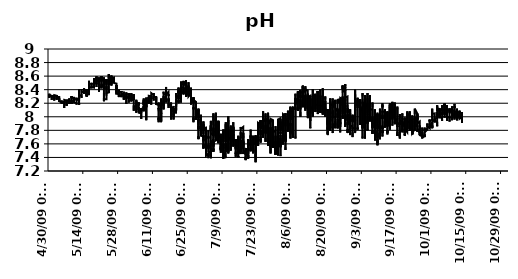
| Category | pH |
|---|---|
| 10/13/09 | 8.05 |
| 10/13/09 | 8.05 |
| 10/13/09 | 8.06 |
| 10/13/09 | 8.06 |
| 10/13/09 | 8.07 |
| 10/13/09 | 8.05 |
| 10/13/09 | 8.04 |
| 10/13/09 | 8.05 |
| 10/13/09 | 8.05 |
| 10/13/09 | 7.96 |
| 10/13/09 | 8.01 |
| 10/13/09 | 7.99 |
| 10/13/09 | 8 |
| 10/13/09 | 8.01 |
| 10/13/09 | 8 |
| 10/13/09 | 7.99 |
| 10/13/09 | 7.98 |
| 10/13/09 | 7.96 |
| 10/13/09 | 7.96 |
| 10/13/09 | 7.98 |
| 10/13/09 | 7.94 |
| 10/13/09 | 7.93 |
| 10/13/09 | 7.91 |
| 10/13/09 | 7.95 |
| 10/13/09 | 7.96 |
| 10/13/09 | 7.98 |
| 10/13/09 | 8 |
| 10/13/09 | 7.99 |
| 10/13/09 | 7.98 |
| 10/13/09 | 8 |
| 10/13/09 | 8 |
| 10/13/09 | 8 |
| 10/12/09 | 7.97 |
| 10/12/09 | 8.01 |
| 10/12/09 | 8 |
| 10/12/09 | 8 |
| 10/12/09 | 8.04 |
| 10/12/09 | 8.02 |
| 10/12/09 | 8.02 |
| 10/12/09 | 8 |
| 10/12/09 | 8.04 |
| 10/12/09 | 8.07 |
| 10/12/09 | 8.05 |
| 10/12/09 | 8.09 |
| 10/12/09 | 8.09 |
| 10/12/09 | 8.07 |
| 10/12/09 | 8.05 |
| 10/12/09 | 8.08 |
| 10/12/09 | 8.06 |
| 10/12/09 | 8.06 |
| 10/12/09 | 8.07 |
| 10/12/09 | 8.08 |
| 10/12/09 | 8.08 |
| 10/12/09 | 8.06 |
| 10/12/09 | 8.05 |
| 10/12/09 | 8.05 |
| 10/12/09 | 8.04 |
| 10/12/09 | 8.02 |
| 10/12/09 | 8.02 |
| 10/12/09 | 8.02 |
| 10/12/09 | 8.01 |
| 10/12/09 | 8 |
| 10/12/09 | 8 |
| 10/12/09 | 8 |
| 10/12/09 | 8.01 |
| 10/12/09 | 8.02 |
| 10/12/09 | 7.99 |
| 10/12/09 | 8.02 |
| 10/12/09 | 8.01 |
| 10/12/09 | 8.02 |
| 10/12/09 | 8 |
| 10/12/09 | 8 |
| 10/12/09 | 7.97 |
| 10/12/09 | 8.02 |
| 10/12/09 | 8.05 |
| 10/12/09 | 8.04 |
| 10/12/09 | 8.04 |
| 10/12/09 | 8.03 |
| 10/12/09 | 8.05 |
| 10/12/09 | 8.03 |
| 10/11/09 | 7.99 |
| 10/11/09 | 8.04 |
| 10/11/09 | 8.07 |
| 10/11/09 | 8.1 |
| 10/11/09 | 8.1 |
| 10/11/09 | 8.09 |
| 10/11/09 | 8.08 |
| 10/11/09 | 8.08 |
| 10/11/09 | 8.1 |
| 10/11/09 | 8.11 |
| 10/11/09 | 8.12 |
| 10/11/09 | 8.1 |
| 10/11/09 | 8.05 |
| 10/11/09 | 8.09 |
| 10/11/09 | 8.05 |
| 10/11/09 | 8.02 |
| 10/11/09 | 8.07 |
| 10/11/09 | 8.04 |
| 10/11/09 | 7.98 |
| 10/11/09 | 8.02 |
| 10/11/09 | 7.99 |
| 10/11/09 | 8 |
| 10/11/09 | 8.05 |
| 10/11/09 | 8.06 |
| 10/11/09 | 8.04 |
| 10/11/09 | 8.02 |
| 10/11/09 | 8.02 |
| 10/11/09 | 8 |
| 10/11/09 | 8.01 |
| 10/11/09 | 7.98 |
| 10/11/09 | 8 |
| 10/11/09 | 7.99 |
| 10/11/09 | 8.02 |
| 10/11/09 | 8.01 |
| 10/11/09 | 8.02 |
| 10/11/09 | 7.99 |
| 10/11/09 | 8.03 |
| 10/11/09 | 7.98 |
| 10/11/09 | 8.01 |
| 10/11/09 | 7.95 |
| 10/11/09 | 7.99 |
| 10/11/09 | 8 |
| 10/11/09 | 7.99 |
| 10/11/09 | 7.95 |
| 10/11/09 | 8.06 |
| 10/11/09 | 8.03 |
| 10/11/09 | 8.05 |
| 10/11/09 | 8.05 |
| 10/10/09 | 8.09 |
| 10/10/09 | 8.08 |
| 10/10/09 | 8.1 |
| 10/10/09 | 8.09 |
| 10/10/09 | 8.12 |
| 10/10/09 | 8.13 |
| 10/10/09 | 8.12 |
| 10/10/09 | 8.14 |
| 10/10/09 | 8.14 |
| 10/10/09 | 8.16 |
| 10/10/09 | 8.13 |
| 10/10/09 | 8.15 |
| 10/10/09 | 8.17 |
| 10/10/09 | 8.19 |
| 10/10/09 | 8.17 |
| 10/10/09 | 8.17 |
| 10/10/09 | 8.17 |
| 10/10/09 | 8.15 |
| 10/10/09 | 8.12 |
| 10/10/09 | 8.06 |
| 10/10/09 | 8.04 |
| 10/10/09 | 8.04 |
| 10/10/09 | 8.05 |
| 10/10/09 | 8.04 |
| 10/10/09 | 8.04 |
| 10/10/09 | 8.06 |
| 10/10/09 | 8.03 |
| 10/10/09 | 8.03 |
| 10/10/09 | 8.02 |
| 10/10/09 | 7.98 |
| 10/10/09 | 8.02 |
| 10/10/09 | 8 |
| 10/10/09 | 8.03 |
| 10/10/09 | 8.02 |
| 10/10/09 | 8.03 |
| 10/10/09 | 8.04 |
| 10/10/09 | 8.04 |
| 10/10/09 | 8.06 |
| 10/10/09 | 8.01 |
| 10/10/09 | 8 |
| 10/10/09 | 8.02 |
| 10/10/09 | 8.06 |
| 10/10/09 | 8.05 |
| 10/10/09 | 8.06 |
| 10/10/09 | 8.09 |
| 10/10/09 | 7.99 |
| 10/10/09 | 7.96 |
| 10/10/09 | 8.08 |
| 10/9/09 | 8.1 |
| 10/9/09 | 8.06 |
| 10/9/09 | 8.06 |
| 10/9/09 | 8.15 |
| 10/9/09 | 8.08 |
| 10/9/09 | 8.15 |
| 10/9/09 | 8.14 |
| 10/9/09 | 8.13 |
| 10/9/09 | 8.09 |
| 10/9/09 | 8.08 |
| 10/9/09 | 8.1 |
| 10/9/09 | 8.12 |
| 10/9/09 | 8.07 |
| 10/9/09 | 8.13 |
| 10/9/09 | 8.1 |
| 10/9/09 | 8.07 |
| 10/9/09 | 8.04 |
| 10/9/09 | 8.03 |
| 10/9/09 | 8.06 |
| 10/9/09 | 8.04 |
| 10/9/09 | 7.98 |
| 10/9/09 | 8.05 |
| 10/9/09 | 7.95 |
| 10/9/09 | 8.01 |
| 10/9/09 | 7.98 |
| 10/9/09 | 8 |
| 10/9/09 | 7.98 |
| 10/9/09 | 8 |
| 10/9/09 | 7.98 |
| 10/9/09 | 8.02 |
| 10/9/09 | 8.01 |
| 10/9/09 | 8.04 |
| 10/9/09 | 8.05 |
| 10/9/09 | 8.07 |
| 10/9/09 | 8.06 |
| 10/9/09 | 8.08 |
| 10/9/09 | 8.04 |
| 10/9/09 | 8.03 |
| 10/9/09 | 8.02 |
| 10/9/09 | 8 |
| 10/9/09 | 8.03 |
| 10/9/09 | 8.02 |
| 10/9/09 | 8.04 |
| 10/9/09 | 8.02 |
| 10/9/09 | 8.05 |
| 10/9/09 | 8.11 |
| 10/9/09 | 8.09 |
| 10/9/09 | 8.07 |
| 10/8/09 | 8.09 |
| 10/8/09 | 8.1 |
| 10/8/09 | 8.11 |
| 10/8/09 | 8.12 |
| 10/8/09 | 8.09 |
| 10/8/09 | 8.12 |
| 10/8/09 | 8.1 |
| 10/8/09 | 8.08 |
| 10/8/09 | 8.05 |
| 10/8/09 | 8.11 |
| 10/8/09 | 8.08 |
| 10/8/09 | 8.1 |
| 10/8/09 | 8.1 |
| 10/8/09 | 8.12 |
| 10/8/09 | 8.11 |
| 10/8/09 | 8.1 |
| 10/8/09 | 8.12 |
| 10/8/09 | 8.12 |
| 10/8/09 | 8.06 |
| 10/8/09 | 8.06 |
| 10/8/09 | 8.06 |
| 10/8/09 | 8.03 |
| 10/8/09 | 8.02 |
| 10/8/09 | 8.01 |
| 10/8/09 | 8.01 |
| 10/8/09 | 7.97 |
| 10/8/09 | 7.93 |
| 10/8/09 | 7.95 |
| 10/8/09 | 7.95 |
| 10/8/09 | 7.95 |
| 10/8/09 | 7.96 |
| 10/8/09 | 7.97 |
| 10/8/09 | 7.96 |
| 10/8/09 | 7.97 |
| 10/8/09 | 7.96 |
| 10/8/09 | 7.97 |
| 10/8/09 | 7.98 |
| 10/8/09 | 7.97 |
| 10/8/09 | 8 |
| 10/8/09 | 7.98 |
| 10/8/09 | 7.99 |
| 10/8/09 | 8 |
| 10/8/09 | 7.99 |
| 10/8/09 | 8 |
| 10/8/09 | 8 |
| 10/8/09 | 8 |
| 10/8/09 | 7.99 |
| 10/8/09 | 7.99 |
| 10/7/09 | 7.99 |
| 10/7/09 | 8 |
| 10/7/09 | 8.01 |
| 10/7/09 | 8 |
| 10/7/09 | 7.99 |
| 10/7/09 | 8.01 |
| 10/7/09 | 8.01 |
| 10/7/09 | 8.01 |
| 10/7/09 | 8.02 |
| 10/7/09 | 8.02 |
| 10/7/09 | 8.04 |
| 10/7/09 | 8.05 |
| 10/7/09 | 8.05 |
| 10/7/09 | 8.04 |
| 10/7/09 | 8.05 |
| 10/7/09 | 8.05 |
| 10/7/09 | 8.03 |
| 10/7/09 | 8.03 |
| 10/7/09 | 8.03 |
| 10/7/09 | 8.03 |
| 10/7/09 | 8.03 |
| 10/7/09 | 8.03 |
| 10/7/09 | 8.04 |
| 10/7/09 | 8.03 |
| 10/7/09 | 8.01 |
| 10/7/09 | 8 |
| 10/7/09 | 7.99 |
| 10/7/09 | 7.99 |
| 10/7/09 | 7.98 |
| 10/7/09 | 7.98 |
| 10/7/09 | 7.98 |
| 10/7/09 | 7.99 |
| 10/7/09 | 7.99 |
| 10/7/09 | 8 |
| 10/7/09 | 7.98 |
| 10/7/09 | 7.97 |
| 10/7/09 | 7.94 |
| 10/7/09 | 8 |
| 10/7/09 | 7.98 |
| 10/7/09 | 8.07 |
| 10/7/09 | 8.06 |
| 10/7/09 | 8.08 |
| 10/7/09 | 8.09 |
| 10/7/09 | 8.1 |
| 10/7/09 | 8.13 |
| 10/7/09 | 8.13 |
| 10/7/09 | 8.16 |
| 10/7/09 | 8.17 |
| 10/6/09 | 8.16 |
| 10/6/09 | 8.17 |
| 10/6/09 | 8.17 |
| 10/6/09 | 8.17 |
| 10/6/09 | 8.18 |
| 10/6/09 | 8.11 |
| 10/6/09 | 8.13 |
| 10/6/09 | 8.05 |
| 10/6/09 | 8.07 |
| 10/6/09 | 8.13 |
| 10/6/09 | 8.17 |
| 10/6/09 | 8.17 |
| 10/6/09 | 8.16 |
| 10/6/09 | 8.19 |
| 10/6/09 | 8.13 |
| 10/6/09 | 8.2 |
| 10/6/09 | 8.17 |
| 10/6/09 | 8.12 |
| 10/6/09 | 8.09 |
| 10/6/09 | 8.09 |
| 10/6/09 | 8.11 |
| 10/6/09 | 8.05 |
| 10/6/09 | 8.03 |
| 10/6/09 | 8.08 |
| 10/6/09 | 8.04 |
| 10/6/09 | 7.99 |
| 10/6/09 | 7.98 |
| 10/6/09 | 8 |
| 10/6/09 | 8.01 |
| 10/6/09 | 8.01 |
| 10/6/09 | 7.99 |
| 10/6/09 | 8.01 |
| 10/6/09 | 8.02 |
| 10/6/09 | 8.05 |
| 10/6/09 | 8.05 |
| 10/6/09 | 8.05 |
| 10/6/09 | 8.05 |
| 10/6/09 | 8.03 |
| 10/6/09 | 8.05 |
| 10/6/09 | 8.05 |
| 10/6/09 | 8.05 |
| 10/6/09 | 8.06 |
| 10/6/09 | 8.07 |
| 10/6/09 | 8.07 |
| 10/6/09 | 8.05 |
| 10/6/09 | 8.06 |
| 10/6/09 | 8.09 |
| 10/6/09 | 8.1 |
| 10/5/09 | 8.11 |
| 10/5/09 | 8.13 |
| 10/5/09 | 8.13 |
| 10/5/09 | 8.12 |
| 10/5/09 | 8.13 |
| 10/5/09 | 8.14 |
| 10/5/09 | 8.12 |
| 10/5/09 | 8.08 |
| 10/5/09 | 8.15 |
| 10/5/09 | 8.11 |
| 10/5/09 | 8.17 |
| 10/5/09 | 8.1 |
| 10/5/09 | 8.12 |
| 10/5/09 | 8.1 |
| 10/5/09 | 8.05 |
| 10/5/09 | 8.06 |
| 10/5/09 | 8.06 |
| 10/5/09 | 8.05 |
| 10/5/09 | 8.07 |
| 10/5/09 | 8.05 |
| 10/5/09 | 8.03 |
| 10/5/09 | 8.04 |
| 10/5/09 | 8.03 |
| 10/5/09 | 8.05 |
| 10/5/09 | 8.02 |
| 10/5/09 | 8.01 |
| 10/5/09 | 7.98 |
| 10/5/09 | 7.94 |
| 10/5/09 | 7.93 |
| 10/5/09 | 7.94 |
| 10/5/09 | 7.93 |
| 10/5/09 | 7.94 |
| 10/5/09 | 7.93 |
| 10/5/09 | 7.93 |
| 10/5/09 | 7.93 |
| 10/5/09 | 7.93 |
| 10/5/09 | 7.93 |
| 10/5/09 | 7.95 |
| 10/5/09 | 7.93 |
| 10/5/09 | 7.94 |
| 10/5/09 | 7.94 |
| 10/5/09 | 7.94 |
| 10/5/09 | 7.94 |
| 10/5/09 | 7.95 |
| 10/5/09 | 7.95 |
| 10/5/09 | 7.96 |
| 10/5/09 | 7.96 |
| 10/5/09 | 7.98 |
| 10/4/09 | 8 |
| 10/4/09 | 8 |
| 10/4/09 | 8.01 |
| 10/4/09 | 8.01 |
| 10/4/09 | 8.01 |
| 10/4/09 | 8.04 |
| 10/4/09 | 8.04 |
| 10/4/09 | 8.05 |
| 10/4/09 | 8.05 |
| 10/4/09 | 8.07 |
| 10/4/09 | 8.06 |
| 10/4/09 | 8.06 |
| 10/4/09 | 8.09 |
| 10/4/09 | 8.11 |
| 10/4/09 | 8.1 |
| 10/4/09 | 8.06 |
| 10/4/09 | 8.03 |
| 10/4/09 | 8 |
| 10/4/09 | 8.05 |
| 10/4/09 | 8.05 |
| 10/4/09 | 8.04 |
| 10/4/09 | 8.04 |
| 10/4/09 | 8.04 |
| 10/4/09 | 8.05 |
| 10/4/09 | 8.03 |
| 10/4/09 | 8.01 |
| 10/4/09 | 7.98 |
| 10/4/09 | 7.99 |
| 10/4/09 | 8.02 |
| 10/4/09 | 8.04 |
| 10/4/09 | 8 |
| 10/4/09 | 8.01 |
| 10/4/09 | 7.98 |
| 10/4/09 | 8.04 |
| 10/4/09 | 8.01 |
| 10/4/09 | 8.06 |
| 10/4/09 | 8.05 |
| 10/4/09 | 8.05 |
| 10/4/09 | 8.08 |
| 10/4/09 | 8.07 |
| 10/4/09 | 8.09 |
| 10/4/09 | 8.13 |
| 10/4/09 | 8.11 |
| 10/4/09 | 8.08 |
| 10/4/09 | 8.11 |
| 10/4/09 | 8.06 |
| 10/4/09 | 8.04 |
| 10/4/09 | 8.1 |
| 10/3/09 | 8.13 |
| 10/3/09 | 8.09 |
| 10/3/09 | 8.12 |
| 10/3/09 | 8.1 |
| 10/3/09 | 8.17 |
| 10/3/09 | 8.1 |
| 10/3/09 | 8.12 |
| 10/3/09 | 8.1 |
| 10/3/09 | 8.11 |
| 10/3/09 | 8.13 |
| 10/3/09 | 8.1 |
| 10/3/09 | 8.15 |
| 10/3/09 | 8.15 |
| 10/3/09 | 8.15 |
| 10/3/09 | 8.16 |
| 10/3/09 | 8.13 |
| 10/3/09 | 8.13 |
| 10/3/09 | 8.1 |
| 10/3/09 | 8.03 |
| 10/3/09 | 7.97 |
| 10/3/09 | 8.03 |
| 10/3/09 | 8.07 |
| 10/3/09 | 8.05 |
| 10/3/09 | 8.01 |
| 10/3/09 | 7.98 |
| 10/3/09 | 7.93 |
| 10/3/09 | 7.89 |
| 10/3/09 | 7.86 |
| 10/3/09 | 7.87 |
| 10/3/09 | 7.88 |
| 10/3/09 | 7.89 |
| 10/3/09 | 7.9 |
| 10/3/09 | 7.9 |
| 10/3/09 | 7.9 |
| 10/3/09 | 7.89 |
| 10/3/09 | 7.9 |
| 10/3/09 | 7.9 |
| 10/3/09 | 7.92 |
| 10/3/09 | 7.91 |
| 10/3/09 | 7.92 |
| 10/3/09 | 7.92 |
| 10/3/09 | 7.92 |
| 10/3/09 | 7.92 |
| 10/3/09 | 7.92 |
| 10/3/09 | 7.91 |
| 10/3/09 | 7.93 |
| 10/3/09 | 7.91 |
| 10/3/09 | 7.92 |
| 10/2/09 | 7.95 |
| 10/2/09 | 7.95 |
| 10/2/09 | 7.96 |
| 10/2/09 | 7.95 |
| 10/2/09 | 7.96 |
| 10/2/09 | 7.97 |
| 10/2/09 | 7.96 |
| 10/2/09 | 7.98 |
| 10/2/09 | 7.96 |
| 10/2/09 | 7.96 |
| 10/2/09 | 7.99 |
| 10/2/09 | 7.98 |
| 10/2/09 | 8 |
| 10/2/09 | 8 |
| 10/2/09 | 8 |
| 10/2/09 | 7.99 |
| 10/2/09 | 7.99 |
| 10/2/09 | 7.99 |
| 10/2/09 | 7.92 |
| 10/2/09 | 7.95 |
| 10/2/09 | 7.92 |
| 10/2/09 | 7.94 |
| 10/2/09 | 7.97 |
| 10/2/09 | 7.98 |
| 10/2/09 | 7.97 |
| 10/2/09 | 7.93 |
| 10/2/09 | 7.94 |
| 10/2/09 | 7.95 |
| 10/2/09 | 7.96 |
| 10/2/09 | 7.94 |
| 10/2/09 | 7.95 |
| 10/2/09 | 7.95 |
| 10/2/09 | 7.93 |
| 10/2/09 | 7.94 |
| 10/2/09 | 7.93 |
| 10/2/09 | 7.94 |
| 10/2/09 | 7.94 |
| 10/2/09 | 7.95 |
| 10/2/09 | 7.97 |
| 10/2/09 | 7.96 |
| 10/2/09 | 7.96 |
| 10/2/09 | 7.96 |
| 10/2/09 | 7.97 |
| 10/2/09 | 7.98 |
| 10/2/09 | 8 |
| 10/2/09 | 8.01 |
| 10/2/09 | 8.02 |
| 10/2/09 | 8.05 |
| 10/1/09 | 8.04 |
| 10/1/09 | 8.04 |
| 10/1/09 | 8.05 |
| 10/1/09 | 8.06 |
| 10/1/09 | 8.07 |
| 10/1/09 | 8.07 |
| 10/1/09 | 8.09 |
| 10/1/09 | 8.09 |
| 10/1/09 | 8.12 |
| 10/1/09 | 8.04 |
| 10/1/09 | 8.04 |
| 10/1/09 | 8.06 |
| 10/1/09 | 7.99 |
| 10/1/09 | 8 |
| 10/1/09 | 8.03 |
| 10/1/09 | 8.02 |
| 10/1/09 | 7.98 |
| 10/1/09 | 7.95 |
| 10/1/09 | 7.97 |
| 10/1/09 | 7.94 |
| 10/1/09 | 7.9 |
| 10/1/09 | 7.86 |
| 10/1/09 | 7.92 |
| 10/1/09 | 7.89 |
| 10/1/09 | 7.9 |
| 10/1/09 | 7.87 |
| 10/1/09 | 7.88 |
| 10/1/09 | 7.83 |
| 10/1/09 | 7.84 |
| 10/1/09 | 7.84 |
| 10/1/09 | 7.84 |
| 10/1/09 | 7.83 |
| 10/1/09 | 7.83 |
| 10/1/09 | 7.83 |
| 10/1/09 | 7.83 |
| 10/1/09 | 7.84 |
| 10/1/09 | 7.84 |
| 10/1/09 | 7.85 |
| 10/1/09 | 7.86 |
| 10/1/09 | 7.85 |
| 10/1/09 | 7.85 |
| 10/1/09 | 7.87 |
| 10/1/09 | 7.87 |
| 10/1/09 | 7.84 |
| 10/1/09 | 7.86 |
| 10/1/09 | 7.86 |
| 10/1/09 | 7.84 |
| 10/1/09 | 7.87 |
| 9/30/09 | 7.88 |
| 9/30/09 | 7.88 |
| 9/30/09 | 7.87 |
| 9/30/09 | 7.87 |
| 9/30/09 | 7.9 |
| 9/30/09 | 7.91 |
| 9/30/09 | 7.93 |
| 9/30/09 | 7.95 |
| 9/30/09 | 7.96 |
| 9/30/09 | 7.93 |
| 9/30/09 | 7.96 |
| 9/30/09 | 7.95 |
| 9/30/09 | 7.96 |
| 9/30/09 | 7.95 |
| 9/30/09 | 7.94 |
| 9/30/09 | 7.93 |
| 9/30/09 | 7.91 |
| 9/30/09 | 7.9 |
| 9/30/09 | 7.91 |
| 9/30/09 | 7.88 |
| 9/30/09 | 7.89 |
| 9/30/09 | 7.89 |
| 9/30/09 | 7.89 |
| 9/30/09 | 7.89 |
| 9/30/09 | 7.89 |
| 9/30/09 | 7.9 |
| 9/30/09 | 7.89 |
| 9/30/09 | 7.87 |
| 9/30/09 | 7.86 |
| 9/30/09 | 7.84 |
| 9/30/09 | 7.83 |
| 9/30/09 | 7.83 |
| 9/30/09 | 7.83 |
| 9/30/09 | 7.83 |
| 9/30/09 | 7.85 |
| 9/30/09 | 7.87 |
| 9/30/09 | 7.85 |
| 9/30/09 | 7.84 |
| 9/30/09 | 7.85 |
| 9/30/09 | 7.86 |
| 9/30/09 | 7.84 |
| 9/30/09 | 7.86 |
| 9/30/09 | 7.86 |
| 9/30/09 | 7.85 |
| 9/30/09 | 7.86 |
| 9/30/09 | 7.87 |
| 9/30/09 | 7.87 |
| 9/30/09 | 7.83 |
| 9/29/09 | 7.86 |
| 9/29/09 | 7.87 |
| 9/29/09 | 7.86 |
| 9/29/09 | 7.88 |
| 9/29/09 | 7.88 |
| 9/29/09 | 7.88 |
| 9/29/09 | 7.88 |
| 9/29/09 | 7.89 |
| 9/29/09 | 7.89 |
| 9/29/09 | 7.88 |
| 9/29/09 | 7.89 |
| 9/29/09 | 7.9 |
| 9/29/09 | 7.9 |
| 9/29/09 | 7.9 |
| 9/29/09 | 7.9 |
| 9/29/09 | 7.89 |
| 9/29/09 | 7.89 |
| 9/29/09 | 7.89 |
| 9/29/09 | 7.89 |
| 9/29/09 | 7.88 |
| 9/29/09 | 7.87 |
| 9/29/09 | 7.87 |
| 9/29/09 | 7.87 |
| 9/29/09 | 7.85 |
| 9/29/09 | 7.84 |
| 9/29/09 | 7.85 |
| 9/29/09 | 7.83 |
| 9/29/09 | 7.83 |
| 9/29/09 | 7.82 |
| 9/29/09 | 7.82 |
| 9/29/09 | 7.82 |
| 9/29/09 | 7.82 |
| 9/29/09 | 7.81 |
| 9/29/09 | 7.82 |
| 9/29/09 | 7.83 |
| 9/29/09 | 7.82 |
| 9/29/09 | 7.82 |
| 9/29/09 | 7.82 |
| 9/29/09 | 7.83 |
| 9/29/09 | 7.83 |
| 9/29/09 | 7.82 |
| 9/29/09 | 7.82 |
| 9/29/09 | 7.81 |
| 9/29/09 | 7.81 |
| 9/29/09 | 7.82 |
| 9/29/09 | 7.81 |
| 9/29/09 | 7.82 |
| 9/29/09 | 7.82 |
| 9/28/09 | 7.77 |
| 9/28/09 | 7.82 |
| 9/28/09 | 7.81 |
| 9/28/09 | 7.79 |
| 9/28/09 | 7.82 |
| 9/28/09 | 7.83 |
| 9/28/09 | 7.84 |
| 9/28/09 | 7.85 |
| 9/28/09 | 7.84 |
| 9/28/09 | 7.85 |
| 9/28/09 | 7.84 |
| 9/28/09 | 7.84 |
| 9/28/09 | 7.85 |
| 9/28/09 | 7.84 |
| 9/28/09 | 7.82 |
| 9/28/09 | 7.83 |
| 9/28/09 | 7.82 |
| 9/28/09 | 7.82 |
| 9/28/09 | 7.81 |
| 9/28/09 | 7.8 |
| 9/28/09 | 7.8 |
| 9/28/09 | 7.79 |
| 9/28/09 | 7.77 |
| 9/28/09 | 7.77 |
| 9/28/09 | 7.78 |
| 9/28/09 | 7.74 |
| 9/28/09 | 7.74 |
| 9/28/09 | 7.74 |
| 9/28/09 | 7.74 |
| 9/28/09 | 7.74 |
| 9/28/09 | 7.74 |
| 9/28/09 | 7.74 |
| 9/28/09 | 7.73 |
| 9/28/09 | 7.72 |
| 9/28/09 | 7.73 |
| 9/28/09 | 7.74 |
| 9/28/09 | 7.73 |
| 9/28/09 | 7.71 |
| 9/28/09 | 7.71 |
| 9/28/09 | 7.73 |
| 9/28/09 | 7.72 |
| 9/28/09 | 7.71 |
| 9/28/09 | 7.72 |
| 9/28/09 | 7.73 |
| 9/28/09 | 7.72 |
| 9/28/09 | 7.72 |
| 9/28/09 | 7.73 |
| 9/28/09 | 7.71 |
| 9/27/09 | 7.7 |
| 9/27/09 | 7.73 |
| 9/27/09 | 7.72 |
| 9/27/09 | 7.74 |
| 9/27/09 | 7.69 |
| 9/27/09 | 7.73 |
| 9/27/09 | 7.79 |
| 9/27/09 | 7.8 |
| 9/27/09 | 7.84 |
| 9/27/09 | 7.82 |
| 9/27/09 | 7.83 |
| 9/27/09 | 7.81 |
| 9/27/09 | 7.81 |
| 9/27/09 | 7.78 |
| 9/27/09 | 7.76 |
| 9/27/09 | 7.77 |
| 9/27/09 | 7.77 |
| 9/27/09 | 7.75 |
| 9/27/09 | 7.75 |
| 9/27/09 | 7.75 |
| 9/27/09 | 7.74 |
| 9/27/09 | 7.77 |
| 9/27/09 | 7.75 |
| 9/27/09 | 7.75 |
| 9/27/09 | 7.75 |
| 9/27/09 | 7.71 |
| 9/27/09 | 7.68 |
| 9/27/09 | 7.67 |
| 9/27/09 | 7.71 |
| 9/27/09 | 7.72 |
| 9/27/09 | 7.73 |
| 9/27/09 | 7.73 |
| 9/27/09 | 7.72 |
| 9/27/09 | 7.72 |
| 9/27/09 | 7.72 |
| 9/27/09 | 7.7 |
| 9/27/09 | 7.72 |
| 9/27/09 | 7.72 |
| 9/27/09 | 7.7 |
| 9/27/09 | 7.72 |
| 9/27/09 | 7.72 |
| 9/27/09 | 7.73 |
| 9/27/09 | 7.72 |
| 9/27/09 | 7.75 |
| 9/27/09 | 7.74 |
| 9/27/09 | 7.74 |
| 9/27/09 | 7.75 |
| 9/27/09 | 7.71 |
| 9/26/09 | 7.73 |
| 9/26/09 | 7.74 |
| 9/26/09 | 7.74 |
| 9/26/09 | 7.76 |
| 9/26/09 | 7.76 |
| 9/26/09 | 7.73 |
| 9/26/09 | 7.77 |
| 9/26/09 | 7.79 |
| 9/26/09 | 7.76 |
| 9/26/09 | 7.8 |
| 9/26/09 | 7.83 |
| 9/26/09 | 7.85 |
| 9/26/09 | 7.85 |
| 9/26/09 | 7.87 |
| 9/26/09 | 7.84 |
| 9/26/09 | 7.85 |
| 9/26/09 | 7.84 |
| 9/26/09 | 7.82 |
| 9/26/09 | 7.82 |
| 9/26/09 | 7.83 |
| 9/26/09 | 7.82 |
| 9/26/09 | 7.76 |
| 9/26/09 | 7.8 |
| 9/26/09 | 7.81 |
| 9/26/09 | 7.8 |
| 9/26/09 | 7.79 |
| 9/26/09 | 7.82 |
| 9/26/09 | 7.8 |
| 9/26/09 | 7.82 |
| 9/26/09 | 7.82 |
| 9/26/09 | 7.82 |
| 9/26/09 | 7.79 |
| 9/26/09 | 7.81 |
| 9/26/09 | 7.8 |
| 9/26/09 | 7.77 |
| 9/26/09 | 7.81 |
| 9/26/09 | 7.84 |
| 9/26/09 | 7.8 |
| 9/26/09 | 7.83 |
| 9/26/09 | 7.85 |
| 9/26/09 | 7.89 |
| 9/26/09 | 7.89 |
| 9/26/09 | 7.89 |
| 9/26/09 | 7.91 |
| 9/26/09 | 7.91 |
| 9/26/09 | 7.92 |
| 9/26/09 | 7.93 |
| 9/26/09 | 7.92 |
| 9/25/09 | 7.9 |
| 9/25/09 | 7.94 |
| 9/25/09 | 7.97 |
| 9/25/09 | 7.99 |
| 9/25/09 | 7.96 |
| 9/25/09 | 7.98 |
| 9/25/09 | 8 |
| 9/25/09 | 7.99 |
| 9/25/09 | 8.05 |
| 9/25/09 | 7.97 |
| 9/25/09 | 8.02 |
| 9/25/09 | 7.97 |
| 9/25/09 | 7.93 |
| 9/25/09 | 8 |
| 9/25/09 | 8.01 |
| 9/25/09 | 8.02 |
| 9/25/09 | 8 |
| 9/25/09 | 7.96 |
| 9/25/09 | 7.99 |
| 9/25/09 | 7.96 |
| 9/25/09 | 7.92 |
| 9/25/09 | 7.91 |
| 9/25/09 | 7.89 |
| 9/25/09 | 7.87 |
| 9/25/09 | 7.85 |
| 9/25/09 | 7.85 |
| 9/25/09 | 7.87 |
| 9/25/09 | 7.87 |
| 9/25/09 | 7.89 |
| 9/25/09 | 7.86 |
| 9/25/09 | 7.85 |
| 9/25/09 | 7.84 |
| 9/25/09 | 7.83 |
| 9/25/09 | 7.82 |
| 9/25/09 | 7.81 |
| 9/25/09 | 7.78 |
| 9/25/09 | 7.78 |
| 9/25/09 | 7.81 |
| 9/25/09 | 7.86 |
| 9/25/09 | 7.88 |
| 9/25/09 | 7.89 |
| 9/25/09 | 7.92 |
| 9/25/09 | 7.95 |
| 9/25/09 | 8.04 |
| 9/25/09 | 8.01 |
| 9/25/09 | 8.02 |
| 9/25/09 | 8.05 |
| 9/25/09 | 8.06 |
| 9/24/09 | 8.12 |
| 9/24/09 | 8.12 |
| 9/24/09 | 8.04 |
| 9/24/09 | 8.02 |
| 9/24/09 | 8 |
| 9/24/09 | 7.95 |
| 9/24/09 | 7.88 |
| 9/24/09 | 7.79 |
| 9/24/09 | 7.83 |
| 9/24/09 | 7.85 |
| 9/24/09 | 7.89 |
| 9/24/09 | 7.95 |
| 9/24/09 | 7.95 |
| 9/24/09 | 7.95 |
| 9/24/09 | 7.98 |
| 9/24/09 | 7.99 |
| 9/24/09 | 7.97 |
| 9/24/09 | 8 |
| 9/24/09 | 8.01 |
| 9/24/09 | 7.97 |
| 9/24/09 | 7.94 |
| 9/24/09 | 7.88 |
| 9/24/09 | 7.9 |
| 9/24/09 | 7.9 |
| 9/24/09 | 7.9 |
| 9/24/09 | 7.89 |
| 9/24/09 | 7.9 |
| 9/24/09 | 7.91 |
| 9/24/09 | 7.92 |
| 9/24/09 | 7.91 |
| 9/24/09 | 7.92 |
| 9/24/09 | 7.94 |
| 9/24/09 | 7.92 |
| 9/24/09 | 7.91 |
| 9/24/09 | 7.94 |
| 9/24/09 | 7.96 |
| 9/24/09 | 7.98 |
| 9/24/09 | 7.95 |
| 9/24/09 | 7.97 |
| 9/24/09 | 7.97 |
| 9/24/09 | 7.91 |
| 9/24/09 | 7.89 |
| 9/24/09 | 7.88 |
| 9/24/09 | 7.85 |
| 9/24/09 | 7.87 |
| 9/24/09 | 7.92 |
| 9/24/09 | 7.9 |
| 9/24/09 | 7.82 |
| 9/23/09 | 7.76 |
| 9/23/09 | 7.76 |
| 9/23/09 | 7.83 |
| 9/23/09 | 7.88 |
| 9/23/09 | 7.88 |
| 9/23/09 | 7.81 |
| 9/23/09 | 7.8 |
| 9/23/09 | 7.85 |
| 9/23/09 | 7.92 |
| 9/23/09 | 7.85 |
| 9/23/09 | 7.88 |
| 9/23/09 | 7.93 |
| 9/23/09 | 8.01 |
| 9/23/09 | 7.9 |
| 9/23/09 | 7.9 |
| 9/23/09 | 7.9 |
| 9/23/09 | 7.92 |
| 9/23/09 | 7.98 |
| 9/23/09 | 7.83 |
| 9/23/09 | 7.79 |
| 9/23/09 | 7.77 |
| 9/23/09 | 7.74 |
| 9/23/09 | 7.81 |
| 9/23/09 | 7.85 |
| 9/23/09 | 7.75 |
| 9/23/09 | 7.77 |
| 9/23/09 | 7.8 |
| 9/23/09 | 7.74 |
| 9/23/09 | 7.73 |
| 9/23/09 | 7.73 |
| 9/23/09 | 7.74 |
| 9/23/09 | 7.77 |
| 9/23/09 | 7.78 |
| 9/23/09 | 7.79 |
| 9/23/09 | 7.78 |
| 9/23/09 | 7.77 |
| 9/23/09 | 7.8 |
| 9/23/09 | 7.8 |
| 9/23/09 | 7.81 |
| 9/23/09 | 7.82 |
| 9/23/09 | 7.84 |
| 9/23/09 | 7.91 |
| 9/23/09 | 7.94 |
| 9/23/09 | 7.93 |
| 9/23/09 | 8.02 |
| 9/23/09 | 8 |
| 9/23/09 | 7.98 |
| 9/23/09 | 7.94 |
| 9/22/09 | 7.97 |
| 9/22/09 | 7.94 |
| 9/22/09 | 7.93 |
| 9/22/09 | 7.95 |
| 9/22/09 | 7.96 |
| 9/22/09 | 7.84 |
| 9/22/09 | 7.79 |
| 9/22/09 | 7.79 |
| 9/22/09 | 7.89 |
| 9/22/09 | 7.99 |
| 9/22/09 | 8.06 |
| 9/22/09 | 8.08 |
| 9/22/09 | 8.09 |
| 9/22/09 | 8.08 |
| 9/22/09 | 8.04 |
| 9/22/09 | 8.02 |
| 9/22/09 | 7.99 |
| 9/22/09 | 7.95 |
| 9/22/09 | 7.98 |
| 9/22/09 | 7.93 |
| 9/22/09 | 7.91 |
| 9/22/09 | 7.96 |
| 9/22/09 | 7.96 |
| 9/22/09 | 7.96 |
| 9/22/09 | 7.87 |
| 9/22/09 | 7.84 |
| 9/22/09 | 7.86 |
| 9/22/09 | 7.88 |
| 9/22/09 | 7.91 |
| 9/22/09 | 7.82 |
| 9/22/09 | 7.89 |
| 9/22/09 | 7.9 |
| 9/22/09 | 7.89 |
| 9/22/09 | 7.9 |
| 9/22/09 | 7.84 |
| 9/22/09 | 7.83 |
| 9/22/09 | 7.9 |
| 9/22/09 | 8.03 |
| 9/22/09 | 8.04 |
| 9/22/09 | 7.99 |
| 9/22/09 | 8.05 |
| 9/22/09 | 7.99 |
| 9/22/09 | 7.92 |
| 9/22/09 | 7.91 |
| 9/22/09 | 7.88 |
| 9/22/09 | 7.83 |
| 9/22/09 | 7.87 |
| 9/22/09 | 7.9 |
| 9/21/09 | 7.94 |
| 9/21/09 | 8.03 |
| 9/21/09 | 8.04 |
| 9/21/09 | 8.01 |
| 9/21/09 | 7.97 |
| 9/21/09 | 7.96 |
| 9/21/09 | 7.93 |
| 9/21/09 | 7.97 |
| 9/21/09 | 7.98 |
| 9/21/09 | 8.08 |
| 9/21/09 | 8 |
| 9/21/09 | 8.04 |
| 9/21/09 | 7.97 |
| 9/21/09 | 7.94 |
| 9/21/09 | 7.93 |
| 9/21/09 | 7.91 |
| 9/21/09 | 7.93 |
| 9/21/09 | 8.06 |
| 9/21/09 | 7.87 |
| 9/21/09 | 7.91 |
| 9/21/09 | 7.94 |
| 9/21/09 | 8.01 |
| 9/21/09 | 7.95 |
| 9/21/09 | 7.96 |
| 9/21/09 | 7.91 |
| 9/21/09 | 7.89 |
| 9/21/09 | 7.85 |
| 9/21/09 | 7.83 |
| 9/21/09 | 7.86 |
| 9/21/09 | 7.85 |
| 9/21/09 | 7.87 |
| 9/21/09 | 7.84 |
| 9/21/09 | 7.82 |
| 9/21/09 | 7.87 |
| 9/21/09 | 7.84 |
| 9/21/09 | 7.83 |
| 9/21/09 | 7.85 |
| 9/21/09 | 7.88 |
| 9/21/09 | 7.86 |
| 9/21/09 | 7.84 |
| 9/21/09 | 7.84 |
| 9/21/09 | 7.88 |
| 9/21/09 | 7.83 |
| 9/21/09 | 7.85 |
| 9/21/09 | 7.79 |
| 9/21/09 | 7.79 |
| 9/21/09 | 7.8 |
| 9/21/09 | 7.77 |
| 9/20/09 | 7.82 |
| 9/20/09 | 7.83 |
| 9/20/09 | 7.86 |
| 9/20/09 | 7.86 |
| 9/20/09 | 7.97 |
| 9/20/09 | 7.95 |
| 9/20/09 | 7.97 |
| 9/20/09 | 7.85 |
| 9/20/09 | 7.91 |
| 9/20/09 | 7.86 |
| 9/20/09 | 7.92 |
| 9/20/09 | 7.99 |
| 9/20/09 | 7.91 |
| 9/20/09 | 7.82 |
| 9/20/09 | 7.84 |
| 9/20/09 | 7.93 |
| 9/20/09 | 7.94 |
| 9/20/09 | 7.89 |
| 9/20/09 | 7.85 |
| 9/20/09 | 7.84 |
| 9/20/09 | 7.84 |
| 9/20/09 | 7.77 |
| 9/20/09 | 7.78 |
| 9/20/09 | 7.8 |
| 9/20/09 | 7.81 |
| 9/20/09 | 7.8 |
| 9/20/09 | 7.8 |
| 9/20/09 | 7.8 |
| 9/20/09 | 7.75 |
| 9/20/09 | 7.76 |
| 9/20/09 | 7.73 |
| 9/20/09 | 7.73 |
| 9/20/09 | 7.75 |
| 9/20/09 | 7.72 |
| 9/20/09 | 7.71 |
| 9/20/09 | 7.72 |
| 9/20/09 | 7.75 |
| 9/20/09 | 7.74 |
| 9/20/09 | 7.77 |
| 9/20/09 | 7.79 |
| 9/20/09 | 7.76 |
| 9/20/09 | 7.77 |
| 9/20/09 | 7.8 |
| 9/20/09 | 7.84 |
| 9/20/09 | 7.85 |
| 9/20/09 | 7.85 |
| 9/20/09 | 7.88 |
| 9/20/09 | 7.85 |
| 9/19/09 | 7.93 |
| 9/19/09 | 7.91 |
| 9/19/09 | 7.86 |
| 9/19/09 | 7.92 |
| 9/19/09 | 7.86 |
| 9/19/09 | 7.86 |
| 9/19/09 | 7.86 |
| 9/19/09 | 7.9 |
| 9/19/09 | 7.94 |
| 9/19/09 | 7.98 |
| 9/19/09 | 7.96 |
| 9/19/09 | 8 |
| 9/19/09 | 8.01 |
| 9/19/09 | 8.05 |
| 9/19/09 | 8.02 |
| 9/19/09 | 8 |
| 9/19/09 | 7.93 |
| 9/19/09 | 7.88 |
| 9/19/09 | 7.85 |
| 9/19/09 | 7.89 |
| 9/19/09 | 7.84 |
| 9/19/09 | 7.85 |
| 9/19/09 | 7.88 |
| 9/19/09 | 7.86 |
| 9/19/09 | 7.86 |
| 9/19/09 | 7.83 |
| 9/19/09 | 7.79 |
| 9/19/09 | 7.83 |
| 9/19/09 | 7.83 |
| 9/19/09 | 7.82 |
| 9/19/09 | 7.81 |
| 9/19/09 | 7.79 |
| 9/19/09 | 7.79 |
| 9/19/09 | 7.82 |
| 9/19/09 | 7.79 |
| 9/19/09 | 7.8 |
| 9/19/09 | 7.8 |
| 9/19/09 | 7.8 |
| 9/19/09 | 7.77 |
| 9/19/09 | 7.79 |
| 9/19/09 | 7.8 |
| 9/19/09 | 7.81 |
| 9/19/09 | 7.81 |
| 9/19/09 | 7.82 |
| 9/19/09 | 7.84 |
| 9/19/09 | 7.87 |
| 9/19/09 | 7.88 |
| 9/19/09 | 7.93 |
| 9/18/09 | 7.95 |
| 9/18/09 | 7.95 |
| 9/18/09 | 7.94 |
| 9/18/09 | 7.98 |
| 9/18/09 | 8.01 |
| 9/18/09 | 8.04 |
| 9/18/09 | 8.04 |
| 9/18/09 | 7.98 |
| 9/18/09 | 7.9 |
| 9/18/09 | 7.88 |
| 9/18/09 | 7.89 |
| 9/18/09 | 7.87 |
| 9/18/09 | 7.88 |
| 9/18/09 | 7.88 |
| 9/18/09 | 7.93 |
| 9/18/09 | 7.95 |
| 9/18/09 | 7.93 |
| 9/18/09 | 7.92 |
| 9/18/09 | 7.91 |
| 9/18/09 | 7.81 |
| 9/18/09 | 7.79 |
| 9/18/09 | 7.71 |
| 9/18/09 | 7.73 |
| 9/18/09 | 7.74 |
| 9/18/09 | 7.73 |
| 9/18/09 | 7.68 |
| 9/18/09 | 7.68 |
| 9/18/09 | 7.7 |
| 9/18/09 | 7.72 |
| 9/18/09 | 7.73 |
| 9/18/09 | 7.73 |
| 9/18/09 | 7.74 |
| 9/18/09 | 7.74 |
| 9/18/09 | 7.71 |
| 9/18/09 | 7.71 |
| 9/18/09 | 7.7 |
| 9/18/09 | 7.7 |
| 9/18/09 | 7.7 |
| 9/18/09 | 7.71 |
| 9/18/09 | 7.75 |
| 9/18/09 | 7.78 |
| 9/18/09 | 7.76 |
| 9/18/09 | 7.79 |
| 9/18/09 | 7.79 |
| 9/18/09 | 7.81 |
| 9/18/09 | 7.82 |
| 9/18/09 | 7.83 |
| 9/18/09 | 7.88 |
| 9/17/09 | 7.91 |
| 9/17/09 | 7.92 |
| 9/17/09 | 7.91 |
| 9/17/09 | 7.91 |
| 9/17/09 | 7.98 |
| 9/17/09 | 7.98 |
| 9/17/09 | 7.96 |
| 9/17/09 | 7.97 |
| 9/17/09 | 7.97 |
| 9/17/09 | 7.97 |
| 9/17/09 | 8.13 |
| 9/17/09 | 8.15 |
| 9/17/09 | 8.11 |
| 9/17/09 | 8.05 |
| 9/17/09 | 8.05 |
| 9/17/09 | 8.04 |
| 9/17/09 | 8.01 |
| 9/17/09 | 7.97 |
| 9/17/09 | 7.93 |
| 9/17/09 | 7.92 |
| 9/17/09 | 7.89 |
| 9/17/09 | 7.88 |
| 9/17/09 | 7.9 |
| 9/17/09 | 7.85 |
| 9/17/09 | 7.87 |
| 9/17/09 | 7.85 |
| 9/17/09 | 7.87 |
| 9/17/09 | 7.86 |
| 9/17/09 | 7.85 |
| 9/17/09 | 7.83 |
| 9/17/09 | 7.78 |
| 9/17/09 | 7.72 |
| 9/17/09 | 7.75 |
| 9/17/09 | 7.77 |
| 9/17/09 | 7.78 |
| 9/17/09 | 7.72 |
| 9/17/09 | 7.73 |
| 9/17/09 | 7.74 |
| 9/17/09 | 7.78 |
| 9/17/09 | 7.78 |
| 9/17/09 | 7.83 |
| 9/17/09 | 7.86 |
| 9/17/09 | 7.88 |
| 9/17/09 | 7.92 |
| 9/17/09 | 7.93 |
| 9/17/09 | 7.88 |
| 9/17/09 | 7.96 |
| 9/17/09 | 7.97 |
| 9/16/09 | 7.95 |
| 9/16/09 | 7.95 |
| 9/16/09 | 7.92 |
| 9/16/09 | 7.89 |
| 9/16/09 | 7.97 |
| 9/16/09 | 7.98 |
| 9/16/09 | 7.97 |
| 9/16/09 | 8.01 |
| 9/16/09 | 7.98 |
| 9/16/09 | 8.09 |
| 9/16/09 | 8.21 |
| 9/16/09 | 8.12 |
| 9/16/09 | 8.1 |
| 9/16/09 | 8.06 |
| 9/16/09 | 7.99 |
| 9/16/09 | 8.05 |
| 9/16/09 | 8.07 |
| 9/16/09 | 8.06 |
| 9/16/09 | 8.07 |
| 9/16/09 | 8.05 |
| 9/16/09 | 8.03 |
| 9/16/09 | 8.03 |
| 9/16/09 | 8.01 |
| 9/16/09 | 7.98 |
| 9/16/09 | 7.93 |
| 9/16/09 | 7.92 |
| 9/16/09 | 7.91 |
| 9/16/09 | 7.93 |
| 9/16/09 | 7.94 |
| 9/16/09 | 7.92 |
| 9/16/09 | 7.93 |
| 9/16/09 | 7.93 |
| 9/16/09 | 7.93 |
| 9/16/09 | 7.9 |
| 9/16/09 | 7.9 |
| 9/16/09 | 7.93 |
| 9/16/09 | 7.98 |
| 9/16/09 | 8.01 |
| 9/16/09 | 8.04 |
| 9/16/09 | 8.04 |
| 9/16/09 | 8.03 |
| 9/16/09 | 8.05 |
| 9/16/09 | 8.04 |
| 9/16/09 | 8.01 |
| 9/16/09 | 8.02 |
| 9/16/09 | 8.11 |
| 9/16/09 | 8.06 |
| 9/16/09 | 8.09 |
| 9/15/09 | 8.11 |
| 9/15/09 | 8.15 |
| 9/15/09 | 8.07 |
| 9/15/09 | 8.22 |
| 9/15/09 | 8.2 |
| 9/15/09 | 8.17 |
| 9/15/09 | 8.2 |
| 9/15/09 | 8.15 |
| 9/15/09 | 8.02 |
| 9/15/09 | 8.03 |
| 9/15/09 | 8.07 |
| 9/15/09 | 8.11 |
| 9/15/09 | 8.19 |
| 9/15/09 | 7.98 |
| 9/15/09 | 8.07 |
| 9/15/09 | 8.09 |
| 9/15/09 | 8.12 |
| 9/15/09 | 8.1 |
| 9/15/09 | 8.04 |
| 9/15/09 | 8.02 |
| 9/15/09 | 8.03 |
| 9/15/09 | 8.05 |
| 9/15/09 | 8.06 |
| 9/15/09 | 7.96 |
| 9/15/09 | 7.92 |
| 9/15/09 | 7.92 |
| 9/15/09 | 7.87 |
| 9/15/09 | 7.89 |
| 9/15/09 | 7.9 |
| 9/15/09 | 7.9 |
| 9/15/09 | 7.92 |
| 9/15/09 | 7.92 |
| 9/15/09 | 7.94 |
| 9/15/09 | 7.97 |
| 9/15/09 | 7.97 |
| 9/15/09 | 8.01 |
| 9/15/09 | 7.99 |
| 9/15/09 | 8.01 |
| 9/15/09 | 8 |
| 9/15/09 | 7.98 |
| 9/15/09 | 7.99 |
| 9/15/09 | 7.96 |
| 9/15/09 | 8.05 |
| 9/15/09 | 8.06 |
| 9/15/09 | 8.07 |
| 9/15/09 | 8.08 |
| 9/15/09 | 8.09 |
| 9/15/09 | 8.09 |
| 9/14/09 | 8.05 |
| 9/14/09 | 8.07 |
| 9/14/09 | 8.1 |
| 9/14/09 | 8.11 |
| 9/14/09 | 8.09 |
| 9/14/09 | 8.05 |
| 9/14/09 | 8.02 |
| 9/14/09 | 8.03 |
| 9/14/09 | 8.08 |
| 9/14/09 | 8.09 |
| 9/14/09 | 8.09 |
| 9/14/09 | 8.12 |
| 9/14/09 | 8.18 |
| 9/14/09 | 8.07 |
| 9/14/09 | 8.2 |
| 9/14/09 | 8.16 |
| 9/14/09 | 8.13 |
| 9/14/09 | 8.17 |
| 9/14/09 | 8 |
| 9/14/09 | 8.03 |
| 9/14/09 | 8.14 |
| 9/14/09 | 7.89 |
| 9/14/09 | 7.88 |
| 9/14/09 | 7.88 |
| 9/14/09 | 7.86 |
| 9/14/09 | 7.81 |
| 9/14/09 | 7.82 |
| 9/14/09 | 7.85 |
| 9/14/09 | 7.9 |
| 9/14/09 | 7.91 |
| 9/14/09 | 7.91 |
| 9/14/09 | 7.92 |
| 9/14/09 | 7.89 |
| 9/14/09 | 7.87 |
| 9/14/09 | 7.88 |
| 9/14/09 | 7.87 |
| 9/14/09 | 7.85 |
| 9/14/09 | 7.9 |
| 9/14/09 | 7.93 |
| 9/14/09 | 7.95 |
| 9/14/09 | 7.92 |
| 9/14/09 | 7.97 |
| 9/14/09 | 8.04 |
| 9/14/09 | 8.01 |
| 9/14/09 | 7.99 |
| 9/14/09 | 8.05 |
| 9/14/09 | 8.02 |
| 9/14/09 | 7.87 |
| 9/13/09 | 7.95 |
| 9/13/09 | 7.88 |
| 9/13/09 | 7.86 |
| 9/13/09 | 7.91 |
| 9/13/09 | 7.98 |
| 9/13/09 | 7.96 |
| 9/13/09 | 7.98 |
| 9/13/09 | 8.03 |
| 9/13/09 | 7.89 |
| 9/13/09 | 8.05 |
| 9/13/09 | 7.93 |
| 9/13/09 | 7.99 |
| 9/13/09 | 8 |
| 9/13/09 | 7.97 |
| 9/13/09 | 8.07 |
| 9/13/09 | 8.02 |
| 9/13/09 | 8 |
| 9/13/09 | 8.08 |
| 9/13/09 | 8.02 |
| 9/13/09 | 7.9 |
| 9/13/09 | 7.92 |
| 9/13/09 | 7.86 |
| 9/13/09 | 7.87 |
| 9/13/09 | 7.93 |
| 9/13/09 | 7.89 |
| 9/13/09 | 7.74 |
| 9/13/09 | 7.74 |
| 9/13/09 | 7.75 |
| 9/13/09 | 7.78 |
| 9/13/09 | 7.8 |
| 9/13/09 | 7.76 |
| 9/13/09 | 7.76 |
| 9/13/09 | 7.78 |
| 9/13/09 | 7.8 |
| 9/13/09 | 7.78 |
| 9/13/09 | 7.8 |
| 9/13/09 | 7.81 |
| 9/13/09 | 7.81 |
| 9/13/09 | 7.83 |
| 9/13/09 | 7.84 |
| 9/13/09 | 7.89 |
| 9/13/09 | 7.86 |
| 9/13/09 | 7.87 |
| 9/13/09 | 7.87 |
| 9/13/09 | 7.88 |
| 9/13/09 | 7.89 |
| 9/13/09 | 7.9 |
| 9/13/09 | 7.9 |
| 9/12/09 | 7.96 |
| 9/12/09 | 7.95 |
| 9/12/09 | 7.98 |
| 9/12/09 | 8 |
| 9/12/09 | 8.01 |
| 9/12/09 | 8.01 |
| 9/12/09 | 8.02 |
| 9/12/09 | 8.11 |
| 9/12/09 | 7.98 |
| 9/12/09 | 7.92 |
| 9/12/09 | 8.01 |
| 9/12/09 | 7.98 |
| 9/12/09 | 8.06 |
| 9/12/09 | 7.95 |
| 9/12/09 | 7.96 |
| 9/12/09 | 7.91 |
| 9/12/09 | 7.88 |
| 9/12/09 | 7.93 |
| 9/12/09 | 7.94 |
| 9/12/09 | 7.9 |
| 9/12/09 | 7.87 |
| 9/12/09 | 7.92 |
| 9/12/09 | 7.88 |
| 9/12/09 | 7.95 |
| 9/12/09 | 7.84 |
| 9/12/09 | 7.83 |
| 9/12/09 | 7.86 |
| 9/12/09 | 7.89 |
| 9/12/09 | 7.89 |
| 9/12/09 | 7.86 |
| 9/12/09 | 7.9 |
| 9/12/09 | 7.92 |
| 9/12/09 | 7.91 |
| 9/12/09 | 7.94 |
| 9/12/09 | 7.9 |
| 9/12/09 | 7.91 |
| 9/12/09 | 7.94 |
| 9/12/09 | 7.94 |
| 9/12/09 | 7.94 |
| 9/12/09 | 7.94 |
| 9/12/09 | 7.96 |
| 9/12/09 | 7.97 |
| 9/12/09 | 8.02 |
| 9/12/09 | 8.02 |
| 9/12/09 | 8.05 |
| 9/12/09 | 8.07 |
| 9/12/09 | 8.07 |
| 9/12/09 | 8.08 |
| 9/11/09 | 8.08 |
| 9/11/09 | 8.11 |
| 9/11/09 | 8.1 |
| 9/11/09 | 8.12 |
| 9/11/09 | 8.12 |
| 9/11/09 | 8.14 |
| 9/11/09 | 8.14 |
| 9/11/09 | 8.17 |
| 9/11/09 | 8.18 |
| 9/11/09 | 8.16 |
| 9/11/09 | 8.14 |
| 9/11/09 | 8.13 |
| 9/11/09 | 8.15 |
| 9/11/09 | 8.17 |
| 9/11/09 | 8.16 |
| 9/11/09 | 8.16 |
| 9/11/09 | 8.2 |
| 9/11/09 | 8.15 |
| 9/11/09 | 7.97 |
| 9/11/09 | 7.99 |
| 9/11/09 | 8.04 |
| 9/11/09 | 8.09 |
| 9/11/09 | 8.05 |
| 9/11/09 | 8.02 |
| 9/11/09 | 7.99 |
| 9/11/09 | 7.97 |
| 9/11/09 | 8.03 |
| 9/11/09 | 7.82 |
| 9/11/09 | 7.87 |
| 9/11/09 | 7.82 |
| 9/11/09 | 7.78 |
| 9/11/09 | 7.8 |
| 9/11/09 | 7.79 |
| 9/11/09 | 7.81 |
| 9/11/09 | 7.79 |
| 9/11/09 | 7.75 |
| 9/11/09 | 7.73 |
| 9/11/09 | 7.71 |
| 9/11/09 | 7.74 |
| 9/11/09 | 7.77 |
| 9/11/09 | 7.76 |
| 9/11/09 | 7.81 |
| 9/11/09 | 7.76 |
| 9/11/09 | 7.79 |
| 9/11/09 | 7.82 |
| 9/11/09 | 7.84 |
| 9/11/09 | 7.85 |
| 9/10/09 | 7.84 |
| 9/10/09 | 7.88 |
| 9/10/09 | 7.9 |
| 9/10/09 | 7.93 |
| 9/10/09 | 7.91 |
| 9/10/09 | 7.93 |
| 9/10/09 | 7.98 |
| 9/10/09 | 7.94 |
| 9/10/09 | 7.96 |
| 9/10/09 | 8 |
| 9/10/09 | 7.94 |
| 9/10/09 | 8.04 |
| 9/10/09 | 8.03 |
| 9/10/09 | 8.12 |
| 9/10/09 | 8.1 |
| 9/10/09 | 8.06 |
| 9/10/09 | 7.96 |
| 9/10/09 | 8.04 |
| 9/10/09 | 8.03 |
| 9/10/09 | 7.92 |
| 9/10/09 | 7.74 |
| 9/10/09 | 7.68 |
| 9/10/09 | 7.75 |
| 9/10/09 | 7.79 |
| 9/10/09 | 7.8 |
| 9/10/09 | 7.79 |
| 9/10/09 | 7.76 |
| 9/10/09 | 7.76 |
| 9/10/09 | 7.76 |
| 9/10/09 | 7.72 |
| 9/10/09 | 7.67 |
| 9/10/09 | 7.7 |
| 9/10/09 | 7.73 |
| 9/10/09 | 7.7 |
| 9/10/09 | 7.69 |
| 9/10/09 | 7.7 |
| 9/10/09 | 7.67 |
| 9/10/09 | 7.69 |
| 9/10/09 | 7.72 |
| 9/10/09 | 7.75 |
| 9/10/09 | 7.76 |
| 9/10/09 | 7.85 |
| 9/10/09 | 7.7 |
| 9/10/09 | 7.75 |
| 9/10/09 | 7.79 |
| 9/10/09 | 7.84 |
| 9/10/09 | 7.91 |
| 9/10/09 | 7.89 |
| 9/9/09 | 7.83 |
| 9/9/09 | 7.69 |
| 9/9/09 | 7.75 |
| 9/9/09 | 7.83 |
| 9/9/09 | 7.89 |
| 9/9/09 | 7.87 |
| 9/9/09 | 7.87 |
| 9/9/09 | 7.98 |
| 9/9/09 | 7.91 |
| 9/9/09 | 7.94 |
| 9/9/09 | 7.96 |
| 9/9/09 | 7.82 |
| 9/9/09 | 7.94 |
| 9/9/09 | 8.01 |
| 9/9/09 | 8.06 |
| 9/9/09 | 8.05 |
| 9/9/09 | 7.94 |
| 9/9/09 | 7.92 |
| 9/9/09 | 8.04 |
| 9/9/09 | 8.01 |
| 9/9/09 | 8.02 |
| 9/9/09 | 7.95 |
| 9/9/09 | 7.77 |
| 9/9/09 | 7.71 |
| 9/9/09 | 7.6 |
| 9/9/09 | 7.67 |
| 9/9/09 | 7.58 |
| 9/9/09 | 7.64 |
| 9/9/09 | 7.7 |
| 9/9/09 | 7.71 |
| 9/9/09 | 7.7 |
| 9/9/09 | 7.73 |
| 9/9/09 | 7.71 |
| 9/9/09 | 7.69 |
| 9/9/09 | 7.69 |
| 9/9/09 | 7.63 |
| 9/9/09 | 7.62 |
| 9/9/09 | 7.66 |
| 9/9/09 | 7.68 |
| 9/9/09 | 7.67 |
| 9/9/09 | 7.71 |
| 9/9/09 | 7.73 |
| 9/9/09 | 7.72 |
| 9/9/09 | 7.72 |
| 9/9/09 | 7.76 |
| 9/9/09 | 7.72 |
| 9/9/09 | 7.74 |
| 9/9/09 | 7.76 |
| 9/8/09 | 7.79 |
| 9/8/09 | 7.8 |
| 9/8/09 | 7.84 |
| 9/8/09 | 7.85 |
| 9/8/09 | 7.79 |
| 9/8/09 | 7.9 |
| 9/8/09 | 7.99 |
| 9/8/09 | 8.05 |
| 9/8/09 | 8.04 |
| 9/8/09 | 8.11 |
| 9/8/09 | 8.11 |
| 9/8/09 | 8.09 |
| 9/8/09 | 8.07 |
| 9/8/09 | 8.01 |
| 9/8/09 | 7.86 |
| 9/8/09 | 8.05 |
| 9/8/09 | 7.97 |
| 9/8/09 | 7.95 |
| 9/8/09 | 7.99 |
| 9/8/09 | 7.94 |
| 9/8/09 | 7.82 |
| 9/8/09 | 7.76 |
| 9/8/09 | 7.65 |
| 9/8/09 | 7.65 |
| 9/8/09 | 7.73 |
| 9/8/09 | 7.66 |
| 9/8/09 | 7.71 |
| 9/8/09 | 7.71 |
| 9/8/09 | 7.69 |
| 9/8/09 | 7.68 |
| 9/8/09 | 7.74 |
| 9/8/09 | 7.72 |
| 9/8/09 | 7.76 |
| 9/8/09 | 7.76 |
| 9/8/09 | 7.74 |
| 9/8/09 | 7.75 |
| 9/8/09 | 7.74 |
| 9/8/09 | 7.73 |
| 9/8/09 | 7.82 |
| 9/8/09 | 7.78 |
| 9/8/09 | 7.81 |
| 9/8/09 | 7.78 |
| 9/8/09 | 7.77 |
| 9/8/09 | 7.78 |
| 9/8/09 | 7.81 |
| 9/8/09 | 7.84 |
| 9/8/09 | 7.87 |
| 9/8/09 | 7.89 |
| 9/7/09 | 7.91 |
| 9/7/09 | 7.84 |
| 9/7/09 | 7.86 |
| 9/7/09 | 7.91 |
| 9/7/09 | 7.9 |
| 9/7/09 | 7.92 |
| 9/7/09 | 7.99 |
| 9/7/09 | 8.01 |
| 9/7/09 | 8.06 |
| 9/7/09 | 8.15 |
| 9/7/09 | 8.21 |
| 9/7/09 | 8.14 |
| 9/7/09 | 8.05 |
| 9/7/09 | 7.85 |
| 9/7/09 | 7.84 |
| 9/7/09 | 7.92 |
| 9/7/09 | 7.85 |
| 9/7/09 | 7.83 |
| 9/7/09 | 7.92 |
| 9/7/09 | 7.85 |
| 9/7/09 | 7.78 |
| 9/7/09 | 7.75 |
| 9/7/09 | 7.74 |
| 9/7/09 | 7.8 |
| 9/7/09 | 7.75 |
| 9/7/09 | 7.79 |
| 9/7/09 | 7.78 |
| 9/7/09 | 7.8 |
| 9/7/09 | 7.8 |
| 9/7/09 | 7.78 |
| 9/7/09 | 7.8 |
| 9/7/09 | 7.83 |
| 9/7/09 | 7.85 |
| 9/7/09 | 7.86 |
| 9/7/09 | 7.91 |
| 9/7/09 | 7.95 |
| 9/7/09 | 7.93 |
| 9/7/09 | 7.93 |
| 9/7/09 | 7.96 |
| 9/7/09 | 7.94 |
| 9/7/09 | 7.89 |
| 9/7/09 | 8 |
| 9/7/09 | 7.93 |
| 9/7/09 | 7.96 |
| 9/7/09 | 8.02 |
| 9/7/09 | 8.02 |
| 9/7/09 | 8.03 |
| 9/7/09 | 8.1 |
| 9/6/09 | 8.12 |
| 9/6/09 | 7.93 |
| 9/6/09 | 7.98 |
| 9/6/09 | 8.1 |
| 9/6/09 | 7.97 |
| 9/6/09 | 8.02 |
| 9/6/09 | 8.05 |
| 9/6/09 | 8.11 |
| 9/6/09 | 8.27 |
| 9/6/09 | 8.19 |
| 9/6/09 | 8.21 |
| 9/6/09 | 8.3 |
| 9/6/09 | 8.09 |
| 9/6/09 | 8.24 |
| 9/6/09 | 8.26 |
| 9/6/09 | 8.32 |
| 9/6/09 | 8.26 |
| 9/6/09 | 8.28 |
| 9/6/09 | 8.24 |
| 9/6/09 | 8.26 |
| 9/6/09 | 8.28 |
| 9/6/09 | 8.26 |
| 9/6/09 | 8.24 |
| 9/6/09 | 8.23 |
| 9/6/09 | 8.21 |
| 9/6/09 | 8.14 |
| 9/6/09 | 8.03 |
| 9/6/09 | 8.02 |
| 9/6/09 | 8.05 |
| 9/6/09 | 8.09 |
| 9/6/09 | 8.06 |
| 9/6/09 | 8.04 |
| 9/6/09 | 8.07 |
| 9/6/09 | 8.15 |
| 9/6/09 | 8.12 |
| 9/6/09 | 8.14 |
| 9/6/09 | 8.14 |
| 9/6/09 | 8.14 |
| 9/6/09 | 8.23 |
| 9/6/09 | 8.21 |
| 9/6/09 | 8.21 |
| 9/6/09 | 8.16 |
| 9/6/09 | 8.17 |
| 9/6/09 | 8.26 |
| 9/6/09 | 8.12 |
| 9/6/09 | 8.17 |
| 9/6/09 | 8.04 |
| 9/6/09 | 8.12 |
| 9/5/09 | 8.09 |
| 9/5/09 | 8.11 |
| 9/5/09 | 8.11 |
| 9/5/09 | 8.2 |
| 9/5/09 | 8.18 |
| 9/5/09 | 8.31 |
| 9/5/09 | 8.35 |
| 9/5/09 | 8.26 |
| 9/5/09 | 8.14 |
| 9/5/09 | 8.2 |
| 9/5/09 | 8.27 |
| 9/5/09 | 8.19 |
| 9/5/09 | 8.17 |
| 9/5/09 | 8.14 |
| 9/5/09 | 8.21 |
| 9/5/09 | 8.09 |
| 9/5/09 | 8.03 |
| 9/5/09 | 8.08 |
| 9/5/09 | 8.06 |
| 9/5/09 | 7.9 |
| 9/5/09 | 8 |
| 9/5/09 | 7.9 |
| 9/5/09 | 8.05 |
| 9/5/09 | 7.8 |
| 9/5/09 | 7.82 |
| 9/5/09 | 7.84 |
| 9/5/09 | 7.92 |
| 9/5/09 | 7.93 |
| 9/5/09 | 7.95 |
| 9/5/09 | 7.98 |
| 9/5/09 | 7.93 |
| 9/5/09 | 8 |
| 9/5/09 | 8.06 |
| 9/5/09 | 8.11 |
| 9/5/09 | 8.06 |
| 9/5/09 | 8.06 |
| 9/5/09 | 8.08 |
| 9/5/09 | 8.07 |
| 9/5/09 | 8.14 |
| 9/5/09 | 8.1 |
| 9/5/09 | 8.07 |
| 9/5/09 | 8.15 |
| 9/5/09 | 8.15 |
| 9/5/09 | 8.17 |
| 9/5/09 | 8.2 |
| 9/5/09 | 8.17 |
| 9/5/09 | 8.14 |
| 9/5/09 | 8.2 |
| 9/4/09 | 8.1 |
| 9/4/09 | 8.06 |
| 9/4/09 | 7.96 |
| 9/4/09 | 8.01 |
| 9/4/09 | 7.81 |
| 9/4/09 | 7.84 |
| 9/4/09 | 8.01 |
| 9/4/09 | 8.19 |
| 9/4/09 | 8.23 |
| 9/4/09 | 8.32 |
| 9/4/09 | 8.25 |
| 9/4/09 | 8.3 |
| 9/4/09 | 7.98 |
| 9/4/09 | 7.94 |
| 9/4/09 | 7.88 |
| 9/4/09 | 7.85 |
| 9/4/09 | 7.93 |
| 9/4/09 | 7.78 |
| 9/4/09 | 7.8 |
| 9/4/09 | 7.68 |
| 9/4/09 | 7.67 |
| 9/4/09 | 7.68 |
| 9/4/09 | 7.76 |
| 9/4/09 | 7.74 |
| 9/4/09 | 7.71 |
| 9/4/09 | 7.83 |
| 9/4/09 | 7.93 |
| 9/4/09 | 7.9 |
| 9/4/09 | 7.93 |
| 9/4/09 | 8.02 |
| 9/4/09 | 8.01 |
| 9/4/09 | 8.02 |
| 9/4/09 | 8.06 |
| 9/4/09 | 8.04 |
| 9/4/09 | 8.09 |
| 9/4/09 | 8.11 |
| 9/4/09 | 8.12 |
| 9/4/09 | 8.15 |
| 9/4/09 | 8.17 |
| 9/4/09 | 8.16 |
| 9/4/09 | 8.14 |
| 9/4/09 | 8.13 |
| 9/4/09 | 8.11 |
| 9/4/09 | 8.17 |
| 9/4/09 | 8.2 |
| 9/4/09 | 8.22 |
| 9/4/09 | 8.15 |
| 9/4/09 | 8.1 |
| 9/3/09 | 8.22 |
| 9/3/09 | 8.2 |
| 9/3/09 | 8.26 |
| 9/3/09 | 8.28 |
| 9/3/09 | 8.33 |
| 9/3/09 | 8.35 |
| 9/3/09 | 8.35 |
| 9/3/09 | 8.3 |
| 9/3/09 | 8.22 |
| 9/3/09 | 8.07 |
| 9/3/09 | 8.13 |
| 9/3/09 | 8.2 |
| 9/3/09 | 7.9 |
| 9/3/09 | 8.09 |
| 9/3/09 | 8.1 |
| 9/3/09 | 8 |
| 9/3/09 | 8.14 |
| 9/3/09 | 7.96 |
| 9/3/09 | 7.83 |
| 9/3/09 | 8.04 |
| 9/3/09 | 8.15 |
| 9/3/09 | 8.15 |
| 9/3/09 | 8.12 |
| 9/3/09 | 8.14 |
| 9/3/09 | 7.97 |
| 9/3/09 | 7.75 |
| 9/3/09 | 7.68 |
| 9/3/09 | 7.71 |
| 9/3/09 | 7.9 |
| 9/3/09 | 7.96 |
| 9/3/09 | 7.99 |
| 9/3/09 | 8.01 |
| 9/3/09 | 8.03 |
| 9/3/09 | 8.05 |
| 9/3/09 | 8.04 |
| 9/3/09 | 8.1 |
| 9/3/09 | 7.83 |
| 9/3/09 | 8.04 |
| 9/3/09 | 8.11 |
| 9/3/09 | 8.1 |
| 9/3/09 | 8.11 |
| 9/3/09 | 8.1 |
| 9/3/09 | 8.11 |
| 9/3/09 | 8.1 |
| 9/3/09 | 8.11 |
| 9/3/09 | 8.1 |
| 9/3/09 | 8.05 |
| 9/3/09 | 8.07 |
| 9/2/09 | 8.17 |
| 9/2/09 | 8.15 |
| 9/2/09 | 8.17 |
| 9/2/09 | 8.2 |
| 9/2/09 | 8.18 |
| 9/2/09 | 8.2 |
| 9/2/09 | 8.22 |
| 9/2/09 | 8.24 |
| 9/2/09 | 8.22 |
| 9/2/09 | 8.25 |
| 9/2/09 | 8.11 |
| 9/2/09 | 8.25 |
| 9/2/09 | 8.24 |
| 9/2/09 | 8.18 |
| 9/2/09 | 8.23 |
| 9/2/09 | 8.2 |
| 9/2/09 | 8.24 |
| 9/2/09 | 8.15 |
| 9/2/09 | 8.26 |
| 9/2/09 | 8.2 |
| 9/2/09 | 8.19 |
| 9/2/09 | 8.15 |
| 9/2/09 | 8.07 |
| 9/2/09 | 8.01 |
| 9/2/09 | 8 |
| 9/2/09 | 7.95 |
| 9/2/09 | 7.88 |
| 9/2/09 | 7.88 |
| 9/2/09 | 7.93 |
| 9/2/09 | 7.95 |
| 9/2/09 | 7.97 |
| 9/2/09 | 7.99 |
| 9/2/09 | 8 |
| 9/2/09 | 7.97 |
| 9/2/09 | 7.92 |
| 9/2/09 | 7.98 |
| 9/2/09 | 8 |
| 9/2/09 | 8.01 |
| 9/2/09 | 8.05 |
| 9/2/09 | 8.09 |
| 9/2/09 | 8.15 |
| 9/2/09 | 8.19 |
| 9/2/09 | 8.2 |
| 9/2/09 | 8.2 |
| 9/2/09 | 8.18 |
| 9/2/09 | 8.2 |
| 9/2/09 | 8.19 |
| 9/2/09 | 8.23 |
| 9/1/09 | 8.23 |
| 9/1/09 | 8.21 |
| 9/1/09 | 8.28 |
| 9/1/09 | 8.22 |
| 9/1/09 | 8.17 |
| 9/1/09 | 8.25 |
| 9/1/09 | 8.24 |
| 9/1/09 | 8.21 |
| 9/1/09 | 8.15 |
| 9/1/09 | 8.14 |
| 9/1/09 | 8.13 |
| 9/1/09 | 8.22 |
| 9/1/09 | 8.18 |
| 9/1/09 | 8.2 |
| 9/1/09 | 8.2 |
| 9/1/09 | 8.24 |
| 9/1/09 | 8.16 |
| 9/1/09 | 8.21 |
| 9/1/09 | 8.17 |
| 9/1/09 | 8.15 |
| 9/1/09 | 8.09 |
| 9/1/09 | 8.07 |
| 9/1/09 | 8.05 |
| 9/1/09 | 8 |
| 9/1/09 | 7.9 |
| 9/1/09 | 7.88 |
| 9/1/09 | 7.86 |
| 9/1/09 | 7.82 |
| 9/1/09 | 7.81 |
| 9/1/09 | 7.81 |
| 9/1/09 | 7.84 |
| 9/1/09 | 7.81 |
| 9/1/09 | 7.81 |
| 9/1/09 | 7.81 |
| 9/1/09 | 7.84 |
| 9/1/09 | 7.84 |
| 9/1/09 | 7.84 |
| 9/1/09 | 7.86 |
| 9/1/09 | 7.87 |
| 9/1/09 | 7.85 |
| 9/1/09 | 7.87 |
| 9/1/09 | 7.95 |
| 9/1/09 | 8.04 |
| 9/1/09 | 8.08 |
| 9/1/09 | 8.1 |
| 9/1/09 | 8.12 |
| 9/1/09 | 8.12 |
| 9/1/09 | 8.18 |
| 8/31/09 | 8.19 |
| 8/31/09 | 8.19 |
| 8/31/09 | 8.22 |
| 8/31/09 | 8.21 |
| 8/31/09 | 8.24 |
| 8/31/09 | 8.21 |
| 8/31/09 | 8.33 |
| 8/31/09 | 8.28 |
| 8/31/09 | 8.28 |
| 8/31/09 | 8.4 |
| 8/31/09 | 8.26 |
| 8/31/09 | 8.26 |
| 8/31/09 | 8.13 |
| 8/31/09 | 8.01 |
| 8/31/09 | 8.12 |
| 8/31/09 | 8.1 |
| 8/31/09 | 8.08 |
| 8/31/09 | 8.17 |
| 8/31/09 | 7.85 |
| 8/31/09 | 7.99 |
| 8/31/09 | 7.88 |
| 8/31/09 | 7.99 |
| 8/31/09 | 7.99 |
| 8/31/09 | 8.01 |
| 8/31/09 | 7.94 |
| 8/31/09 | 7.96 |
| 8/31/09 | 7.94 |
| 8/31/09 | 7.9 |
| 8/31/09 | 7.88 |
| 8/31/09 | 7.88 |
| 8/31/09 | 7.79 |
| 8/31/09 | 7.82 |
| 8/31/09 | 7.86 |
| 8/31/09 | 7.85 |
| 8/31/09 | 7.84 |
| 8/31/09 | 7.78 |
| 8/31/09 | 7.79 |
| 8/31/09 | 7.78 |
| 8/31/09 | 7.76 |
| 8/31/09 | 7.77 |
| 8/31/09 | 7.77 |
| 8/31/09 | 7.76 |
| 8/31/09 | 7.76 |
| 8/31/09 | 7.76 |
| 8/31/09 | 7.8 |
| 8/31/09 | 7.78 |
| 8/31/09 | 7.83 |
| 8/31/09 | 7.81 |
| 8/30/09 | 7.84 |
| 8/30/09 | 7.82 |
| 8/30/09 | 7.85 |
| 8/30/09 | 7.87 |
| 8/30/09 | 7.86 |
| 8/30/09 | 7.89 |
| 8/30/09 | 7.89 |
| 8/30/09 | 7.96 |
| 8/30/09 | 7.92 |
| 8/30/09 | 7.91 |
| 8/30/09 | 8.01 |
| 8/30/09 | 8 |
| 8/30/09 | 8.01 |
| 8/30/09 | 7.95 |
| 8/30/09 | 8.03 |
| 8/30/09 | 7.98 |
| 8/30/09 | 7.99 |
| 8/30/09 | 7.98 |
| 8/30/09 | 8 |
| 8/30/09 | 7.97 |
| 8/30/09 | 7.93 |
| 8/30/09 | 7.95 |
| 8/30/09 | 7.97 |
| 8/30/09 | 7.94 |
| 8/30/09 | 7.9 |
| 8/30/09 | 7.91 |
| 8/30/09 | 7.89 |
| 8/30/09 | 7.88 |
| 8/30/09 | 7.85 |
| 8/30/09 | 7.84 |
| 8/30/09 | 7.8 |
| 8/30/09 | 7.78 |
| 8/30/09 | 7.76 |
| 8/30/09 | 7.75 |
| 8/30/09 | 7.75 |
| 8/30/09 | 7.75 |
| 8/30/09 | 7.73 |
| 8/30/09 | 7.72 |
| 8/30/09 | 7.73 |
| 8/30/09 | 7.74 |
| 8/30/09 | 7.74 |
| 8/30/09 | 7.72 |
| 8/30/09 | 7.74 |
| 8/30/09 | 7.7 |
| 8/30/09 | 7.77 |
| 8/30/09 | 7.85 |
| 8/30/09 | 7.87 |
| 8/30/09 | 7.87 |
| 8/29/09 | 7.86 |
| 8/29/09 | 7.93 |
| 8/29/09 | 8 |
| 8/29/09 | 7.97 |
| 8/29/09 | 7.98 |
| 8/29/09 | 7.95 |
| 8/29/09 | 8.05 |
| 8/29/09 | 7.99 |
| 8/29/09 | 7.96 |
| 8/29/09 | 7.96 |
| 8/29/09 | 7.89 |
| 8/29/09 | 8.11 |
| 8/29/09 | 8.11 |
| 8/29/09 | 8.04 |
| 8/29/09 | 7.97 |
| 8/29/09 | 8.03 |
| 8/29/09 | 8.04 |
| 8/29/09 | 7.94 |
| 8/29/09 | 7.86 |
| 8/29/09 | 7.87 |
| 8/29/09 | 7.9 |
| 8/29/09 | 7.9 |
| 8/29/09 | 7.85 |
| 8/29/09 | 7.84 |
| 8/29/09 | 7.85 |
| 8/29/09 | 7.81 |
| 8/29/09 | 7.76 |
| 8/29/09 | 7.73 |
| 8/29/09 | 7.74 |
| 8/29/09 | 7.72 |
| 8/29/09 | 7.76 |
| 8/29/09 | 7.74 |
| 8/29/09 | 7.74 |
| 8/29/09 | 7.74 |
| 8/29/09 | 7.76 |
| 8/29/09 | 7.79 |
| 8/29/09 | 7.79 |
| 8/29/09 | 7.81 |
| 8/29/09 | 7.79 |
| 8/29/09 | 7.78 |
| 8/29/09 | 7.8 |
| 8/29/09 | 7.82 |
| 8/29/09 | 7.82 |
| 8/29/09 | 7.87 |
| 8/29/09 | 7.85 |
| 8/29/09 | 7.81 |
| 8/29/09 | 7.88 |
| 8/29/09 | 7.9 |
| 8/28/09 | 7.94 |
| 8/28/09 | 7.97 |
| 8/28/09 | 8.01 |
| 8/28/09 | 8.02 |
| 8/28/09 | 8.01 |
| 8/28/09 | 7.99 |
| 8/28/09 | 8.03 |
| 8/28/09 | 8.05 |
| 8/28/09 | 8.13 |
| 8/28/09 | 8.13 |
| 8/28/09 | 8.06 |
| 8/28/09 | 8.03 |
| 8/28/09 | 8.01 |
| 8/28/09 | 7.96 |
| 8/28/09 | 8 |
| 8/28/09 | 8.03 |
| 8/28/09 | 8.01 |
| 8/28/09 | 8 |
| 8/28/09 | 7.97 |
| 8/28/09 | 7.95 |
| 8/28/09 | 8.01 |
| 8/28/09 | 8.04 |
| 8/28/09 | 7.94 |
| 8/28/09 | 7.85 |
| 8/28/09 | 7.84 |
| 8/28/09 | 7.8 |
| 8/28/09 | 7.81 |
| 8/28/09 | 7.78 |
| 8/28/09 | 7.8 |
| 8/28/09 | 7.8 |
| 8/28/09 | 7.82 |
| 8/28/09 | 7.76 |
| 8/28/09 | 7.8 |
| 8/28/09 | 7.85 |
| 8/28/09 | 7.88 |
| 8/28/09 | 7.92 |
| 8/28/09 | 7.88 |
| 8/28/09 | 7.96 |
| 8/28/09 | 7.99 |
| 8/28/09 | 8.13 |
| 8/28/09 | 8.06 |
| 8/28/09 | 8.07 |
| 8/28/09 | 8.18 |
| 8/28/09 | 8.18 |
| 8/28/09 | 8.18 |
| 8/28/09 | 8.19 |
| 8/28/09 | 8.25 |
| 8/28/09 | 8.3 |
| 8/27/09 | 8.28 |
| 8/27/09 | 8.34 |
| 8/27/09 | 8.4 |
| 8/27/09 | 8.41 |
| 8/27/09 | 8.38 |
| 8/27/09 | 8.44 |
| 8/27/09 | 8.42 |
| 8/27/09 | 8.45 |
| 8/27/09 | 8.48 |
| 8/27/09 | 8.45 |
| 8/27/09 | 8.48 |
| 8/27/09 | 8.44 |
| 8/27/09 | 8.29 |
| 8/27/09 | 8.23 |
| 8/27/09 | 8.27 |
| 8/27/09 | 8.25 |
| 8/27/09 | 8.2 |
| 8/27/09 | 8.14 |
| 8/27/09 | 8.13 |
| 8/27/09 | 8.13 |
| 8/27/09 | 8.16 |
| 8/27/09 | 7.95 |
| 8/27/09 | 7.85 |
| 8/27/09 | 7.89 |
| 8/27/09 | 7.85 |
| 8/27/09 | 7.91 |
| 8/27/09 | 7.92 |
| 8/27/09 | 8.06 |
| 8/27/09 | 8.03 |
| 8/27/09 | 8.06 |
| 8/27/09 | 8.09 |
| 8/27/09 | 8.11 |
| 8/27/09 | 8.1 |
| 8/27/09 | 8.17 |
| 8/27/09 | 8.15 |
| 8/27/09 | 8.18 |
| 8/27/09 | 8.13 |
| 8/27/09 | 8.18 |
| 8/27/09 | 8.19 |
| 8/27/09 | 8.21 |
| 8/27/09 | 8.07 |
| 8/27/09 | 8.26 |
| 8/27/09 | 8.21 |
| 8/27/09 | 8.27 |
| 8/27/09 | 8.27 |
| 8/27/09 | 8.3 |
| 8/27/09 | 8.32 |
| 8/27/09 | 8.38 |
| 8/26/09 | 8.37 |
| 8/26/09 | 8.4 |
| 8/26/09 | 8.46 |
| 8/26/09 | 8.47 |
| 8/26/09 | 8.47 |
| 8/26/09 | 8.41 |
| 8/26/09 | 8.46 |
| 8/26/09 | 8.42 |
| 8/26/09 | 8.33 |
| 8/26/09 | 8.22 |
| 8/26/09 | 8.16 |
| 8/26/09 | 8.28 |
| 8/26/09 | 8.25 |
| 8/26/09 | 8.16 |
| 8/26/09 | 8.1 |
| 8/26/09 | 8.09 |
| 8/26/09 | 8.04 |
| 8/26/09 | 8.13 |
| 8/26/09 | 8.12 |
| 8/26/09 | 8.16 |
| 8/26/09 | 8.21 |
| 8/26/09 | 8.18 |
| 8/26/09 | 8.19 |
| 8/26/09 | 8.21 |
| 8/26/09 | 8.2 |
| 8/26/09 | 8 |
| 8/26/09 | 8.02 |
| 8/26/09 | 7.97 |
| 8/26/09 | 8.02 |
| 8/26/09 | 8.1 |
| 8/26/09 | 8.08 |
| 8/26/09 | 8.14 |
| 8/26/09 | 8.15 |
| 8/26/09 | 8.15 |
| 8/26/09 | 8.13 |
| 8/26/09 | 8.15 |
| 8/26/09 | 8.18 |
| 8/26/09 | 8.22 |
| 8/26/09 | 8.24 |
| 8/26/09 | 8.26 |
| 8/26/09 | 8.3 |
| 8/26/09 | 8.2 |
| 8/26/09 | 8.2 |
| 8/26/09 | 8.15 |
| 8/26/09 | 8.13 |
| 8/26/09 | 8.25 |
| 8/26/09 | 8.2 |
| 8/26/09 | 8.26 |
| 8/25/09 | 8.28 |
| 8/25/09 | 8.26 |
| 8/25/09 | 8.15 |
| 8/25/09 | 8.14 |
| 8/25/09 | 8.21 |
| 8/25/09 | 8.21 |
| 8/25/09 | 8.17 |
| 8/25/09 | 8.14 |
| 8/25/09 | 8.18 |
| 8/25/09 | 8.22 |
| 8/25/09 | 8.19 |
| 8/25/09 | 8.23 |
| 8/25/09 | 8.15 |
| 8/25/09 | 8.02 |
| 8/25/09 | 8.09 |
| 8/25/09 | 8.07 |
| 8/25/09 | 8.17 |
| 8/25/09 | 7.89 |
| 8/25/09 | 7.97 |
| 8/25/09 | 7.85 |
| 8/25/09 | 7.92 |
| 8/25/09 | 7.89 |
| 8/25/09 | 7.82 |
| 8/25/09 | 7.82 |
| 8/25/09 | 7.77 |
| 8/25/09 | 7.78 |
| 8/25/09 | 7.8 |
| 8/25/09 | 7.79 |
| 8/25/09 | 7.92 |
| 8/25/09 | 7.96 |
| 8/25/09 | 7.96 |
| 8/25/09 | 7.99 |
| 8/25/09 | 7.98 |
| 8/25/09 | 7.96 |
| 8/25/09 | 8 |
| 8/25/09 | 8.04 |
| 8/25/09 | 8.08 |
| 8/25/09 | 8.09 |
| 8/25/09 | 8.12 |
| 8/25/09 | 8.12 |
| 8/25/09 | 8.14 |
| 8/25/09 | 8.16 |
| 8/25/09 | 8.13 |
| 8/25/09 | 8.21 |
| 8/25/09 | 8.24 |
| 8/25/09 | 8.2 |
| 8/25/09 | 8.19 |
| 8/25/09 | 8.26 |
| 8/24/09 | 8.25 |
| 8/24/09 | 8.2 |
| 8/24/09 | 8.21 |
| 8/24/09 | 8.25 |
| 8/24/09 | 8.24 |
| 8/24/09 | 8.22 |
| 8/24/09 | 8.22 |
| 8/24/09 | 8.18 |
| 8/24/09 | 8.1 |
| 8/24/09 | 8.01 |
| 8/24/09 | 8.12 |
| 8/24/09 | 8.01 |
| 8/24/09 | 8.02 |
| 8/24/09 | 7.98 |
| 8/24/09 | 8.05 |
| 8/24/09 | 8.06 |
| 8/24/09 | 8.03 |
| 8/24/09 | 7.94 |
| 8/24/09 | 7.95 |
| 8/24/09 | 7.92 |
| 8/24/09 | 7.83 |
| 8/24/09 | 7.89 |
| 8/24/09 | 7.97 |
| 8/24/09 | 7.96 |
| 8/24/09 | 7.92 |
| 8/24/09 | 7.85 |
| 8/24/09 | 7.83 |
| 8/24/09 | 7.82 |
| 8/24/09 | 7.84 |
| 8/24/09 | 7.84 |
| 8/24/09 | 7.84 |
| 8/24/09 | 7.83 |
| 8/24/09 | 7.84 |
| 8/24/09 | 7.84 |
| 8/24/09 | 7.85 |
| 8/24/09 | 7.88 |
| 8/24/09 | 7.91 |
| 8/24/09 | 7.92 |
| 8/24/09 | 7.93 |
| 8/24/09 | 7.92 |
| 8/24/09 | 7.95 |
| 8/24/09 | 7.97 |
| 8/24/09 | 7.99 |
| 8/24/09 | 8.01 |
| 8/24/09 | 8.02 |
| 8/24/09 | 8.02 |
| 8/24/09 | 8.07 |
| 8/24/09 | 8.08 |
| 8/23/09 | 8.14 |
| 8/23/09 | 8.16 |
| 8/23/09 | 8.16 |
| 8/23/09 | 8.18 |
| 8/23/09 | 8.19 |
| 8/23/09 | 8.23 |
| 8/23/09 | 8.25 |
| 8/23/09 | 8.26 |
| 8/23/09 | 8.26 |
| 8/23/09 | 8.23 |
| 8/23/09 | 8.24 |
| 8/23/09 | 8.17 |
| 8/23/09 | 8.15 |
| 8/23/09 | 8.11 |
| 8/23/09 | 8.02 |
| 8/23/09 | 7.99 |
| 8/23/09 | 7.99 |
| 8/23/09 | 7.99 |
| 8/23/09 | 8 |
| 8/23/09 | 8.01 |
| 8/23/09 | 7.99 |
| 8/23/09 | 7.86 |
| 8/23/09 | 7.87 |
| 8/23/09 | 7.84 |
| 8/23/09 | 7.84 |
| 8/23/09 | 7.93 |
| 8/23/09 | 7.91 |
| 8/23/09 | 7.91 |
| 8/23/09 | 7.87 |
| 8/23/09 | 7.83 |
| 8/23/09 | 7.85 |
| 8/23/09 | 7.87 |
| 8/23/09 | 7.89 |
| 8/23/09 | 7.91 |
| 8/23/09 | 7.92 |
| 8/23/09 | 7.91 |
| 8/23/09 | 7.87 |
| 8/23/09 | 7.91 |
| 8/23/09 | 7.92 |
| 8/23/09 | 7.93 |
| 8/23/09 | 7.99 |
| 8/23/09 | 8.05 |
| 8/23/09 | 8.06 |
| 8/23/09 | 8.11 |
| 8/23/09 | 8.14 |
| 8/23/09 | 8.19 |
| 8/23/09 | 8.24 |
| 8/23/09 | 8.25 |
| 8/22/09 | 8.14 |
| 8/22/09 | 8.21 |
| 8/22/09 | 8.27 |
| 8/22/09 | 8.26 |
| 8/22/09 | 8.24 |
| 8/22/09 | 8.25 |
| 8/22/09 | 8.15 |
| 8/22/09 | 8.2 |
| 8/22/09 | 8.23 |
| 8/22/09 | 8.2 |
| 8/22/09 | 7.98 |
| 8/22/09 | 8.01 |
| 8/22/09 | 7.99 |
| 8/22/09 | 8.09 |
| 8/22/09 | 8.1 |
| 8/22/09 | 8.04 |
| 8/22/09 | 7.92 |
| 8/22/09 | 7.91 |
| 8/22/09 | 7.83 |
| 8/22/09 | 7.9 |
| 8/22/09 | 7.88 |
| 8/22/09 | 7.89 |
| 8/22/09 | 7.87 |
| 8/22/09 | 7.82 |
| 8/22/09 | 7.79 |
| 8/22/09 | 7.76 |
| 8/22/09 | 7.78 |
| 8/22/09 | 7.78 |
| 8/22/09 | 7.8 |
| 8/22/09 | 7.81 |
| 8/22/09 | 7.84 |
| 8/22/09 | 7.86 |
| 8/22/09 | 7.87 |
| 8/22/09 | 7.88 |
| 8/22/09 | 7.9 |
| 8/22/09 | 7.91 |
| 8/22/09 | 7.91 |
| 8/22/09 | 7.92 |
| 8/22/09 | 7.92 |
| 8/22/09 | 8 |
| 8/22/09 | 8.06 |
| 8/22/09 | 8.05 |
| 8/22/09 | 8.04 |
| 8/22/09 | 8.05 |
| 8/22/09 | 8.1 |
| 8/22/09 | 8.14 |
| 8/22/09 | 8.15 |
| 8/22/09 | 8.18 |
| 8/21/09 | 8.17 |
| 8/21/09 | 8.2 |
| 8/21/09 | 8.19 |
| 8/21/09 | 8.11 |
| 8/21/09 | 8.27 |
| 8/21/09 | 8.13 |
| 8/21/09 | 8.06 |
| 8/21/09 | 8.14 |
| 8/21/09 | 8.09 |
| 8/21/09 | 8.1 |
| 8/21/09 | 8.16 |
| 8/21/09 | 7.93 |
| 8/21/09 | 8.05 |
| 8/21/09 | 8.12 |
| 8/21/09 | 8.15 |
| 8/21/09 | 8.13 |
| 8/21/09 | 8.07 |
| 8/21/09 | 8.02 |
| 8/21/09 | 8.01 |
| 8/21/09 | 7.94 |
| 8/21/09 | 8.02 |
| 8/21/09 | 7.9 |
| 8/21/09 | 7.87 |
| 8/21/09 | 7.83 |
| 8/21/09 | 7.88 |
| 8/21/09 | 7.79 |
| 8/21/09 | 7.86 |
| 8/21/09 | 7.83 |
| 8/21/09 | 7.87 |
| 8/21/09 | 7.9 |
| 8/21/09 | 7.9 |
| 8/21/09 | 7.89 |
| 8/21/09 | 7.9 |
| 8/21/09 | 7.92 |
| 8/21/09 | 7.94 |
| 8/21/09 | 7.97 |
| 8/21/09 | 7.88 |
| 8/21/09 | 7.96 |
| 8/21/09 | 7.96 |
| 8/21/09 | 8.02 |
| 8/21/09 | 8.01 |
| 8/21/09 | 8.01 |
| 8/21/09 | 8.03 |
| 8/21/09 | 8.07 |
| 8/21/09 | 8.04 |
| 8/21/09 | 8.08 |
| 8/21/09 | 8.02 |
| 8/21/09 | 7.9 |
| 8/20/09 | 7.91 |
| 8/20/09 | 7.93 |
| 8/20/09 | 7.82 |
| 8/20/09 | 7.84 |
| 8/20/09 | 8.05 |
| 8/20/09 | 7.99 |
| 8/20/09 | 7.98 |
| 8/20/09 | 8.08 |
| 8/20/09 | 8.05 |
| 8/20/09 | 8.01 |
| 8/20/09 | 7.96 |
| 8/20/09 | 7.9 |
| 8/20/09 | 8.11 |
| 8/20/09 | 7.8 |
| 8/20/09 | 7.98 |
| 8/20/09 | 7.88 |
| 8/20/09 | 7.94 |
| 8/20/09 | 7.91 |
| 8/20/09 | 7.95 |
| 8/20/09 | 7.91 |
| 8/20/09 | 7.89 |
| 8/20/09 | 7.78 |
| 8/20/09 | 7.79 |
| 8/20/09 | 7.75 |
| 8/20/09 | 7.79 |
| 8/20/09 | 7.85 |
| 8/20/09 | 7.84 |
| 8/20/09 | 7.8 |
| 8/20/09 | 7.79 |
| 8/20/09 | 7.75 |
| 8/20/09 | 7.73 |
| 8/20/09 | 7.75 |
| 8/20/09 | 7.75 |
| 8/20/09 | 7.76 |
| 8/20/09 | 7.77 |
| 8/20/09 | 7.76 |
| 8/20/09 | 7.75 |
| 8/20/09 | 7.78 |
| 8/20/09 | 7.79 |
| 8/20/09 | 7.91 |
| 8/20/09 | 7.97 |
| 8/20/09 | 8.01 |
| 8/20/09 | 8.02 |
| 8/20/09 | 8.06 |
| 8/20/09 | 8.03 |
| 8/20/09 | 8.04 |
| 8/20/09 | 8.04 |
| 8/20/09 | 8.1 |
| 8/19/09 | 8.1 |
| 8/19/09 | 8.15 |
| 8/19/09 | 8.19 |
| 8/19/09 | 8.23 |
| 8/19/09 | 8.21 |
| 8/19/09 | 8.23 |
| 8/19/09 | 8.25 |
| 8/19/09 | 8.3 |
| 8/19/09 | 8.26 |
| 8/19/09 | 8.19 |
| 8/19/09 | 8.15 |
| 8/19/09 | 8.1 |
| 8/19/09 | 8.06 |
| 8/19/09 | 8.05 |
| 8/19/09 | 8.03 |
| 8/19/09 | 8.04 |
| 8/19/09 | 8.09 |
| 8/19/09 | 8.02 |
| 8/19/09 | 8.12 |
| 8/19/09 | 8.04 |
| 8/19/09 | 8.05 |
| 8/19/09 | 8.03 |
| 8/19/09 | 8.06 |
| 8/19/09 | 8.08 |
| 8/19/09 | 8.03 |
| 8/19/09 | 8 |
| 8/19/09 | 8.02 |
| 8/19/09 | 8.06 |
| 8/19/09 | 8.09 |
| 8/19/09 | 8.04 |
| 8/19/09 | 8.06 |
| 8/19/09 | 8.03 |
| 8/19/09 | 8.04 |
| 8/19/09 | 8.04 |
| 8/19/09 | 8.02 |
| 8/19/09 | 8.04 |
| 8/19/09 | 8.04 |
| 8/19/09 | 8.06 |
| 8/19/09 | 8.08 |
| 8/19/09 | 8.06 |
| 8/19/09 | 8.11 |
| 8/19/09 | 8.14 |
| 8/19/09 | 8.19 |
| 8/19/09 | 8.11 |
| 8/19/09 | 8.14 |
| 8/19/09 | 8.13 |
| 8/19/09 | 8.16 |
| 8/19/09 | 8.19 |
| 8/18/09 | 8.18 |
| 8/18/09 | 8.2 |
| 8/18/09 | 8.16 |
| 8/18/09 | 8.22 |
| 8/18/09 | 8.35 |
| 8/18/09 | 8.42 |
| 8/18/09 | 8.25 |
| 8/18/09 | 8.19 |
| 8/18/09 | 8.23 |
| 8/18/09 | 8.24 |
| 8/18/09 | 8.21 |
| 8/18/09 | 8.3 |
| 8/18/09 | 8.28 |
| 8/18/09 | 8.15 |
| 8/18/09 | 8.15 |
| 8/18/09 | 8.19 |
| 8/18/09 | 8.23 |
| 8/18/09 | 8.17 |
| 8/18/09 | 8.31 |
| 8/18/09 | 8.32 |
| 8/18/09 | 8.26 |
| 8/18/09 | 8.27 |
| 8/18/09 | 8.19 |
| 8/18/09 | 8.17 |
| 8/18/09 | 8.18 |
| 8/18/09 | 8.19 |
| 8/18/09 | 8.08 |
| 8/18/09 | 8.05 |
| 8/18/09 | 8.09 |
| 8/18/09 | 8.1 |
| 8/18/09 | 8.17 |
| 8/18/09 | 8.13 |
| 8/18/09 | 8.07 |
| 8/18/09 | 8.14 |
| 8/18/09 | 8.05 |
| 8/18/09 | 8.03 |
| 8/18/09 | 8.09 |
| 8/18/09 | 8.12 |
| 8/18/09 | 8.13 |
| 8/18/09 | 8.15 |
| 8/18/09 | 8.18 |
| 8/18/09 | 8.25 |
| 8/18/09 | 8.18 |
| 8/18/09 | 8.25 |
| 8/18/09 | 8.17 |
| 8/18/09 | 8.18 |
| 8/18/09 | 8.1 |
| 8/18/09 | 8.13 |
| 8/17/09 | 8.18 |
| 8/17/09 | 8.24 |
| 8/17/09 | 8.24 |
| 8/17/09 | 8.23 |
| 8/17/09 | 8.19 |
| 8/17/09 | 8.19 |
| 8/17/09 | 8.31 |
| 8/17/09 | 8.29 |
| 8/17/09 | 8.32 |
| 8/17/09 | 8.32 |
| 8/17/09 | 8.41 |
| 8/17/09 | 8.24 |
| 8/17/09 | 8.17 |
| 8/17/09 | 8.15 |
| 8/17/09 | 8.14 |
| 8/17/09 | 8.11 |
| 8/17/09 | 8.06 |
| 8/17/09 | 8.07 |
| 8/17/09 | 8.08 |
| 8/17/09 | 8.09 |
| 8/17/09 | 8.16 |
| 8/17/09 | 8.06 |
| 8/17/09 | 8.17 |
| 8/17/09 | 8.13 |
| 8/17/09 | 8.09 |
| 8/17/09 | 8.1 |
| 8/17/09 | 8.1 |
| 8/17/09 | 8.1 |
| 8/17/09 | 8.09 |
| 8/17/09 | 8.13 |
| 8/17/09 | 8.14 |
| 8/17/09 | 8.14 |
| 8/17/09 | 8.15 |
| 8/17/09 | 8.19 |
| 8/17/09 | 8.2 |
| 8/17/09 | 8.19 |
| 8/17/09 | 8.17 |
| 8/17/09 | 8.16 |
| 8/17/09 | 8.2 |
| 8/17/09 | 8.21 |
| 8/17/09 | 8.19 |
| 8/17/09 | 8.06 |
| 8/17/09 | 8.12 |
| 8/17/09 | 8.18 |
| 8/17/09 | 8.24 |
| 8/17/09 | 8.25 |
| 8/17/09 | 8.17 |
| 8/17/09 | 8.17 |
| 8/16/09 | 8.17 |
| 8/16/09 | 8.22 |
| 8/16/09 | 8.13 |
| 8/16/09 | 8.17 |
| 8/16/09 | 8.2 |
| 8/16/09 | 8.32 |
| 8/16/09 | 8.38 |
| 8/16/09 | 8.36 |
| 8/16/09 | 8.34 |
| 8/16/09 | 8.38 |
| 8/16/09 | 8.19 |
| 8/16/09 | 8.22 |
| 8/16/09 | 8.25 |
| 8/16/09 | 8.23 |
| 8/16/09 | 8.38 |
| 8/16/09 | 8.12 |
| 8/16/09 | 8.12 |
| 8/16/09 | 8.13 |
| 8/16/09 | 8.14 |
| 8/16/09 | 8.21 |
| 8/16/09 | 8.09 |
| 8/16/09 | 8.07 |
| 8/16/09 | 8.13 |
| 8/16/09 | 8.08 |
| 8/16/09 | 8.07 |
| 8/16/09 | 8.04 |
| 8/16/09 | 8.06 |
| 8/16/09 | 8.06 |
| 8/16/09 | 8.11 |
| 8/16/09 | 8.17 |
| 8/16/09 | 8.15 |
| 8/16/09 | 8.16 |
| 8/16/09 | 8.18 |
| 8/16/09 | 8.17 |
| 8/16/09 | 8.21 |
| 8/16/09 | 8.24 |
| 8/16/09 | 8.24 |
| 8/16/09 | 8.25 |
| 8/16/09 | 8.27 |
| 8/16/09 | 8.27 |
| 8/16/09 | 8.12 |
| 8/16/09 | 8.16 |
| 8/16/09 | 8.23 |
| 8/16/09 | 8.16 |
| 8/16/09 | 8.08 |
| 8/16/09 | 8.13 |
| 8/16/09 | 8.16 |
| 8/16/09 | 8.17 |
| 8/15/09 | 8.19 |
| 8/15/09 | 8.24 |
| 8/15/09 | 8.3 |
| 8/15/09 | 8.2 |
| 8/15/09 | 8.13 |
| 8/15/09 | 8.31 |
| 8/15/09 | 8.24 |
| 8/15/09 | 8.24 |
| 8/15/09 | 8.24 |
| 8/15/09 | 8.33 |
| 8/15/09 | 8.26 |
| 8/15/09 | 8.23 |
| 8/15/09 | 8.21 |
| 8/15/09 | 8.17 |
| 8/15/09 | 8.18 |
| 8/15/09 | 8.11 |
| 8/15/09 | 8.07 |
| 8/15/09 | 8.1 |
| 8/15/09 | 8.09 |
| 8/15/09 | 8.18 |
| 8/15/09 | 8.18 |
| 8/15/09 | 8.14 |
| 8/15/09 | 8.17 |
| 8/15/09 | 8.14 |
| 8/15/09 | 8.15 |
| 8/15/09 | 8.16 |
| 8/15/09 | 8.11 |
| 8/15/09 | 8.11 |
| 8/15/09 | 8.14 |
| 8/15/09 | 8.11 |
| 8/15/09 | 8.22 |
| 8/15/09 | 8.27 |
| 8/15/09 | 8.27 |
| 8/15/09 | 8.3 |
| 8/15/09 | 8.3 |
| 8/15/09 | 8.29 |
| 8/15/09 | 8.27 |
| 8/15/09 | 8.31 |
| 8/15/09 | 8.34 |
| 8/15/09 | 8.35 |
| 8/15/09 | 8.25 |
| 8/15/09 | 8.3 |
| 8/15/09 | 8.13 |
| 8/15/09 | 8.14 |
| 8/15/09 | 8.25 |
| 8/15/09 | 8.24 |
| 8/15/09 | 8.2 |
| 8/15/09 | 8.26 |
| 8/14/09 | 8.33 |
| 8/14/09 | 8.16 |
| 8/14/09 | 8.2 |
| 8/14/09 | 8.19 |
| 8/14/09 | 8.25 |
| 8/14/09 | 8.1 |
| 8/14/09 | 8.16 |
| 8/14/09 | 8.22 |
| 8/14/09 | 8.41 |
| 8/14/09 | 8.29 |
| 8/14/09 | 8.29 |
| 8/14/09 | 8.22 |
| 8/14/09 | 8.18 |
| 8/14/09 | 8.09 |
| 8/14/09 | 8.01 |
| 8/14/09 | 8.17 |
| 8/14/09 | 8.25 |
| 8/14/09 | 8.27 |
| 8/14/09 | 8.04 |
| 8/14/09 | 8.1 |
| 8/14/09 | 8.09 |
| 8/14/09 | 8.15 |
| 8/14/09 | 8.1 |
| 8/14/09 | 8.1 |
| 8/14/09 | 8.26 |
| 8/14/09 | 8.09 |
| 8/14/09 | 8.08 |
| 8/14/09 | 8.17 |
| 8/14/09 | 8.1 |
| 8/14/09 | 8.14 |
| 8/14/09 | 8.18 |
| 8/14/09 | 8.24 |
| 8/14/09 | 8.2 |
| 8/14/09 | 8.19 |
| 8/14/09 | 8.21 |
| 8/14/09 | 8.22 |
| 8/14/09 | 8.22 |
| 8/14/09 | 8.24 |
| 8/14/09 | 8.27 |
| 8/14/09 | 8.25 |
| 8/14/09 | 8.25 |
| 8/14/09 | 8.11 |
| 8/14/09 | 8 |
| 8/14/09 | 8.1 |
| 8/14/09 | 8.05 |
| 8/14/09 | 8.12 |
| 8/14/09 | 8.2 |
| 8/14/09 | 8.17 |
| 8/13/09 | 8.09 |
| 8/13/09 | 8.14 |
| 8/13/09 | 8.1 |
| 8/13/09 | 8.14 |
| 8/13/09 | 8.16 |
| 8/13/09 | 8.27 |
| 8/13/09 | 8.21 |
| 8/13/09 | 8.09 |
| 8/13/09 | 8.31 |
| 8/13/09 | 8.31 |
| 8/13/09 | 8.3 |
| 8/13/09 | 8.29 |
| 8/13/09 | 8.28 |
| 8/13/09 | 8.21 |
| 8/13/09 | 7.94 |
| 8/13/09 | 7.94 |
| 8/13/09 | 7.96 |
| 8/13/09 | 7.98 |
| 8/13/09 | 7.99 |
| 8/13/09 | 7.97 |
| 8/13/09 | 8.03 |
| 8/13/09 | 8.07 |
| 8/13/09 | 8.16 |
| 8/13/09 | 8.08 |
| 8/13/09 | 8.02 |
| 8/13/09 | 7.96 |
| 8/13/09 | 7.88 |
| 8/13/09 | 7.83 |
| 8/13/09 | 7.85 |
| 8/13/09 | 7.85 |
| 8/13/09 | 7.86 |
| 8/13/09 | 7.88 |
| 8/13/09 | 7.89 |
| 8/13/09 | 7.92 |
| 8/13/09 | 7.94 |
| 8/13/09 | 8 |
| 8/13/09 | 8.02 |
| 8/13/09 | 8.06 |
| 8/13/09 | 8.09 |
| 8/13/09 | 8.14 |
| 8/13/09 | 8.15 |
| 8/13/09 | 8.21 |
| 8/13/09 | 8.2 |
| 8/13/09 | 8.23 |
| 8/13/09 | 8.25 |
| 8/13/09 | 8.29 |
| 8/13/09 | 8.31 |
| 8/13/09 | 8.31 |
| 8/12/09 | 8.29 |
| 8/12/09 | 8.31 |
| 8/12/09 | 8.29 |
| 8/12/09 | 8.18 |
| 8/12/09 | 8.25 |
| 8/12/09 | 8.18 |
| 8/12/09 | 8.26 |
| 8/12/09 | 8.33 |
| 8/12/09 | 8.33 |
| 8/12/09 | 8.28 |
| 8/12/09 | 8.19 |
| 8/12/09 | 8.11 |
| 8/12/09 | 8.02 |
| 8/12/09 | 8.03 |
| 8/12/09 | 8.07 |
| 8/12/09 | 8.21 |
| 8/12/09 | 8.16 |
| 8/12/09 | 8.22 |
| 8/12/09 | 8.06 |
| 8/12/09 | 8.04 |
| 8/12/09 | 7.98 |
| 8/12/09 | 8.01 |
| 8/12/09 | 8.03 |
| 8/12/09 | 8.03 |
| 8/12/09 | 8.04 |
| 8/12/09 | 8.05 |
| 8/12/09 | 8.06 |
| 8/12/09 | 8.08 |
| 8/12/09 | 8.09 |
| 8/12/09 | 8.09 |
| 8/12/09 | 8.15 |
| 8/12/09 | 8.17 |
| 8/12/09 | 8.17 |
| 8/12/09 | 8.17 |
| 8/12/09 | 8.19 |
| 8/12/09 | 8.21 |
| 8/12/09 | 8.23 |
| 8/12/09 | 8.24 |
| 8/12/09 | 8.28 |
| 8/12/09 | 8.3 |
| 8/12/09 | 8.34 |
| 8/12/09 | 8.31 |
| 8/12/09 | 8.32 |
| 8/12/09 | 8.32 |
| 8/12/09 | 8.34 |
| 8/12/09 | 8.36 |
| 8/12/09 | 8.36 |
| 8/12/09 | 8.39 |
| 8/11/09 | 8.4 |
| 8/11/09 | 8.39 |
| 8/11/09 | 8.38 |
| 8/11/09 | 8.42 |
| 8/11/09 | 8.45 |
| 8/11/09 | 8.45 |
| 8/11/09 | 8.36 |
| 8/11/09 | 8.28 |
| 8/11/09 | 8.31 |
| 8/11/09 | 8.12 |
| 8/11/09 | 8.12 |
| 8/11/09 | 8.28 |
| 8/11/09 | 8.19 |
| 8/11/09 | 8.17 |
| 8/11/09 | 8.16 |
| 8/11/09 | 8.23 |
| 8/11/09 | 8.32 |
| 8/11/09 | 8.21 |
| 8/11/09 | 8.25 |
| 8/11/09 | 8.12 |
| 8/11/09 | 8.09 |
| 8/11/09 | 8.21 |
| 8/11/09 | 8.22 |
| 8/11/09 | 8.24 |
| 8/11/09 | 8.25 |
| 8/11/09 | 8.2 |
| 8/11/09 | 8.17 |
| 8/11/09 | 8.18 |
| 8/11/09 | 8.18 |
| 8/11/09 | 8.21 |
| 8/11/09 | 8.23 |
| 8/11/09 | 8.27 |
| 8/11/09 | 8.28 |
| 8/11/09 | 8.26 |
| 8/11/09 | 8.26 |
| 8/11/09 | 8.26 |
| 8/11/09 | 8.3 |
| 8/11/09 | 8.32 |
| 8/11/09 | 8.33 |
| 8/11/09 | 8.35 |
| 8/11/09 | 8.34 |
| 8/11/09 | 8.36 |
| 8/11/09 | 8.36 |
| 8/11/09 | 8.36 |
| 8/11/09 | 8.38 |
| 8/11/09 | 8.38 |
| 8/11/09 | 8.41 |
| 8/11/09 | 8.38 |
| 8/10/09 | 8.36 |
| 8/10/09 | 8.39 |
| 8/10/09 | 8.42 |
| 8/10/09 | 8.42 |
| 8/10/09 | 8.45 |
| 8/10/09 | 8.39 |
| 8/10/09 | 8.45 |
| 8/10/09 | 8.42 |
| 8/10/09 | 8.42 |
| 8/10/09 | 8.43 |
| 8/10/09 | 8.46 |
| 8/10/09 | 8.45 |
| 8/10/09 | 8.27 |
| 8/10/09 | 8.23 |
| 8/10/09 | 8.21 |
| 8/10/09 | 8.14 |
| 8/10/09 | 8.2 |
| 8/10/09 | 8.28 |
| 8/10/09 | 8.26 |
| 8/10/09 | 8.16 |
| 8/10/09 | 8.25 |
| 8/10/09 | 8.17 |
| 8/10/09 | 8.21 |
| 8/10/09 | 8.25 |
| 8/10/09 | 8.21 |
| 8/10/09 | 8.29 |
| 8/10/09 | 8.25 |
| 8/10/09 | 8.25 |
| 8/10/09 | 8.29 |
| 8/10/09 | 8.27 |
| 8/10/09 | 8.28 |
| 8/10/09 | 8.29 |
| 8/10/09 | 8.29 |
| 8/10/09 | 8.29 |
| 8/10/09 | 8.3 |
| 8/10/09 | 8.31 |
| 8/10/09 | 8.32 |
| 8/10/09 | 8.34 |
| 8/10/09 | 8.33 |
| 8/10/09 | 8.35 |
| 8/10/09 | 8.36 |
| 8/10/09 | 8.37 |
| 8/10/09 | 8.37 |
| 8/10/09 | 8.34 |
| 8/10/09 | 8.37 |
| 8/10/09 | 8.38 |
| 8/10/09 | 8.37 |
| 8/10/09 | 8.35 |
| 8/9/09 | 8.36 |
| 8/9/09 | 8.39 |
| 8/9/09 | 8.37 |
| 8/9/09 | 8.39 |
| 8/9/09 | 8.39 |
| 8/9/09 | 8.35 |
| 8/9/09 | 8.29 |
| 8/9/09 | 8.31 |
| 8/9/09 | 8.28 |
| 8/9/09 | 8.38 |
| 8/9/09 | 8.18 |
| 8/9/09 | 8.21 |
| 8/9/09 | 8.26 |
| 8/9/09 | 8.23 |
| 8/9/09 | 8.21 |
| 8/9/09 | 8.23 |
| 8/9/09 | 8.13 |
| 8/9/09 | 8.11 |
| 8/9/09 | 8.18 |
| 8/9/09 | 8.18 |
| 8/9/09 | 8.21 |
| 8/9/09 | 8.18 |
| 8/9/09 | 8.24 |
| 8/9/09 | 8.16 |
| 8/9/09 | 8 |
| 8/9/09 | 8.07 |
| 8/9/09 | 8.14 |
| 8/9/09 | 8.21 |
| 8/9/09 | 8.16 |
| 8/9/09 | 8.14 |
| 8/9/09 | 8.13 |
| 8/9/09 | 8.14 |
| 8/9/09 | 8.13 |
| 8/9/09 | 8.14 |
| 8/9/09 | 8.15 |
| 8/9/09 | 8.17 |
| 8/9/09 | 8.17 |
| 8/9/09 | 8.16 |
| 8/9/09 | 8.21 |
| 8/9/09 | 8.25 |
| 8/9/09 | 8.28 |
| 8/9/09 | 8.29 |
| 8/9/09 | 8.33 |
| 8/9/09 | 8.34 |
| 8/9/09 | 8.28 |
| 8/9/09 | 8.27 |
| 8/9/09 | 8.31 |
| 8/9/09 | 8.31 |
| 8/8/09 | 8.3 |
| 8/8/09 | 8.31 |
| 8/8/09 | 8.29 |
| 8/8/09 | 8.29 |
| 8/8/09 | 8.34 |
| 8/8/09 | 8.35 |
| 8/8/09 | 8.38 |
| 8/8/09 | 8.37 |
| 8/8/09 | 8.38 |
| 8/8/09 | 8.35 |
| 8/8/09 | 8.33 |
| 8/8/09 | 8.37 |
| 8/8/09 | 8.37 |
| 8/8/09 | 8.32 |
| 8/8/09 | 8.24 |
| 8/8/09 | 8.33 |
| 8/8/09 | 8.35 |
| 8/8/09 | 8.26 |
| 8/8/09 | 8.28 |
| 8/8/09 | 8.2 |
| 8/8/09 | 8.21 |
| 8/8/09 | 8.09 |
| 8/8/09 | 8.12 |
| 8/8/09 | 8.14 |
| 8/8/09 | 8.09 |
| 8/8/09 | 8.08 |
| 8/8/09 | 8.08 |
| 8/8/09 | 8.1 |
| 8/8/09 | 8.09 |
| 8/8/09 | 8.12 |
| 8/8/09 | 8.11 |
| 8/8/09 | 8.11 |
| 8/8/09 | 8.12 |
| 8/8/09 | 8.14 |
| 8/8/09 | 8.16 |
| 8/8/09 | 8.18 |
| 8/8/09 | 8.2 |
| 8/8/09 | 8.21 |
| 8/8/09 | 8.22 |
| 8/8/09 | 8.24 |
| 8/8/09 | 8.24 |
| 8/8/09 | 8.26 |
| 8/8/09 | 8.28 |
| 8/8/09 | 8.28 |
| 8/8/09 | 8.28 |
| 8/8/09 | 8.27 |
| 8/8/09 | 8.22 |
| 8/8/09 | 8.23 |
| 8/7/09 | 8.21 |
| 8/7/09 | 8.21 |
| 8/7/09 | 8.22 |
| 8/7/09 | 8.24 |
| 8/7/09 | 8.27 |
| 8/7/09 | 8.3 |
| 8/7/09 | 8.31 |
| 8/7/09 | 8.34 |
| 8/7/09 | 8.3 |
| 8/7/09 | 8.26 |
| 8/7/09 | 8.27 |
| 8/7/09 | 8.1 |
| 8/7/09 | 8.28 |
| 8/7/09 | 8.18 |
| 8/7/09 | 8.27 |
| 8/7/09 | 8.21 |
| 8/7/09 | 8.25 |
| 8/7/09 | 8.23 |
| 8/7/09 | 8.15 |
| 8/7/09 | 8.07 |
| 8/7/09 | 8.04 |
| 8/7/09 | 8.01 |
| 8/7/09 | 7.99 |
| 8/7/09 | 7.97 |
| 8/7/09 | 7.68 |
| 8/7/09 | 7.67 |
| 8/7/09 | 7.71 |
| 8/7/09 | 7.7 |
| 8/7/09 | 7.71 |
| 8/7/09 | 7.73 |
| 8/7/09 | 7.74 |
| 8/7/09 | 7.78 |
| 8/7/09 | 7.79 |
| 8/7/09 | 7.82 |
| 8/7/09 | 7.84 |
| 8/7/09 | 7.86 |
| 8/7/09 | 7.96 |
| 8/7/09 | 7.99 |
| 8/7/09 | 8.02 |
| 8/7/09 | 8.05 |
| 8/7/09 | 8.05 |
| 8/7/09 | 8.05 |
| 8/7/09 | 8.05 |
| 8/7/09 | 8.07 |
| 8/7/09 | 8.06 |
| 8/7/09 | 8.13 |
| 8/6/09 | 8.14 |
| 8/6/09 | 8.14 |
| 8/6/09 | 8.15 |
| 8/6/09 | 7.92 |
| 8/6/09 | 8.05 |
| 8/6/09 | 7.99 |
| 8/6/09 | 8.05 |
| 8/6/09 | 8.04 |
| 8/6/09 | 8.06 |
| 8/6/09 | 7.96 |
| 8/6/09 | 7.99 |
| 8/6/09 | 7.93 |
| 8/6/09 | 8 |
| 8/6/09 | 7.9 |
| 8/6/09 | 7.89 |
| 8/6/09 | 7.89 |
| 8/6/09 | 7.74 |
| 8/6/09 | 7.78 |
| 8/6/09 | 7.91 |
| 8/6/09 | 7.79 |
| 8/6/09 | 7.75 |
| 8/6/09 | 7.86 |
| 8/6/09 | 7.86 |
| 8/6/09 | 7.74 |
| 8/6/09 | 7.76 |
| 8/6/09 | 7.73 |
| 8/6/09 | 7.73 |
| 8/6/09 | 7.76 |
| 8/6/09 | 7.78 |
| 8/6/09 | 7.75 |
| 8/6/09 | 7.69 |
| 8/6/09 | 7.7 |
| 8/6/09 | 7.7 |
| 8/6/09 | 7.73 |
| 8/6/09 | 7.74 |
| 8/6/09 | 7.75 |
| 8/6/09 | 7.79 |
| 8/6/09 | 7.78 |
| 8/6/09 | 7.82 |
| 8/6/09 | 7.8 |
| 8/6/09 | 7.87 |
| 8/6/09 | 7.91 |
| 8/6/09 | 7.91 |
| 8/6/09 | 7.97 |
| 8/6/09 | 7.98 |
| 8/6/09 | 8.04 |
| 8/6/09 | 8.06 |
| 8/6/09 | 8.07 |
| 8/5/09 | 8.09 |
| 8/5/09 | 8.08 |
| 8/5/09 | 8.07 |
| 8/5/09 | 8.13 |
| 8/5/09 | 7.98 |
| 8/5/09 | 8.07 |
| 8/5/09 | 8.15 |
| 8/5/09 | 8.06 |
| 8/5/09 | 8 |
| 8/5/09 | 8 |
| 8/5/09 | 8.07 |
| 8/5/09 | 7.99 |
| 8/5/09 | 7.95 |
| 8/5/09 | 8.06 |
| 8/5/09 | 7.87 |
| 8/5/09 | 7.88 |
| 8/5/09 | 7.77 |
| 8/5/09 | 7.9 |
| 8/5/09 | 7.68 |
| 8/5/09 | 7.67 |
| 8/5/09 | 7.75 |
| 8/5/09 | 7.77 |
| 8/5/09 | 7.8 |
| 8/5/09 | 7.75 |
| 8/5/09 | 7.77 |
| 8/5/09 | 7.78 |
| 8/5/09 | 7.78 |
| 8/5/09 | 7.81 |
| 8/5/09 | 7.85 |
| 8/5/09 | 7.88 |
| 8/5/09 | 7.86 |
| 8/5/09 | 7.91 |
| 8/5/09 | 7.91 |
| 8/5/09 | 7.86 |
| 8/5/09 | 7.94 |
| 8/5/09 | 7.99 |
| 8/5/09 | 7.97 |
| 8/5/09 | 8 |
| 8/5/09 | 8 |
| 8/5/09 | 8.03 |
| 8/5/09 | 8.04 |
| 8/5/09 | 8.04 |
| 8/5/09 | 8.02 |
| 8/5/09 | 8.01 |
| 8/5/09 | 7.95 |
| 8/5/09 | 8.06 |
| 8/5/09 | 8.14 |
| 8/5/09 | 8.09 |
| 8/4/09 | 7.93 |
| 8/4/09 | 7.82 |
| 8/4/09 | 7.92 |
| 8/4/09 | 8 |
| 8/4/09 | 7.98 |
| 8/4/09 | 7.99 |
| 8/4/09 | 7.98 |
| 8/4/09 | 7.89 |
| 8/4/09 | 7.98 |
| 8/4/09 | 8.03 |
| 8/4/09 | 8.02 |
| 8/4/09 | 7.99 |
| 8/4/09 | 7.98 |
| 8/4/09 | 8 |
| 8/4/09 | 8.03 |
| 8/4/09 | 8.02 |
| 8/4/09 | 8.09 |
| 8/4/09 | 8.07 |
| 8/4/09 | 8.08 |
| 8/4/09 | 8.04 |
| 8/4/09 | 7.98 |
| 8/4/09 | 7.99 |
| 8/4/09 | 7.96 |
| 8/4/09 | 8.02 |
| 8/4/09 | 7.99 |
| 8/4/09 | 7.85 |
| 8/4/09 | 7.93 |
| 8/4/09 | 7.88 |
| 8/4/09 | 7.78 |
| 8/4/09 | 7.82 |
| 8/4/09 | 7.89 |
| 8/4/09 | 7.9 |
| 8/4/09 | 7.94 |
| 8/4/09 | 7.94 |
| 8/4/09 | 7.94 |
| 8/4/09 | 7.93 |
| 8/4/09 | 7.98 |
| 8/4/09 | 7.98 |
| 8/4/09 | 7.98 |
| 8/4/09 | 7.99 |
| 8/4/09 | 7.98 |
| 8/4/09 | 8.02 |
| 8/4/09 | 8.02 |
| 8/4/09 | 8.01 |
| 8/4/09 | 8.03 |
| 8/4/09 | 7.93 |
| 8/4/09 | 7.88 |
| 8/4/09 | 7.94 |
| 8/3/09 | 7.98 |
| 8/3/09 | 7.94 |
| 8/3/09 | 8.01 |
| 8/3/09 | 8.05 |
| 8/3/09 | 8.02 |
| 8/3/09 | 8.05 |
| 8/3/09 | 8.02 |
| 8/3/09 | 7.84 |
| 8/3/09 | 7.74 |
| 8/3/09 | 7.68 |
| 8/3/09 | 7.73 |
| 8/3/09 | 7.99 |
| 8/3/09 | 7.97 |
| 8/3/09 | 7.86 |
| 8/3/09 | 7.93 |
| 8/3/09 | 7.98 |
| 8/3/09 | 7.65 |
| 8/3/09 | 7.73 |
| 8/3/09 | 7.67 |
| 8/3/09 | 7.63 |
| 8/3/09 | 7.67 |
| 8/3/09 | 7.74 |
| 8/3/09 | 7.72 |
| 8/3/09 | 7.71 |
| 8/3/09 | 7.59 |
| 8/3/09 | 7.56 |
| 8/3/09 | 7.53 |
| 8/3/09 | 7.51 |
| 8/3/09 | 7.55 |
| 8/3/09 | 7.58 |
| 8/3/09 | 7.58 |
| 8/3/09 | 7.6 |
| 8/3/09 | 7.62 |
| 8/3/09 | 7.63 |
| 8/3/09 | 7.66 |
| 8/3/09 | 7.64 |
| 8/3/09 | 7.67 |
| 8/3/09 | 7.68 |
| 8/3/09 | 7.64 |
| 8/3/09 | 7.73 |
| 8/3/09 | 7.78 |
| 8/3/09 | 7.79 |
| 8/3/09 | 7.8 |
| 8/3/09 | 7.87 |
| 8/3/09 | 7.86 |
| 8/3/09 | 7.92 |
| 8/3/09 | 7.93 |
| 8/3/09 | 8.01 |
| 8/2/09 | 8.04 |
| 8/2/09 | 8.04 |
| 8/2/09 | 8.03 |
| 8/2/09 | 8.04 |
| 8/2/09 | 8.05 |
| 8/2/09 | 7.94 |
| 8/2/09 | 7.83 |
| 8/2/09 | 7.95 |
| 8/2/09 | 7.94 |
| 8/2/09 | 7.92 |
| 8/2/09 | 7.84 |
| 8/2/09 | 7.73 |
| 8/2/09 | 7.82 |
| 8/2/09 | 7.79 |
| 8/2/09 | 7.81 |
| 8/2/09 | 7.76 |
| 8/2/09 | 7.79 |
| 8/2/09 | 7.83 |
| 8/2/09 | 7.92 |
| 8/2/09 | 7.89 |
| 8/2/09 | 7.75 |
| 8/2/09 | 7.68 |
| 8/2/09 | 7.6 |
| 8/2/09 | 7.61 |
| 8/2/09 | 7.68 |
| 8/2/09 | 7.69 |
| 8/2/09 | 7.79 |
| 8/2/09 | 7.8 |
| 8/2/09 | 7.69 |
| 8/2/09 | 7.68 |
| 8/2/09 | 7.59 |
| 8/2/09 | 7.86 |
| 8/2/09 | 7.88 |
| 8/2/09 | 7.74 |
| 8/2/09 | 7.8 |
| 8/2/09 | 7.83 |
| 8/2/09 | 7.9 |
| 8/2/09 | 7.83 |
| 8/2/09 | 7.64 |
| 8/2/09 | 7.66 |
| 8/2/09 | 7.72 |
| 8/2/09 | 7.8 |
| 8/2/09 | 7.75 |
| 8/2/09 | 7.76 |
| 8/2/09 | 7.79 |
| 8/2/09 | 7.82 |
| 8/2/09 | 7.84 |
| 8/2/09 | 7.89 |
| 8/1/09 | 7.8 |
| 8/1/09 | 7.8 |
| 8/1/09 | 7.9 |
| 8/1/09 | 7.92 |
| 8/1/09 | 7.87 |
| 8/1/09 | 7.83 |
| 8/1/09 | 7.93 |
| 8/1/09 | 7.84 |
| 8/1/09 | 7.88 |
| 8/1/09 | 7.86 |
| 8/1/09 | 7.95 |
| 8/1/09 | 7.97 |
| 8/1/09 | 7.81 |
| 8/1/09 | 7.63 |
| 8/1/09 | 7.73 |
| 8/1/09 | 7.71 |
| 8/1/09 | 7.58 |
| 8/1/09 | 7.61 |
| 8/1/09 | 7.69 |
| 8/1/09 | 7.56 |
| 8/1/09 | 7.66 |
| 8/1/09 | 7.67 |
| 8/1/09 | 7.62 |
| 8/1/09 | 7.56 |
| 8/1/09 | 7.44 |
| 8/1/09 | 7.42 |
| 8/1/09 | 7.44 |
| 8/1/09 | 7.46 |
| 8/1/09 | 7.54 |
| 8/1/09 | 7.55 |
| 8/1/09 | 7.57 |
| 8/1/09 | 7.6 |
| 8/1/09 | 7.6 |
| 8/1/09 | 7.61 |
| 8/1/09 | 7.63 |
| 8/1/09 | 7.55 |
| 8/1/09 | 7.65 |
| 8/1/09 | 7.65 |
| 8/1/09 | 7.68 |
| 8/1/09 | 7.78 |
| 8/1/09 | 7.75 |
| 8/1/09 | 7.76 |
| 8/1/09 | 7.76 |
| 8/1/09 | 7.86 |
| 8/1/09 | 7.9 |
| 8/1/09 | 7.93 |
| 8/1/09 | 7.94 |
| 8/1/09 | 7.98 |
| 7/31/09 | 7.96 |
| 7/31/09 | 7.86 |
| 7/31/09 | 7.91 |
| 7/31/09 | 7.8 |
| 7/31/09 | 7.88 |
| 7/31/09 | 7.93 |
| 7/31/09 | 7.75 |
| 7/31/09 | 7.76 |
| 7/31/09 | 7.65 |
| 7/31/09 | 7.67 |
| 7/31/09 | 7.66 |
| 7/31/09 | 7.57 |
| 7/31/09 | 7.58 |
| 7/31/09 | 7.57 |
| 7/31/09 | 7.72 |
| 7/31/09 | 7.62 |
| 7/31/09 | 7.55 |
| 7/31/09 | 7.64 |
| 7/31/09 | 7.62 |
| 7/31/09 | 7.65 |
| 7/31/09 | 7.53 |
| 7/31/09 | 7.43 |
| 7/31/09 | 7.61 |
| 7/31/09 | 7.62 |
| 7/31/09 | 7.61 |
| 7/31/09 | 7.62 |
| 7/31/09 | 7.63 |
| 7/31/09 | 7.57 |
| 7/31/09 | 7.48 |
| 7/31/09 | 7.74 |
| 7/31/09 | 7.79 |
| 7/31/09 | 7.72 |
| 7/31/09 | 7.75 |
| 7/31/09 | 7.66 |
| 7/31/09 | 7.64 |
| 7/31/09 | 7.67 |
| 7/31/09 | 7.69 |
| 7/31/09 | 7.69 |
| 7/31/09 | 7.67 |
| 7/31/09 | 7.54 |
| 7/31/09 | 7.6 |
| 7/31/09 | 7.6 |
| 7/31/09 | 7.67 |
| 7/31/09 | 7.7 |
| 7/31/09 | 7.63 |
| 7/31/09 | 7.66 |
| 7/31/09 | 7.56 |
| 7/31/09 | 7.53 |
| 7/30/09 | 7.56 |
| 7/30/09 | 7.57 |
| 7/30/09 | 7.47 |
| 7/30/09 | 7.58 |
| 7/30/09 | 7.72 |
| 7/30/09 | 7.77 |
| 7/30/09 | 7.82 |
| 7/30/09 | 7.86 |
| 7/30/09 | 7.86 |
| 7/30/09 | 7.84 |
| 7/30/09 | 7.67 |
| 7/30/09 | 7.58 |
| 7/30/09 | 7.64 |
| 7/30/09 | 7.72 |
| 7/30/09 | 7.62 |
| 7/30/09 | 7.62 |
| 7/30/09 | 7.59 |
| 7/30/09 | 7.5 |
| 7/30/09 | 7.55 |
| 7/30/09 | 7.44 |
| 7/30/09 | 7.54 |
| 7/30/09 | 7.47 |
| 7/30/09 | 7.55 |
| 7/30/09 | 7.64 |
| 7/30/09 | 7.56 |
| 7/30/09 | 7.46 |
| 7/30/09 | 7.44 |
| 7/30/09 | 7.49 |
| 7/30/09 | 7.48 |
| 7/30/09 | 7.47 |
| 7/30/09 | 7.47 |
| 7/30/09 | 7.49 |
| 7/30/09 | 7.54 |
| 7/30/09 | 7.45 |
| 7/30/09 | 7.51 |
| 7/30/09 | 7.57 |
| 7/30/09 | 7.61 |
| 7/30/09 | 7.54 |
| 7/30/09 | 7.57 |
| 7/30/09 | 7.59 |
| 7/30/09 | 7.61 |
| 7/30/09 | 7.59 |
| 7/30/09 | 7.59 |
| 7/30/09 | 7.6 |
| 7/30/09 | 7.62 |
| 7/30/09 | 7.67 |
| 7/30/09 | 7.72 |
| 7/30/09 | 7.8 |
| 7/29/09 | 7.77 |
| 7/29/09 | 7.87 |
| 7/29/09 | 7.78 |
| 7/29/09 | 7.83 |
| 7/29/09 | 7.94 |
| 7/29/09 | 7.84 |
| 7/29/09 | 7.76 |
| 7/29/09 | 7.73 |
| 7/29/09 | 7.79 |
| 7/29/09 | 7.88 |
| 7/29/09 | 7.83 |
| 7/29/09 | 7.88 |
| 7/29/09 | 7.9 |
| 7/29/09 | 7.93 |
| 7/29/09 | 7.91 |
| 7/29/09 | 7.75 |
| 7/29/09 | 7.69 |
| 7/29/09 | 7.73 |
| 7/29/09 | 7.74 |
| 7/29/09 | 7.75 |
| 7/29/09 | 7.76 |
| 7/29/09 | 7.81 |
| 7/29/09 | 7.77 |
| 7/29/09 | 7.75 |
| 7/29/09 | 7.72 |
| 7/29/09 | 7.74 |
| 7/29/09 | 7.82 |
| 7/29/09 | 7.83 |
| 7/29/09 | 7.88 |
| 7/29/09 | 7.91 |
| 7/29/09 | 7.95 |
| 7/29/09 | 7.92 |
| 7/29/09 | 7.9 |
| 7/29/09 | 7.92 |
| 7/29/09 | 7.92 |
| 7/29/09 | 7.91 |
| 7/29/09 | 7.88 |
| 7/29/09 | 7.8 |
| 7/29/09 | 7.65 |
| 7/29/09 | 7.65 |
| 7/29/09 | 7.6 |
| 7/29/09 | 7.54 |
| 7/29/09 | 7.56 |
| 7/29/09 | 7.61 |
| 7/29/09 | 7.78 |
| 7/29/09 | 7.82 |
| 7/29/09 | 7.85 |
| 7/29/09 | 7.95 |
| 7/28/09 | 7.97 |
| 7/28/09 | 7.92 |
| 7/28/09 | 7.96 |
| 7/28/09 | 7.72 |
| 7/28/09 | 7.62 |
| 7/28/09 | 7.76 |
| 7/28/09 | 7.71 |
| 7/28/09 | 7.62 |
| 7/28/09 | 7.62 |
| 7/28/09 | 7.57 |
| 7/28/09 | 7.62 |
| 7/28/09 | 7.55 |
| 7/28/09 | 7.76 |
| 7/28/09 | 7.71 |
| 7/28/09 | 7.61 |
| 7/28/09 | 7.74 |
| 7/28/09 | 7.46 |
| 7/28/09 | 7.58 |
| 7/28/09 | 7.56 |
| 7/28/09 | 7.59 |
| 7/28/09 | 7.59 |
| 7/28/09 | 7.71 |
| 7/28/09 | 7.71 |
| 7/28/09 | 7.72 |
| 7/28/09 | 7.77 |
| 7/28/09 | 7.76 |
| 7/28/09 | 7.6 |
| 7/28/09 | 7.6 |
| 7/28/09 | 7.59 |
| 7/28/09 | 7.68 |
| 7/28/09 | 7.79 |
| 7/28/09 | 7.73 |
| 7/28/09 | 7.8 |
| 7/28/09 | 7.81 |
| 7/28/09 | 7.85 |
| 7/28/09 | 7.86 |
| 7/28/09 | 7.83 |
| 7/28/09 | 7.83 |
| 7/28/09 | 7.84 |
| 7/28/09 | 7.84 |
| 7/28/09 | 7.81 |
| 7/28/09 | 7.84 |
| 7/28/09 | 7.77 |
| 7/28/09 | 7.79 |
| 7/28/09 | 7.91 |
| 7/28/09 | 7.9 |
| 7/28/09 | 7.95 |
| 7/28/09 | 7.95 |
| 7/27/09 | 7.88 |
| 7/27/09 | 7.87 |
| 7/27/09 | 7.8 |
| 7/27/09 | 7.95 |
| 7/27/09 | 7.84 |
| 7/27/09 | 7.88 |
| 7/27/09 | 7.87 |
| 7/27/09 | 7.94 |
| 7/27/09 | 8.03 |
| 7/27/09 | 7.93 |
| 7/27/09 | 7.95 |
| 7/27/09 | 8.06 |
| 7/27/09 | 7.74 |
| 7/27/09 | 7.81 |
| 7/27/09 | 7.8 |
| 7/27/09 | 7.75 |
| 7/27/09 | 7.75 |
| 7/27/09 | 7.61 |
| 7/27/09 | 7.57 |
| 7/27/09 | 7.67 |
| 7/27/09 | 7.66 |
| 7/27/09 | 7.76 |
| 7/27/09 | 7.87 |
| 7/27/09 | 7.86 |
| 7/27/09 | 7.84 |
| 7/27/09 | 7.81 |
| 7/27/09 | 7.76 |
| 7/27/09 | 7.77 |
| 7/27/09 | 7.69 |
| 7/27/09 | 7.68 |
| 7/27/09 | 7.66 |
| 7/27/09 | 7.63 |
| 7/27/09 | 7.7 |
| 7/27/09 | 7.74 |
| 7/27/09 | 7.74 |
| 7/27/09 | 7.77 |
| 7/27/09 | 7.82 |
| 7/27/09 | 7.86 |
| 7/27/09 | 7.86 |
| 7/27/09 | 7.86 |
| 7/27/09 | 7.87 |
| 7/27/09 | 7.89 |
| 7/27/09 | 7.89 |
| 7/27/09 | 7.9 |
| 7/27/09 | 7.9 |
| 7/27/09 | 7.87 |
| 7/27/09 | 7.99 |
| 7/27/09 | 7.97 |
| 7/26/09 | 7.95 |
| 7/26/09 | 8.01 |
| 7/26/09 | 8.05 |
| 7/26/09 | 7.97 |
| 7/26/09 | 7.89 |
| 7/26/09 | 7.81 |
| 7/26/09 | 7.88 |
| 7/26/09 | 7.83 |
| 7/26/09 | 7.81 |
| 7/26/09 | 7.78 |
| 7/26/09 | 7.77 |
| 7/26/09 | 7.82 |
| 7/26/09 | 7.63 |
| 7/26/09 | 7.69 |
| 7/26/09 | 7.76 |
| 7/26/09 | 7.86 |
| 7/26/09 | 7.95 |
| 7/26/09 | 7.93 |
| 7/26/09 | 7.93 |
| 7/26/09 | 7.97 |
| 7/26/09 | 7.83 |
| 7/26/09 | 7.87 |
| 7/26/09 | 7.88 |
| 7/26/09 | 7.86 |
| 7/26/09 | 7.84 |
| 7/26/09 | 7.8 |
| 7/26/09 | 7.8 |
| 7/26/09 | 7.75 |
| 7/26/09 | 7.74 |
| 7/26/09 | 7.84 |
| 7/26/09 | 7.76 |
| 7/26/09 | 7.77 |
| 7/26/09 | 7.84 |
| 7/26/09 | 7.81 |
| 7/26/09 | 7.85 |
| 7/26/09 | 7.85 |
| 7/26/09 | 7.83 |
| 7/26/09 | 7.84 |
| 7/26/09 | 7.85 |
| 7/26/09 | 7.85 |
| 7/26/09 | 7.85 |
| 7/26/09 | 7.91 |
| 7/26/09 | 7.92 |
| 7/26/09 | 7.92 |
| 7/26/09 | 7.98 |
| 7/26/09 | 7.98 |
| 7/26/09 | 7.96 |
| 7/26/09 | 7.94 |
| 7/25/09 | 7.94 |
| 7/25/09 | 7.87 |
| 7/25/09 | 7.91 |
| 7/25/09 | 7.84 |
| 7/25/09 | 7.91 |
| 7/25/09 | 7.91 |
| 7/25/09 | 7.9 |
| 7/25/09 | 7.86 |
| 7/25/09 | 7.74 |
| 7/25/09 | 7.72 |
| 7/25/09 | 7.71 |
| 7/25/09 | 7.77 |
| 7/25/09 | 7.81 |
| 7/25/09 | 7.88 |
| 7/25/09 | 7.98 |
| 7/25/09 | 8.04 |
| 7/25/09 | 7.97 |
| 7/25/09 | 7.96 |
| 7/25/09 | 7.89 |
| 7/25/09 | 7.98 |
| 7/25/09 | 7.95 |
| 7/25/09 | 8.08 |
| 7/25/09 | 7.99 |
| 7/25/09 | 7.97 |
| 7/25/09 | 7.93 |
| 7/25/09 | 7.89 |
| 7/25/09 | 7.69 |
| 7/25/09 | 7.71 |
| 7/25/09 | 7.79 |
| 7/25/09 | 7.86 |
| 7/25/09 | 7.79 |
| 7/25/09 | 7.82 |
| 7/25/09 | 7.82 |
| 7/25/09 | 7.84 |
| 7/25/09 | 7.86 |
| 7/25/09 | 7.87 |
| 7/25/09 | 7.87 |
| 7/25/09 | 7.93 |
| 7/25/09 | 7.88 |
| 7/25/09 | 7.89 |
| 7/25/09 | 7.93 |
| 7/25/09 | 7.9 |
| 7/25/09 | 7.88 |
| 7/25/09 | 7.92 |
| 7/25/09 | 7.94 |
| 7/25/09 | 7.92 |
| 7/25/09 | 7.87 |
| 7/25/09 | 7.87 |
| 7/24/09 | 7.82 |
| 7/24/09 | 7.85 |
| 7/24/09 | 7.88 |
| 7/24/09 | 7.91 |
| 7/24/09 | 7.95 |
| 7/24/09 | 7.91 |
| 7/24/09 | 7.84 |
| 7/24/09 | 7.84 |
| 7/24/09 | 7.86 |
| 7/24/09 | 7.87 |
| 7/24/09 | 7.93 |
| 7/24/09 | 7.9 |
| 7/24/09 | 7.92 |
| 7/24/09 | 7.84 |
| 7/24/09 | 7.93 |
| 7/24/09 | 7.95 |
| 7/24/09 | 7.91 |
| 7/24/09 | 7.82 |
| 7/24/09 | 7.82 |
| 7/24/09 | 7.73 |
| 7/24/09 | 7.8 |
| 7/24/09 | 7.65 |
| 7/24/09 | 7.65 |
| 7/24/09 | 7.67 |
| 7/24/09 | 7.62 |
| 7/24/09 | 7.67 |
| 7/24/09 | 7.65 |
| 7/24/09 | 7.67 |
| 7/24/09 | 7.67 |
| 7/24/09 | 7.67 |
| 7/24/09 | 7.68 |
| 7/24/09 | 7.67 |
| 7/24/09 | 7.7 |
| 7/24/09 | 7.68 |
| 7/24/09 | 7.69 |
| 7/24/09 | 7.71 |
| 7/24/09 | 7.71 |
| 7/24/09 | 7.74 |
| 7/24/09 | 7.73 |
| 7/24/09 | 7.76 |
| 7/24/09 | 7.79 |
| 7/24/09 | 7.81 |
| 7/24/09 | 7.81 |
| 7/24/09 | 7.82 |
| 7/24/09 | 7.85 |
| 7/24/09 | 7.83 |
| 7/24/09 | 7.91 |
| 7/24/09 | 7.88 |
| 7/23/09 | 7.91 |
| 7/23/09 | 7.91 |
| 7/23/09 | 7.86 |
| 7/23/09 | 7.9 |
| 7/23/09 | 7.89 |
| 7/23/09 | 7.89 |
| 7/23/09 | 7.87 |
| 7/23/09 | 7.84 |
| 7/23/09 | 7.92 |
| 7/23/09 | 7.81 |
| 7/23/09 | 7.78 |
| 7/23/09 | 7.79 |
| 7/23/09 | 7.84 |
| 7/23/09 | 7.82 |
| 7/23/09 | 7.73 |
| 7/23/09 | 7.85 |
| 7/23/09 | 7.8 |
| 7/23/09 | 7.78 |
| 7/23/09 | 7.77 |
| 7/23/09 | 7.77 |
| 7/23/09 | 7.8 |
| 7/23/09 | 7.75 |
| 7/23/09 | 7.75 |
| 7/23/09 | 7.75 |
| 7/23/09 | 7.72 |
| 7/23/09 | 7.69 |
| 7/23/09 | 7.71 |
| 7/23/09 | 7.65 |
| 7/23/09 | 7.66 |
| 7/23/09 | 7.65 |
| 7/23/09 | 7.66 |
| 7/23/09 | 7.68 |
| 7/23/09 | 7.7 |
| 7/23/09 | 7.72 |
| 7/23/09 | 7.73 |
| 7/23/09 | 7.77 |
| 7/23/09 | 7.77 |
| 7/23/09 | 7.75 |
| 7/23/09 | 7.81 |
| 7/23/09 | 7.65 |
| 7/23/09 | 7.6 |
| 7/23/09 | 7.6 |
| 7/23/09 | 7.62 |
| 7/23/09 | 7.57 |
| 7/23/09 | 7.65 |
| 7/23/09 | 7.66 |
| 7/23/09 | 7.66 |
| 7/23/09 | 7.65 |
| 7/22/09 | 7.71 |
| 7/22/09 | 7.73 |
| 7/22/09 | 7.7 |
| 7/22/09 | 7.68 |
| 7/22/09 | 7.71 |
| 7/22/09 | 7.71 |
| 7/22/09 | 7.7 |
| 7/22/09 | 7.63 |
| 7/22/09 | 7.7 |
| 7/22/09 | 7.67 |
| 7/22/09 | 7.71 |
| 7/22/09 | 7.62 |
| 7/22/09 | 7.67 |
| 7/22/09 | 7.64 |
| 7/22/09 | 7.61 |
| 7/22/09 | 7.49 |
| 7/22/09 | 7.55 |
| 7/22/09 | 7.63 |
| 7/22/09 | 7.59 |
| 7/22/09 | 7.51 |
| 7/22/09 | 7.4 |
| 7/22/09 | 7.46 |
| 7/22/09 | 7.33 |
| 7/22/09 | 7.34 |
| 7/22/09 | 7.4 |
| 7/22/09 | 7.43 |
| 7/22/09 | 7.43 |
| 7/22/09 | 7.48 |
| 7/22/09 | 7.48 |
| 7/22/09 | 7.48 |
| 7/22/09 | 7.48 |
| 7/22/09 | 7.5 |
| 7/22/09 | 7.51 |
| 7/22/09 | 7.47 |
| 7/22/09 | 7.51 |
| 7/22/09 | 7.55 |
| 7/22/09 | 7.54 |
| 7/22/09 | 7.57 |
| 7/22/09 | 7.6 |
| 7/22/09 | 7.62 |
| 7/22/09 | 7.63 |
| 7/22/09 | 7.63 |
| 7/22/09 | 7.66 |
| 7/22/09 | 7.59 |
| 7/22/09 | 7.61 |
| 7/22/09 | 7.63 |
| 7/22/09 | 7.61 |
| 7/22/09 | 7.61 |
| 7/21/09 | 7.59 |
| 7/21/09 | 7.61 |
| 7/21/09 | 7.68 |
| 7/21/09 | 7.64 |
| 7/21/09 | 7.61 |
| 7/21/09 | 7.64 |
| 7/21/09 | 7.62 |
| 7/21/09 | 7.6 |
| 7/21/09 | 7.6 |
| 7/21/09 | 7.61 |
| 7/21/09 | 7.6 |
| 7/21/09 | 7.59 |
| 7/21/09 | 7.62 |
| 7/21/09 | 7.6 |
| 7/21/09 | 7.61 |
| 7/21/09 | 7.56 |
| 7/21/09 | 7.72 |
| 7/21/09 | 7.73 |
| 7/21/09 | 7.71 |
| 7/21/09 | 7.71 |
| 7/21/09 | 7.66 |
| 7/21/09 | 7.61 |
| 7/21/09 | 7.57 |
| 7/21/09 | 7.54 |
| 7/21/09 | 7.51 |
| 7/21/09 | 7.52 |
| 7/21/09 | 7.52 |
| 7/21/09 | 7.48 |
| 7/21/09 | 7.46 |
| 7/21/09 | 7.51 |
| 7/21/09 | 7.52 |
| 7/21/09 | 7.53 |
| 7/21/09 | 7.53 |
| 7/21/09 | 7.54 |
| 7/21/09 | 7.52 |
| 7/21/09 | 7.57 |
| 7/21/09 | 7.54 |
| 7/21/09 | 7.51 |
| 7/21/09 | 7.54 |
| 7/21/09 | 7.58 |
| 7/21/09 | 7.61 |
| 7/21/09 | 7.58 |
| 7/21/09 | 7.63 |
| 7/21/09 | 7.64 |
| 7/21/09 | 7.63 |
| 7/21/09 | 7.65 |
| 7/21/09 | 7.68 |
| 7/21/09 | 7.7 |
| 7/20/09 | 7.71 |
| 7/20/09 | 7.68 |
| 7/20/09 | 7.73 |
| 7/20/09 | 7.76 |
| 7/20/09 | 7.75 |
| 7/20/09 | 7.79 |
| 7/20/09 | 7.8 |
| 7/20/09 | 7.81 |
| 7/20/09 | 7.78 |
| 7/20/09 | 7.7 |
| 7/20/09 | 7.57 |
| 7/20/09 | 7.6 |
| 7/20/09 | 7.63 |
| 7/20/09 | 7.6 |
| 7/20/09 | 7.56 |
| 7/20/09 | 7.63 |
| 7/20/09 | 7.69 |
| 7/20/09 | 7.72 |
| 7/20/09 | 7.7 |
| 7/20/09 | 7.66 |
| 7/20/09 | 7.64 |
| 7/20/09 | 7.66 |
| 7/20/09 | 7.63 |
| 7/20/09 | 7.59 |
| 7/20/09 | 7.61 |
| 7/20/09 | 7.56 |
| 7/20/09 | 7.54 |
| 7/20/09 | 7.49 |
| 7/20/09 | 7.55 |
| 7/20/09 | 7.5 |
| 7/20/09 | 7.53 |
| 7/20/09 | 7.53 |
| 7/20/09 | 7.5 |
| 7/20/09 | 7.49 |
| 7/20/09 | 7.52 |
| 7/20/09 | 7.56 |
| 7/20/09 | 7.57 |
| 7/20/09 | 7.59 |
| 7/20/09 | 7.62 |
| 7/20/09 | 7.62 |
| 7/20/09 | 7.61 |
| 7/20/09 | 7.63 |
| 7/20/09 | 7.62 |
| 7/20/09 | 7.63 |
| 7/20/09 | 7.66 |
| 7/20/09 | 7.63 |
| 7/20/09 | 7.63 |
| 7/20/09 | 7.61 |
| 7/19/09 | 7.57 |
| 7/19/09 | 7.45 |
| 7/19/09 | 7.47 |
| 7/19/09 | 7.52 |
| 7/19/09 | 7.52 |
| 7/19/09 | 7.53 |
| 7/19/09 | 7.51 |
| 7/19/09 | 7.55 |
| 7/19/09 | 7.59 |
| 7/19/09 | 7.67 |
| 7/19/09 | 7.64 |
| 7/19/09 | 7.58 |
| 7/19/09 | 7.62 |
| 7/19/09 | 7.59 |
| 7/19/09 | 7.51 |
| 7/19/09 | 7.59 |
| 7/19/09 | 7.47 |
| 7/19/09 | 7.49 |
| 7/19/09 | 7.51 |
| 7/19/09 | 7.54 |
| 7/19/09 | 7.55 |
| 7/19/09 | 7.5 |
| 7/19/09 | 7.47 |
| 7/19/09 | 7.48 |
| 7/19/09 | 7.43 |
| 7/19/09 | 7.44 |
| 7/19/09 | 7.41 |
| 7/19/09 | 7.41 |
| 7/19/09 | 7.44 |
| 7/19/09 | 7.43 |
| 7/19/09 | 7.43 |
| 7/19/09 | 7.41 |
| 7/19/09 | 7.4 |
| 7/19/09 | 7.4 |
| 7/19/09 | 7.38 |
| 7/19/09 | 7.37 |
| 7/19/09 | 7.41 |
| 7/19/09 | 7.4 |
| 7/19/09 | 7.4 |
| 7/19/09 | 7.4 |
| 7/19/09 | 7.41 |
| 7/19/09 | 7.4 |
| 7/19/09 | 7.4 |
| 7/19/09 | 7.42 |
| 7/19/09 | 7.39 |
| 7/19/09 | 7.42 |
| 7/19/09 | 7.42 |
| 7/19/09 | 7.44 |
| 7/18/09 | 7.43 |
| 7/18/09 | 7.43 |
| 7/18/09 | 7.46 |
| 7/18/09 | 7.46 |
| 7/18/09 | 7.49 |
| 7/18/09 | 7.52 |
| 7/18/09 | 7.54 |
| 7/18/09 | 7.48 |
| 7/18/09 | 7.52 |
| 7/18/09 | 7.54 |
| 7/18/09 | 7.53 |
| 7/18/09 | 7.55 |
| 7/18/09 | 7.48 |
| 7/18/09 | 7.5 |
| 7/18/09 | 7.5 |
| 7/18/09 | 7.46 |
| 7/18/09 | 7.51 |
| 7/18/09 | 7.52 |
| 7/18/09 | 7.49 |
| 7/18/09 | 7.51 |
| 7/18/09 | 7.52 |
| 7/18/09 | 7.49 |
| 7/18/09 | 7.51 |
| 7/18/09 | 7.49 |
| 7/18/09 | 7.49 |
| 7/18/09 | 7.5 |
| 7/18/09 | 7.47 |
| 7/18/09 | 7.45 |
| 7/18/09 | 7.44 |
| 7/18/09 | 7.47 |
| 7/18/09 | 7.48 |
| 7/18/09 | 7.45 |
| 7/18/09 | 7.4 |
| 7/18/09 | 7.38 |
| 7/18/09 | 7.41 |
| 7/18/09 | 7.38 |
| 7/18/09 | 7.37 |
| 7/18/09 | 7.36 |
| 7/18/09 | 7.38 |
| 7/18/09 | 7.4 |
| 7/18/09 | 7.39 |
| 7/18/09 | 7.39 |
| 7/18/09 | 7.37 |
| 7/18/09 | 7.38 |
| 7/18/09 | 7.4 |
| 7/18/09 | 7.47 |
| 7/18/09 | 7.44 |
| 7/18/09 | 7.46 |
| 7/17/09 | 7.5 |
| 7/17/09 | 7.45 |
| 7/17/09 | 7.48 |
| 7/17/09 | 7.49 |
| 7/17/09 | 7.48 |
| 7/17/09 | 7.51 |
| 7/17/09 | 7.53 |
| 7/17/09 | 7.53 |
| 7/17/09 | 7.57 |
| 7/17/09 | 7.64 |
| 7/17/09 | 7.59 |
| 7/17/09 | 7.54 |
| 7/17/09 | 7.59 |
| 7/17/09 | 7.55 |
| 7/17/09 | 7.53 |
| 7/17/09 | 7.59 |
| 7/17/09 | 7.58 |
| 7/17/09 | 7.61 |
| 7/17/09 | 7.62 |
| 7/17/09 | 7.61 |
| 7/17/09 | 7.58 |
| 7/17/09 | 7.63 |
| 7/17/09 | 7.63 |
| 7/17/09 | 7.53 |
| 7/17/09 | 7.53 |
| 7/17/09 | 7.56 |
| 7/17/09 | 7.65 |
| 7/17/09 | 7.64 |
| 7/17/09 | 7.59 |
| 7/17/09 | 7.6 |
| 7/17/09 | 7.7 |
| 7/17/09 | 7.59 |
| 7/17/09 | 7.56 |
| 7/17/09 | 7.6 |
| 7/17/09 | 7.63 |
| 7/17/09 | 7.61 |
| 7/17/09 | 7.59 |
| 7/17/09 | 7.68 |
| 7/17/09 | 7.69 |
| 7/17/09 | 7.71 |
| 7/17/09 | 7.72 |
| 7/17/09 | 7.69 |
| 7/17/09 | 7.76 |
| 7/17/09 | 7.7 |
| 7/17/09 | 7.77 |
| 7/17/09 | 7.81 |
| 7/17/09 | 7.82 |
| 7/17/09 | 7.85 |
| 7/16/09 | 7.82 |
| 7/16/09 | 7.82 |
| 7/16/09 | 7.83 |
| 7/16/09 | 7.85 |
| 7/16/09 | 7.83 |
| 7/16/09 | 7.8 |
| 7/16/09 | 7.81 |
| 7/16/09 | 7.68 |
| 7/16/09 | 7.7 |
| 7/16/09 | 7.7 |
| 7/16/09 | 7.77 |
| 7/16/09 | 7.75 |
| 7/16/09 | 7.68 |
| 7/16/09 | 7.69 |
| 7/16/09 | 7.59 |
| 7/16/09 | 7.57 |
| 7/16/09 | 7.66 |
| 7/16/09 | 7.6 |
| 7/16/09 | 7.51 |
| 7/16/09 | 7.54 |
| 7/16/09 | 7.58 |
| 7/16/09 | 7.53 |
| 7/16/09 | 7.45 |
| 7/16/09 | 7.51 |
| 7/16/09 | 7.58 |
| 7/16/09 | 7.49 |
| 7/16/09 | 7.64 |
| 7/16/09 | 7.65 |
| 7/16/09 | 7.57 |
| 7/16/09 | 7.61 |
| 7/16/09 | 7.63 |
| 7/16/09 | 7.58 |
| 7/16/09 | 7.63 |
| 7/16/09 | 7.64 |
| 7/16/09 | 7.55 |
| 7/16/09 | 7.48 |
| 7/16/09 | 7.56 |
| 7/16/09 | 7.56 |
| 7/16/09 | 7.59 |
| 7/16/09 | 7.56 |
| 7/16/09 | 7.55 |
| 7/16/09 | 7.56 |
| 7/16/09 | 7.59 |
| 7/16/09 | 7.53 |
| 7/16/09 | 7.5 |
| 7/16/09 | 7.5 |
| 7/16/09 | 7.49 |
| 7/16/09 | 7.52 |
| 7/15/09 | 7.45 |
| 7/15/09 | 7.51 |
| 7/15/09 | 7.51 |
| 7/15/09 | 7.57 |
| 7/15/09 | 7.58 |
| 7/15/09 | 7.59 |
| 7/15/09 | 7.68 |
| 7/15/09 | 7.67 |
| 7/15/09 | 7.62 |
| 7/15/09 | 7.58 |
| 7/15/09 | 7.59 |
| 7/15/09 | 7.58 |
| 7/15/09 | 7.71 |
| 7/15/09 | 7.64 |
| 7/15/09 | 7.6 |
| 7/15/09 | 7.68 |
| 7/15/09 | 7.59 |
| 7/15/09 | 7.6 |
| 7/15/09 | 7.58 |
| 7/15/09 | 7.57 |
| 7/15/09 | 7.56 |
| 7/15/09 | 7.52 |
| 7/15/09 | 7.49 |
| 7/15/09 | 7.48 |
| 7/15/09 | 7.45 |
| 7/15/09 | 7.43 |
| 7/15/09 | 7.4 |
| 7/15/09 | 7.42 |
| 7/15/09 | 7.4 |
| 7/15/09 | 7.39 |
| 7/15/09 | 7.42 |
| 7/15/09 | 7.43 |
| 7/15/09 | 7.44 |
| 7/15/09 | 7.43 |
| 7/15/09 | 7.46 |
| 7/15/09 | 7.5 |
| 7/15/09 | 7.46 |
| 7/15/09 | 7.54 |
| 7/15/09 | 7.49 |
| 7/15/09 | 7.51 |
| 7/15/09 | 7.56 |
| 7/15/09 | 7.57 |
| 7/15/09 | 7.58 |
| 7/15/09 | 7.62 |
| 7/15/09 | 7.72 |
| 7/15/09 | 7.73 |
| 7/15/09 | 7.59 |
| 7/15/09 | 7.57 |
| 7/14/09 | 7.59 |
| 7/14/09 | 7.64 |
| 7/14/09 | 7.62 |
| 7/14/09 | 7.63 |
| 7/14/09 | 7.6 |
| 7/14/09 | 7.57 |
| 7/14/09 | 7.6 |
| 7/14/09 | 7.57 |
| 7/14/09 | 7.57 |
| 7/14/09 | 7.67 |
| 7/14/09 | 7.65 |
| 7/14/09 | 7.67 |
| 7/14/09 | 7.59 |
| 7/14/09 | 7.56 |
| 7/14/09 | 7.54 |
| 7/14/09 | 7.57 |
| 7/14/09 | 7.56 |
| 7/14/09 | 7.58 |
| 7/14/09 | 7.6 |
| 7/14/09 | 7.58 |
| 7/14/09 | 7.66 |
| 7/14/09 | 7.57 |
| 7/14/09 | 7.59 |
| 7/14/09 | 7.6 |
| 7/14/09 | 7.64 |
| 7/14/09 | 7.6 |
| 7/14/09 | 7.59 |
| 7/14/09 | 7.49 |
| 7/14/09 | 7.41 |
| 7/14/09 | 7.45 |
| 7/14/09 | 7.47 |
| 7/14/09 | 7.47 |
| 7/14/09 | 7.46 |
| 7/14/09 | 7.46 |
| 7/14/09 | 7.46 |
| 7/14/09 | 7.45 |
| 7/14/09 | 7.49 |
| 7/14/09 | 7.55 |
| 7/14/09 | 7.52 |
| 7/14/09 | 7.53 |
| 7/14/09 | 7.53 |
| 7/14/09 | 7.57 |
| 7/14/09 | 7.59 |
| 7/14/09 | 7.59 |
| 7/14/09 | 7.6 |
| 7/14/09 | 7.63 |
| 7/14/09 | 7.67 |
| 7/14/09 | 7.63 |
| 7/13/09 | 7.68 |
| 7/13/09 | 7.68 |
| 7/13/09 | 7.71 |
| 7/13/09 | 7.71 |
| 7/13/09 | 7.75 |
| 7/13/09 | 7.8 |
| 7/13/09 | 7.77 |
| 7/13/09 | 7.72 |
| 7/13/09 | 7.8 |
| 7/13/09 | 7.85 |
| 7/13/09 | 7.92 |
| 7/13/09 | 7.91 |
| 7/13/09 | 7.8 |
| 7/13/09 | 7.84 |
| 7/13/09 | 7.76 |
| 7/13/09 | 7.73 |
| 7/13/09 | 7.74 |
| 7/13/09 | 7.63 |
| 7/13/09 | 7.7 |
| 7/13/09 | 7.68 |
| 7/13/09 | 7.85 |
| 7/13/09 | 7.76 |
| 7/13/09 | 7.75 |
| 7/13/09 | 7.76 |
| 7/13/09 | 7.7 |
| 7/13/09 | 7.71 |
| 7/13/09 | 7.71 |
| 7/13/09 | 7.74 |
| 7/13/09 | 7.73 |
| 7/13/09 | 7.61 |
| 7/13/09 | 7.56 |
| 7/13/09 | 7.6 |
| 7/13/09 | 7.62 |
| 7/13/09 | 7.63 |
| 7/13/09 | 7.67 |
| 7/13/09 | 7.65 |
| 7/13/09 | 7.65 |
| 7/13/09 | 7.69 |
| 7/13/09 | 7.74 |
| 7/13/09 | 7.73 |
| 7/13/09 | 7.73 |
| 7/13/09 | 7.73 |
| 7/13/09 | 7.72 |
| 7/13/09 | 7.75 |
| 7/13/09 | 7.76 |
| 7/13/09 | 7.76 |
| 7/13/09 | 7.79 |
| 7/13/09 | 7.82 |
| 7/12/09 | 7.77 |
| 7/12/09 | 7.8 |
| 7/12/09 | 7.82 |
| 7/12/09 | 7.87 |
| 7/12/09 | 7.78 |
| 7/12/09 | 7.75 |
| 7/12/09 | 7.76 |
| 7/12/09 | 7.73 |
| 7/12/09 | 7.76 |
| 7/12/09 | 7.72 |
| 7/12/09 | 7.82 |
| 7/12/09 | 7.8 |
| 7/12/09 | 7.78 |
| 7/12/09 | 7.81 |
| 7/12/09 | 7.73 |
| 7/12/09 | 7.73 |
| 7/12/09 | 7.78 |
| 7/12/09 | 7.78 |
| 7/12/09 | 7.85 |
| 7/12/09 | 7.78 |
| 7/12/09 | 7.77 |
| 7/12/09 | 7.62 |
| 7/12/09 | 7.72 |
| 7/12/09 | 7.73 |
| 7/12/09 | 7.64 |
| 7/12/09 | 7.64 |
| 7/12/09 | 7.64 |
| 7/12/09 | 7.64 |
| 7/12/09 | 7.66 |
| 7/12/09 | 7.55 |
| 7/12/09 | 7.62 |
| 7/12/09 | 7.54 |
| 7/12/09 | 7.51 |
| 7/12/09 | 7.55 |
| 7/12/09 | 7.54 |
| 7/12/09 | 7.53 |
| 7/12/09 | 7.53 |
| 7/12/09 | 7.5 |
| 7/12/09 | 7.51 |
| 7/12/09 | 7.51 |
| 7/12/09 | 7.54 |
| 7/12/09 | 7.52 |
| 7/12/09 | 7.56 |
| 7/12/09 | 7.55 |
| 7/12/09 | 7.57 |
| 7/12/09 | 7.69 |
| 7/12/09 | 7.72 |
| 7/12/09 | 7.73 |
| 7/11/09 | 7.65 |
| 7/11/09 | 7.73 |
| 7/11/09 | 7.8 |
| 7/11/09 | 7.9 |
| 7/11/09 | 7.95 |
| 7/11/09 | 7.95 |
| 7/11/09 | 7.93 |
| 7/11/09 | 7.85 |
| 7/11/09 | 7.54 |
| 7/11/09 | 7.64 |
| 7/11/09 | 7.8 |
| 7/11/09 | 7.69 |
| 7/11/09 | 7.52 |
| 7/11/09 | 7.56 |
| 7/11/09 | 8.01 |
| 7/11/09 | 7.89 |
| 7/11/09 | 7.89 |
| 7/11/09 | 7.88 |
| 7/11/09 | 7.83 |
| 7/11/09 | 7.81 |
| 7/11/09 | 7.79 |
| 7/11/09 | 7.76 |
| 7/11/09 | 7.77 |
| 7/11/09 | 7.71 |
| 7/11/09 | 7.69 |
| 7/11/09 | 7.7 |
| 7/11/09 | 7.74 |
| 7/11/09 | 7.76 |
| 7/11/09 | 7.71 |
| 7/11/09 | 7.71 |
| 7/11/09 | 7.79 |
| 7/11/09 | 7.73 |
| 7/11/09 | 7.71 |
| 7/11/09 | 7.7 |
| 7/11/09 | 7.72 |
| 7/11/09 | 7.71 |
| 7/11/09 | 7.66 |
| 7/11/09 | 7.53 |
| 7/11/09 | 7.52 |
| 7/11/09 | 7.49 |
| 7/11/09 | 7.53 |
| 7/11/09 | 7.54 |
| 7/11/09 | 7.53 |
| 7/11/09 | 7.46 |
| 7/11/09 | 7.45 |
| 7/11/09 | 7.51 |
| 7/11/09 | 7.48 |
| 7/11/09 | 7.49 |
| 7/10/09 | 7.61 |
| 7/10/09 | 7.57 |
| 7/10/09 | 7.61 |
| 7/10/09 | 7.64 |
| 7/10/09 | 7.74 |
| 7/10/09 | 7.72 |
| 7/10/09 | 7.78 |
| 7/10/09 | 7.72 |
| 7/10/09 | 7.8 |
| 7/10/09 | 7.92 |
| 7/10/09 | 7.67 |
| 7/10/09 | 7.75 |
| 7/10/09 | 7.86 |
| 7/10/09 | 7.89 |
| 7/10/09 | 7.84 |
| 7/10/09 | 7.82 |
| 7/10/09 | 7.75 |
| 7/10/09 | 7.8 |
| 7/10/09 | 7.76 |
| 7/10/09 | 7.82 |
| 7/10/09 | 7.83 |
| 7/10/09 | 7.77 |
| 7/10/09 | 7.78 |
| 7/10/09 | 7.79 |
| 7/10/09 | 7.77 |
| 7/10/09 | 7.72 |
| 7/10/09 | 7.67 |
| 7/10/09 | 7.74 |
| 7/10/09 | 7.63 |
| 7/10/09 | 7.63 |
| 7/10/09 | 7.64 |
| 7/10/09 | 7.62 |
| 7/10/09 | 7.63 |
| 7/10/09 | 7.8 |
| 7/10/09 | 7.64 |
| 7/10/09 | 7.61 |
| 7/10/09 | 7.57 |
| 7/10/09 | 7.57 |
| 7/10/09 | 7.48 |
| 7/10/09 | 7.54 |
| 7/10/09 | 7.55 |
| 7/10/09 | 7.53 |
| 7/10/09 | 7.56 |
| 7/10/09 | 7.53 |
| 7/10/09 | 7.54 |
| 7/10/09 | 7.5 |
| 7/10/09 | 7.39 |
| 7/10/09 | 7.4 |
| 7/9/09 | 7.49 |
| 7/9/09 | 7.51 |
| 7/9/09 | 7.38 |
| 7/9/09 | 7.42 |
| 7/9/09 | 7.47 |
| 7/9/09 | 7.6 |
| 7/9/09 | 7.67 |
| 7/9/09 | 7.68 |
| 7/9/09 | 7.81 |
| 7/9/09 | 7.73 |
| 7/9/09 | 7.74 |
| 7/9/09 | 7.69 |
| 7/9/09 | 7.75 |
| 7/9/09 | 7.76 |
| 7/9/09 | 7.63 |
| 7/9/09 | 7.65 |
| 7/9/09 | 7.71 |
| 7/9/09 | 7.72 |
| 7/9/09 | 7.81 |
| 7/9/09 | 7.76 |
| 7/9/09 | 7.73 |
| 7/9/09 | 7.69 |
| 7/9/09 | 7.7 |
| 7/9/09 | 7.65 |
| 7/9/09 | 7.61 |
| 7/9/09 | 7.62 |
| 7/9/09 | 7.58 |
| 7/9/09 | 7.54 |
| 7/9/09 | 7.48 |
| 7/9/09 | 7.51 |
| 7/9/09 | 7.58 |
| 7/9/09 | 7.49 |
| 7/9/09 | 7.5 |
| 7/9/09 | 7.49 |
| 7/9/09 | 7.54 |
| 7/9/09 | 7.59 |
| 7/9/09 | 7.6 |
| 7/9/09 | 7.54 |
| 7/9/09 | 7.53 |
| 7/9/09 | 7.55 |
| 7/9/09 | 7.54 |
| 7/9/09 | 7.56 |
| 7/9/09 | 7.53 |
| 7/9/09 | 7.6 |
| 7/9/09 | 7.56 |
| 7/9/09 | 7.61 |
| 7/9/09 | 7.66 |
| 7/9/09 | 7.66 |
| 7/8/09 | 7.67 |
| 7/8/09 | 7.52 |
| 7/8/09 | 7.54 |
| 7/8/09 | 7.51 |
| 7/8/09 | 7.55 |
| 7/8/09 | 7.54 |
| 7/8/09 | 7.6 |
| 7/8/09 | 7.62 |
| 7/8/09 | 7.69 |
| 7/8/09 | 7.63 |
| 7/8/09 | 7.65 |
| 7/8/09 | 7.71 |
| 7/8/09 | 7.66 |
| 7/8/09 | 7.65 |
| 7/8/09 | 7.65 |
| 7/8/09 | 7.65 |
| 7/8/09 | 7.69 |
| 7/8/09 | 7.69 |
| 7/8/09 | 7.75 |
| 7/8/09 | 7.76 |
| 7/8/09 | 7.72 |
| 7/8/09 | 7.65 |
| 7/8/09 | 7.61 |
| 7/8/09 | 7.72 |
| 7/8/09 | 7.64 |
| 7/8/09 | 7.58 |
| 7/8/09 | 7.61 |
| 7/8/09 | 7.55 |
| 7/8/09 | 7.56 |
| 7/8/09 | 7.47 |
| 7/8/09 | 7.48 |
| 7/8/09 | 7.46 |
| 7/8/09 | 7.46 |
| 7/8/09 | 7.49 |
| 7/8/09 | 7.5 |
| 7/8/09 | 7.55 |
| 7/8/09 | 7.54 |
| 7/8/09 | 7.5 |
| 7/8/09 | 7.52 |
| 7/8/09 | 7.57 |
| 7/8/09 | 7.55 |
| 7/8/09 | 7.53 |
| 7/8/09 | 7.56 |
| 7/8/09 | 7.56 |
| 7/8/09 | 7.61 |
| 7/8/09 | 7.6 |
| 7/8/09 | 7.6 |
| 7/8/09 | 7.66 |
| 7/7/09 | 7.75 |
| 7/7/09 | 7.81 |
| 7/7/09 | 7.87 |
| 7/7/09 | 7.93 |
| 7/7/09 | 7.91 |
| 7/7/09 | 7.91 |
| 7/7/09 | 7.9 |
| 7/7/09 | 7.81 |
| 7/7/09 | 7.94 |
| 7/7/09 | 7.89 |
| 7/7/09 | 7.76 |
| 7/7/09 | 7.74 |
| 7/7/09 | 7.82 |
| 7/7/09 | 7.73 |
| 7/7/09 | 7.72 |
| 7/7/09 | 7.92 |
| 7/7/09 | 7.61 |
| 7/7/09 | 7.72 |
| 7/7/09 | 7.79 |
| 7/7/09 | 7.71 |
| 7/7/09 | 7.9 |
| 7/7/09 | 7.89 |
| 7/7/09 | 7.88 |
| 7/7/09 | 7.87 |
| 7/7/09 | 7.86 |
| 7/7/09 | 7.8 |
| 7/7/09 | 7.86 |
| 7/7/09 | 7.94 |
| 7/7/09 | 7.87 |
| 7/7/09 | 7.83 |
| 7/7/09 | 7.65 |
| 7/7/09 | 7.66 |
| 7/7/09 | 7.68 |
| 7/7/09 | 7.67 |
| 7/7/09 | 7.69 |
| 7/7/09 | 7.7 |
| 7/7/09 | 7.71 |
| 7/7/09 | 7.67 |
| 7/7/09 | 7.65 |
| 7/7/09 | 7.7 |
| 7/7/09 | 7.71 |
| 7/7/09 | 7.76 |
| 7/7/09 | 7.78 |
| 7/7/09 | 7.79 |
| 7/7/09 | 7.77 |
| 7/7/09 | 7.78 |
| 7/7/09 | 7.63 |
| 7/7/09 | 7.67 |
| 7/6/09 | 7.65 |
| 7/6/09 | 7.88 |
| 7/6/09 | 7.72 |
| 7/6/09 | 7.8 |
| 7/6/09 | 7.88 |
| 7/6/09 | 7.99 |
| 7/6/09 | 7.95 |
| 7/6/09 | 7.94 |
| 7/6/09 | 7.97 |
| 7/6/09 | 7.86 |
| 7/6/09 | 7.97 |
| 7/6/09 | 8.06 |
| 7/6/09 | 8.05 |
| 7/6/09 | 8 |
| 7/6/09 | 7.81 |
| 7/6/09 | 7.82 |
| 7/6/09 | 7.79 |
| 7/6/09 | 7.92 |
| 7/6/09 | 8.04 |
| 7/6/09 | 7.96 |
| 7/6/09 | 7.99 |
| 7/6/09 | 7.93 |
| 7/6/09 | 7.97 |
| 7/6/09 | 7.87 |
| 7/6/09 | 7.8 |
| 7/6/09 | 7.83 |
| 7/6/09 | 7.77 |
| 7/6/09 | 7.76 |
| 7/6/09 | 7.72 |
| 7/6/09 | 7.89 |
| 7/6/09 | 7.75 |
| 7/6/09 | 7.82 |
| 7/6/09 | 7.76 |
| 7/6/09 | 7.76 |
| 7/6/09 | 7.8 |
| 7/6/09 | 7.83 |
| 7/6/09 | 7.78 |
| 7/6/09 | 7.7 |
| 7/6/09 | 7.75 |
| 7/6/09 | 7.69 |
| 7/6/09 | 7.73 |
| 7/6/09 | 7.75 |
| 7/6/09 | 7.67 |
| 7/6/09 | 7.76 |
| 7/6/09 | 7.82 |
| 7/6/09 | 7.82 |
| 7/6/09 | 7.8 |
| 7/6/09 | 7.81 |
| 7/5/09 | 7.76 |
| 7/5/09 | 7.78 |
| 7/5/09 | 7.72 |
| 7/5/09 | 7.77 |
| 7/5/09 | 7.84 |
| 7/5/09 | 7.83 |
| 7/5/09 | 7.8 |
| 7/5/09 | 7.77 |
| 7/5/09 | 7.83 |
| 7/5/09 | 7.86 |
| 7/5/09 | 7.93 |
| 7/5/09 | 8.05 |
| 7/5/09 | 7.88 |
| 7/5/09 | 7.86 |
| 7/5/09 | 7.83 |
| 7/5/09 | 7.76 |
| 7/5/09 | 7.75 |
| 7/5/09 | 7.76 |
| 7/5/09 | 7.67 |
| 7/5/09 | 7.66 |
| 7/5/09 | 7.6 |
| 7/5/09 | 7.67 |
| 7/5/09 | 7.61 |
| 7/5/09 | 7.62 |
| 7/5/09 | 7.64 |
| 7/5/09 | 7.48 |
| 7/5/09 | 7.48 |
| 7/5/09 | 7.53 |
| 7/5/09 | 7.5 |
| 7/5/09 | 7.49 |
| 7/5/09 | 7.49 |
| 7/5/09 | 7.5 |
| 7/5/09 | 7.51 |
| 7/5/09 | 7.52 |
| 7/5/09 | 7.55 |
| 7/5/09 | 7.57 |
| 7/5/09 | 7.6 |
| 7/5/09 | 7.58 |
| 7/5/09 | 7.6 |
| 7/5/09 | 7.61 |
| 7/5/09 | 7.62 |
| 7/5/09 | 7.56 |
| 7/5/09 | 7.56 |
| 7/5/09 | 7.62 |
| 7/5/09 | 7.63 |
| 7/5/09 | 7.65 |
| 7/5/09 | 7.68 |
| 7/5/09 | 7.72 |
| 7/4/09 | 7.76 |
| 7/4/09 | 7.81 |
| 7/4/09 | 7.87 |
| 7/4/09 | 7.82 |
| 7/4/09 | 7.86 |
| 7/4/09 | 7.94 |
| 7/4/09 | 7.88 |
| 7/4/09 | 7.79 |
| 7/4/09 | 7.82 |
| 7/4/09 | 7.82 |
| 7/4/09 | 7.88 |
| 7/4/09 | 7.79 |
| 7/4/09 | 7.83 |
| 7/4/09 | 7.79 |
| 7/4/09 | 7.77 |
| 7/4/09 | 7.76 |
| 7/4/09 | 7.67 |
| 7/4/09 | 7.67 |
| 7/4/09 | 7.65 |
| 7/4/09 | 7.58 |
| 7/4/09 | 7.61 |
| 7/4/09 | 7.65 |
| 7/4/09 | 7.59 |
| 7/4/09 | 7.61 |
| 7/4/09 | 7.53 |
| 7/4/09 | 7.54 |
| 7/4/09 | 7.54 |
| 7/4/09 | 7.54 |
| 7/4/09 | 7.52 |
| 7/4/09 | 7.46 |
| 7/4/09 | 7.39 |
| 7/4/09 | 7.42 |
| 7/4/09 | 7.41 |
| 7/4/09 | 7.39 |
| 7/4/09 | 7.41 |
| 7/4/09 | 7.43 |
| 7/4/09 | 7.41 |
| 7/4/09 | 7.4 |
| 7/4/09 | 7.41 |
| 7/4/09 | 7.43 |
| 7/4/09 | 7.43 |
| 7/4/09 | 7.44 |
| 7/4/09 | 7.47 |
| 7/4/09 | 7.46 |
| 7/4/09 | 7.49 |
| 7/4/09 | 7.51 |
| 7/4/09 | 7.54 |
| 7/4/09 | 7.46 |
| 7/3/09 | 7.49 |
| 7/3/09 | 7.6 |
| 7/3/09 | 7.67 |
| 7/3/09 | 7.71 |
| 7/3/09 | 7.68 |
| 7/3/09 | 7.72 |
| 7/3/09 | 7.8 |
| 7/3/09 | 7.78 |
| 7/3/09 | 7.72 |
| 7/3/09 | 7.64 |
| 7/3/09 | 7.63 |
| 7/3/09 | 7.63 |
| 7/3/09 | 7.59 |
| 7/3/09 | 7.54 |
| 7/3/09 | 7.58 |
| 7/3/09 | 7.53 |
| 7/3/09 | 7.59 |
| 7/3/09 | 7.54 |
| 7/3/09 | 7.53 |
| 7/3/09 | 7.58 |
| 7/3/09 | 7.59 |
| 7/3/09 | 7.55 |
| 7/3/09 | 7.55 |
| 7/3/09 | 7.54 |
| 7/3/09 | 7.53 |
| 7/3/09 | 7.5 |
| 7/3/09 | 7.47 |
| 7/3/09 | 7.48 |
| 7/3/09 | 7.46 |
| 7/3/09 | 7.46 |
| 7/3/09 | 7.44 |
| 7/3/09 | 7.46 |
| 7/3/09 | 7.43 |
| 7/3/09 | 7.43 |
| 7/3/09 | 7.43 |
| 7/3/09 | 7.39 |
| 7/3/09 | 7.42 |
| 7/3/09 | 7.42 |
| 7/3/09 | 7.43 |
| 7/3/09 | 7.43 |
| 7/3/09 | 7.41 |
| 7/3/09 | 7.45 |
| 7/3/09 | 7.42 |
| 7/3/09 | 7.43 |
| 7/3/09 | 7.45 |
| 7/3/09 | 7.44 |
| 7/3/09 | 7.45 |
| 7/3/09 | 7.46 |
| 7/2/09 | 7.42 |
| 7/2/09 | 7.43 |
| 7/2/09 | 7.45 |
| 7/2/09 | 7.44 |
| 7/2/09 | 7.45 |
| 7/2/09 | 7.49 |
| 7/2/09 | 7.59 |
| 7/2/09 | 7.64 |
| 7/2/09 | 7.7 |
| 7/2/09 | 7.69 |
| 7/2/09 | 7.8 |
| 7/2/09 | 7.84 |
| 7/2/09 | 7.76 |
| 7/2/09 | 7.75 |
| 7/2/09 | 7.63 |
| 7/2/09 | 7.74 |
| 7/2/09 | 7.75 |
| 7/2/09 | 7.71 |
| 7/2/09 | 7.67 |
| 7/2/09 | 7.66 |
| 7/2/09 | 7.71 |
| 7/2/09 | 7.64 |
| 7/2/09 | 7.6 |
| 7/2/09 | 7.61 |
| 7/2/09 | 7.56 |
| 7/2/09 | 7.54 |
| 7/2/09 | 7.56 |
| 7/2/09 | 7.57 |
| 7/2/09 | 7.59 |
| 7/2/09 | 7.56 |
| 7/2/09 | 7.63 |
| 7/2/09 | 7.61 |
| 7/2/09 | 7.59 |
| 7/2/09 | 7.62 |
| 7/2/09 | 7.61 |
| 7/2/09 | 7.66 |
| 7/2/09 | 7.68 |
| 7/2/09 | 7.67 |
| 7/2/09 | 7.68 |
| 7/2/09 | 7.65 |
| 7/2/09 | 7.69 |
| 7/2/09 | 7.71 |
| 7/2/09 | 7.75 |
| 7/2/09 | 7.75 |
| 7/2/09 | 7.77 |
| 7/2/09 | 7.79 |
| 7/2/09 | 7.8 |
| 7/2/09 | 7.84 |
| 7/1/09 | 7.83 |
| 7/1/09 | 7.83 |
| 7/1/09 | 7.8 |
| 7/1/09 | 7.88 |
| 7/1/09 | 7.87 |
| 7/1/09 | 7.89 |
| 7/1/09 | 7.87 |
| 7/1/09 | 7.86 |
| 7/1/09 | 7.82 |
| 7/1/09 | 7.81 |
| 7/1/09 | 7.82 |
| 7/1/09 | 7.93 |
| 7/1/09 | 7.79 |
| 7/1/09 | 7.89 |
| 7/1/09 | 7.81 |
| 7/1/09 | 7.74 |
| 7/1/09 | 7.82 |
| 7/1/09 | 7.8 |
| 7/1/09 | 7.75 |
| 7/1/09 | 7.71 |
| 7/1/09 | 7.73 |
| 7/1/09 | 7.69 |
| 7/1/09 | 7.68 |
| 7/1/09 | 7.7 |
| 7/1/09 | 7.72 |
| 7/1/09 | 7.62 |
| 7/1/09 | 7.62 |
| 7/1/09 | 7.61 |
| 7/1/09 | 7.58 |
| 7/1/09 | 7.58 |
| 7/1/09 | 7.56 |
| 7/1/09 | 7.56 |
| 7/1/09 | 7.59 |
| 7/1/09 | 7.59 |
| 7/1/09 | 7.54 |
| 7/1/09 | 7.6 |
| 7/1/09 | 7.54 |
| 7/1/09 | 7.56 |
| 7/1/09 | 7.53 |
| 7/1/09 | 7.54 |
| 7/1/09 | 7.6 |
| 7/1/09 | 7.6 |
| 7/1/09 | 7.62 |
| 7/1/09 | 7.62 |
| 7/1/09 | 7.67 |
| 7/1/09 | 7.64 |
| 7/1/09 | 7.69 |
| 7/1/09 | 7.71 |
| 6/30/09 | 7.72 |
| 6/30/09 | 7.77 |
| 6/30/09 | 7.87 |
| 6/30/09 | 7.95 |
| 6/30/09 | 7.96 |
| 6/30/09 | 7.96 |
| 6/30/09 | 7.97 |
| 6/30/09 | 8 |
| 6/30/09 | 8.03 |
| 6/30/09 | 7.98 |
| 6/30/09 | 7.97 |
| 6/30/09 | 8.01 |
| 6/30/09 | 8.02 |
| 6/30/09 | 7.93 |
| 6/30/09 | 7.93 |
| 6/30/09 | 7.92 |
| 6/30/09 | 7.85 |
| 6/30/09 | 7.85 |
| 6/30/09 | 7.83 |
| 6/30/09 | 7.85 |
| 6/30/09 | 7.87 |
| 6/30/09 | 7.89 |
| 6/30/09 | 7.89 |
| 6/30/09 | 7.88 |
| 6/30/09 | 7.8 |
| 6/30/09 | 7.8 |
| 6/30/09 | 7.82 |
| 6/30/09 | 7.76 |
| 6/30/09 | 7.72 |
| 6/30/09 | 7.74 |
| 6/30/09 | 7.75 |
| 6/30/09 | 7.75 |
| 6/30/09 | 7.78 |
| 6/30/09 | 7.82 |
| 6/30/09 | 7.83 |
| 6/30/09 | 7.84 |
| 6/30/09 | 7.84 |
| 6/30/09 | 7.87 |
| 6/30/09 | 7.85 |
| 6/30/09 | 7.88 |
| 6/30/09 | 7.88 |
| 6/30/09 | 7.92 |
| 6/30/09 | 7.9 |
| 6/30/09 | 7.93 |
| 6/30/09 | 7.97 |
| 6/30/09 | 7.94 |
| 6/30/09 | 7.99 |
| 6/30/09 | 7.99 |
| 6/29/09 | 8 |
| 6/29/09 | 7.99 |
| 6/29/09 | 8.06 |
| 6/29/09 | 8.05 |
| 6/29/09 | 8.09 |
| 6/29/09 | 8.11 |
| 6/29/09 | 8.08 |
| 6/29/09 | 8.08 |
| 6/29/09 | 8.04 |
| 6/29/09 | 7.98 |
| 6/29/09 | 8.12 |
| 6/29/09 | 7.98 |
| 6/29/09 | 7.9 |
| 6/29/09 | 7.88 |
| 6/29/09 | 7.92 |
| 6/29/09 | 7.91 |
| 6/29/09 | 7.91 |
| 6/29/09 | 7.91 |
| 6/29/09 | 7.97 |
| 6/29/09 | 7.91 |
| 6/29/09 | 7.82 |
| 6/29/09 | 7.84 |
| 6/29/09 | 7.82 |
| 6/29/09 | 7.87 |
| 6/29/09 | 7.8 |
| 6/29/09 | 7.76 |
| 6/29/09 | 7.74 |
| 6/29/09 | 7.68 |
| 6/29/09 | 7.71 |
| 6/29/09 | 7.71 |
| 6/29/09 | 7.71 |
| 6/29/09 | 7.67 |
| 6/29/09 | 7.68 |
| 6/29/09 | 7.7 |
| 6/29/09 | 7.73 |
| 6/29/09 | 7.77 |
| 6/29/09 | 7.8 |
| 6/29/09 | 7.79 |
| 6/29/09 | 7.81 |
| 6/29/09 | 7.86 |
| 6/29/09 | 7.83 |
| 6/29/09 | 7.87 |
| 6/29/09 | 7.91 |
| 6/29/09 | 7.94 |
| 6/29/09 | 7.96 |
| 6/29/09 | 7.93 |
| 6/29/09 | 7.99 |
| 6/29/09 | 8.03 |
| 6/28/09 | 8.07 |
| 6/28/09 | 8.12 |
| 6/28/09 | 8.11 |
| 6/28/09 | 8.13 |
| 6/28/09 | 8.14 |
| 6/28/09 | 8.1 |
| 6/28/09 | 8.1 |
| 6/28/09 | 8.15 |
| 6/28/09 | 8.16 |
| 6/28/09 | 8.22 |
| 6/28/09 | 8.1 |
| 6/28/09 | 8.17 |
| 6/28/09 | 8.22 |
| 6/28/09 | 8.21 |
| 6/28/09 | 8.17 |
| 6/28/09 | 8.12 |
| 6/28/09 | 8.08 |
| 6/28/09 | 8.16 |
| 6/28/09 | 8.1 |
| 6/28/09 | 8.02 |
| 6/28/09 | 8.05 |
| 6/28/09 | 8.09 |
| 6/28/09 | 8.06 |
| 6/28/09 | 7.96 |
| 6/28/09 | 8.01 |
| 6/28/09 | 7.96 |
| 6/28/09 | 7.98 |
| 6/28/09 | 8.02 |
| 6/28/09 | 7.96 |
| 6/28/09 | 7.99 |
| 6/28/09 | 8 |
| 6/28/09 | 8.05 |
| 6/28/09 | 8.04 |
| 6/28/09 | 8.1 |
| 6/28/09 | 8.09 |
| 6/28/09 | 8.1 |
| 6/28/09 | 8.15 |
| 6/28/09 | 8.16 |
| 6/28/09 | 8.16 |
| 6/28/09 | 8.17 |
| 6/28/09 | 8.19 |
| 6/28/09 | 8.16 |
| 6/28/09 | 8.19 |
| 6/28/09 | 8.19 |
| 6/28/09 | 8.19 |
| 6/28/09 | 8.19 |
| 6/28/09 | 8.15 |
| 6/28/09 | 8.22 |
| 6/27/09 | 8.25 |
| 6/27/09 | 8.28 |
| 6/27/09 | 8.26 |
| 6/27/09 | 8.25 |
| 6/27/09 | 8.26 |
| 6/27/09 | 8.27 |
| 6/27/09 | 8.29 |
| 6/27/09 | 8.26 |
| 6/27/09 | 8.22 |
| 6/27/09 | 8.26 |
| 6/27/09 | 8.23 |
| 6/27/09 | 8.26 |
| 6/27/09 | 8.2 |
| 6/27/09 | 8.24 |
| 6/27/09 | 8.24 |
| 6/27/09 | 8.21 |
| 6/27/09 | 8.24 |
| 6/27/09 | 8.23 |
| 6/27/09 | 8.24 |
| 6/27/09 | 8.2 |
| 6/27/09 | 8.16 |
| 6/27/09 | 8.16 |
| 6/27/09 | 8.15 |
| 6/27/09 | 8.11 |
| 6/27/09 | 8.14 |
| 6/27/09 | 8.12 |
| 6/27/09 | 8 |
| 6/27/09 | 7.92 |
| 6/27/09 | 7.97 |
| 6/27/09 | 7.99 |
| 6/27/09 | 7.95 |
| 6/27/09 | 7.95 |
| 6/27/09 | 7.94 |
| 6/27/09 | 7.97 |
| 6/27/09 | 8.01 |
| 6/27/09 | 8.01 |
| 6/27/09 | 8.07 |
| 6/27/09 | 8.08 |
| 6/27/09 | 8.11 |
| 6/27/09 | 8.12 |
| 6/27/09 | 8.12 |
| 6/27/09 | 8.15 |
| 6/27/09 | 8.17 |
| 6/27/09 | 8.18 |
| 6/27/09 | 8.2 |
| 6/27/09 | 8.22 |
| 6/27/09 | 8.24 |
| 6/27/09 | 8.23 |
| 6/26/09 | 8.25 |
| 6/26/09 | 8.27 |
| 6/26/09 | 8.28 |
| 6/26/09 | 8.27 |
| 6/26/09 | 8.3 |
| 6/26/09 | 8.3 |
| 6/26/09 | 8.25 |
| 6/26/09 | 8.26 |
| 6/26/09 | 8.27 |
| 6/26/09 | 8.24 |
| 6/26/09 | 8.26 |
| 6/26/09 | 8.24 |
| 6/26/09 | 8.18 |
| 6/26/09 | 8.25 |
| 6/26/09 | 8.26 |
| 6/26/09 | 8.26 |
| 6/26/09 | 8.26 |
| 6/26/09 | 8.27 |
| 6/26/09 | 8.2 |
| 6/26/09 | 8.24 |
| 6/26/09 | 8.24 |
| 6/26/09 | 8.26 |
| 6/26/09 | 8.23 |
| 6/26/09 | 8.22 |
| 6/26/09 | 8.21 |
| 6/26/09 | 8.38 |
| 6/26/09 | 8.38 |
| 6/26/09 | 8.39 |
| 6/26/09 | 8.32 |
| 6/26/09 | 8.34 |
| 6/26/09 | 8.37 |
| 6/26/09 | 8.35 |
| 6/26/09 | 8.36 |
| 6/26/09 | 8.34 |
| 6/26/09 | 8.37 |
| 6/26/09 | 8.35 |
| 6/26/09 | 8.37 |
| 6/26/09 | 8.32 |
| 6/26/09 | 8.27 |
| 6/26/09 | 8.28 |
| 6/26/09 | 8.25 |
| 6/26/09 | 8.27 |
| 6/26/09 | 8.35 |
| 6/26/09 | 8.43 |
| 6/26/09 | 8.44 |
| 6/26/09 | 8.35 |
| 6/26/09 | 8.36 |
| 6/25/09 | 8.3 |
| 6/25/09 | 8.35 |
| 6/25/09 | 8.37 |
| 6/25/09 | 8.32 |
| 6/25/09 | 8.45 |
| 6/25/09 | 8.51 |
| 6/25/09 | 8.5 |
| 6/25/09 | 8.43 |
| 6/25/09 | 8.38 |
| 6/25/09 | 8.39 |
| 6/25/09 | 8.4 |
| 6/25/09 | 8.43 |
| 6/25/09 | 8.44 |
| 6/25/09 | 8.44 |
| 6/25/09 | 8.45 |
| 6/25/09 | 8.41 |
| 6/25/09 | 8.46 |
| 6/25/09 | 8.47 |
| 6/25/09 | 8.45 |
| 6/25/09 | 8.47 |
| 6/25/09 | 8.44 |
| 6/25/09 | 8.44 |
| 6/25/09 | 8.36 |
| 6/25/09 | 8.36 |
| 6/25/09 | 8.39 |
| 6/25/09 | 8.39 |
| 6/25/09 | 8.4 |
| 6/25/09 | 8.39 |
| 6/25/09 | 8.38 |
| 6/25/09 | 8.38 |
| 6/25/09 | 8.34 |
| 6/25/09 | 8.4 |
| 6/25/09 | 8.38 |
| 6/25/09 | 8.39 |
| 6/25/09 | 8.4 |
| 6/25/09 | 8.42 |
| 6/25/09 | 8.4 |
| 6/25/09 | 8.39 |
| 6/25/09 | 8.34 |
| 6/25/09 | 8.38 |
| 6/25/09 | 8.38 |
| 6/25/09 | 8.4 |
| 6/25/09 | 8.34 |
| 6/25/09 | 8.39 |
| 6/25/09 | 8.35 |
| 6/25/09 | 8.3 |
| 6/25/09 | 8.34 |
| 6/25/09 | 8.39 |
| 6/24/09 | 8.41 |
| 6/24/09 | 8.4 |
| 6/24/09 | 8.4 |
| 6/24/09 | 8.43 |
| 6/24/09 | 8.47 |
| 6/24/09 | 8.48 |
| 6/24/09 | 8.47 |
| 6/24/09 | 8.53 |
| 6/24/09 | 8.51 |
| 6/24/09 | 8.47 |
| 6/24/09 | 8.48 |
| 6/24/09 | 8.5 |
| 6/24/09 | 8.54 |
| 6/24/09 | 8.52 |
| 6/24/09 | 8.47 |
| 6/24/09 | 8.48 |
| 6/24/09 | 8.42 |
| 6/24/09 | 8.46 |
| 6/24/09 | 8.43 |
| 6/24/09 | 8.39 |
| 6/24/09 | 8.41 |
| 6/24/09 | 8.3 |
| 6/24/09 | 8.38 |
| 6/24/09 | 8.37 |
| 6/24/09 | 8.38 |
| 6/24/09 | 8.36 |
| 6/24/09 | 8.38 |
| 6/24/09 | 8.36 |
| 6/24/09 | 8.35 |
| 6/24/09 | 8.34 |
| 6/24/09 | 8.32 |
| 6/24/09 | 8.29 |
| 6/24/09 | 8.32 |
| 6/24/09 | 8.33 |
| 6/24/09 | 8.35 |
| 6/24/09 | 8.34 |
| 6/24/09 | 8.36 |
| 6/24/09 | 8.35 |
| 6/24/09 | 8.33 |
| 6/24/09 | 8.37 |
| 6/24/09 | 8.36 |
| 6/24/09 | 8.4 |
| 6/24/09 | 8.4 |
| 6/24/09 | 8.33 |
| 6/24/09 | 8.34 |
| 6/24/09 | 8.34 |
| 6/24/09 | 8.4 |
| 6/24/09 | 8.42 |
| 6/23/09 | 8.42 |
| 6/23/09 | 8.39 |
| 6/23/09 | 8.42 |
| 6/23/09 | 8.42 |
| 6/23/09 | 8.44 |
| 6/23/09 | 8.49 |
| 6/23/09 | 8.53 |
| 6/23/09 | 8.52 |
| 6/23/09 | 8.5 |
| 6/23/09 | 8.48 |
| 6/23/09 | 8.49 |
| 6/23/09 | 8.49 |
| 6/23/09 | 8.5 |
| 6/23/09 | 8.51 |
| 6/23/09 | 8.52 |
| 6/23/09 | 8.46 |
| 6/23/09 | 8.5 |
| 6/23/09 | 8.52 |
| 6/23/09 | 8.47 |
| 6/23/09 | 8.5 |
| 6/23/09 | 8.47 |
| 6/23/09 | 8.47 |
| 6/23/09 | 8.46 |
| 6/23/09 | 8.46 |
| 6/23/09 | 8.45 |
| 6/23/09 | 8.45 |
| 6/23/09 | 8.41 |
| 6/23/09 | 8.4 |
| 6/23/09 | 8.41 |
| 6/23/09 | 8.4 |
| 6/23/09 | 8.35 |
| 6/23/09 | 8.34 |
| 6/23/09 | 8.34 |
| 6/23/09 | 8.35 |
| 6/23/09 | 8.38 |
| 6/23/09 | 8.37 |
| 6/23/09 | 8.36 |
| 6/23/09 | 8.37 |
| 6/23/09 | 8.34 |
| 6/23/09 | 8.37 |
| 6/23/09 | 8.33 |
| 6/23/09 | 8.35 |
| 6/23/09 | 8.4 |
| 6/23/09 | 8.36 |
| 6/23/09 | 8.39 |
| 6/23/09 | 8.39 |
| 6/23/09 | 8.4 |
| 6/23/09 | 8.42 |
| 6/22/09 | 8.45 |
| 6/22/09 | 8.41 |
| 6/22/09 | 8.47 |
| 6/22/09 | 8.47 |
| 6/22/09 | 8.49 |
| 6/22/09 | 8.49 |
| 6/22/09 | 8.52 |
| 6/22/09 | 8.53 |
| 6/22/09 | 8.52 |
| 6/22/09 | 8.43 |
| 6/22/09 | 8.43 |
| 6/22/09 | 8.46 |
| 6/22/09 | 8.46 |
| 6/22/09 | 8.44 |
| 6/22/09 | 8.46 |
| 6/22/09 | 8.43 |
| 6/22/09 | 8.46 |
| 6/22/09 | 8.41 |
| 6/22/09 | 8.32 |
| 6/22/09 | 8.37 |
| 6/22/09 | 8.41 |
| 6/22/09 | 8.42 |
| 6/22/09 | 8.39 |
| 6/22/09 | 8.37 |
| 6/22/09 | 8.31 |
| 6/22/09 | 8.21 |
| 6/22/09 | 8.24 |
| 6/22/09 | 8.24 |
| 6/22/09 | 8.27 |
| 6/22/09 | 8.28 |
| 6/22/09 | 8.26 |
| 6/22/09 | 8.24 |
| 6/22/09 | 8.25 |
| 6/22/09 | 8.27 |
| 6/22/09 | 8.26 |
| 6/22/09 | 8.3 |
| 6/22/09 | 8.31 |
| 6/22/09 | 8.31 |
| 6/22/09 | 8.31 |
| 6/22/09 | 8.37 |
| 6/22/09 | 8.34 |
| 6/22/09 | 8.37 |
| 6/22/09 | 8.36 |
| 6/22/09 | 8.39 |
| 6/22/09 | 8.4 |
| 6/22/09 | 8.38 |
| 6/22/09 | 8.37 |
| 6/22/09 | 8.34 |
| 6/21/09 | 8.34 |
| 6/21/09 | 8.38 |
| 6/21/09 | 8.37 |
| 6/21/09 | 8.35 |
| 6/21/09 | 8.43 |
| 6/21/09 | 8.43 |
| 6/21/09 | 8.41 |
| 6/21/09 | 8.41 |
| 6/21/09 | 8.4 |
| 6/21/09 | 8.42 |
| 6/21/09 | 8.42 |
| 6/21/09 | 8.39 |
| 6/21/09 | 8.41 |
| 6/21/09 | 8.37 |
| 6/21/09 | 8.32 |
| 6/21/09 | 8.28 |
| 6/21/09 | 8.35 |
| 6/21/09 | 8.38 |
| 6/21/09 | 8.34 |
| 6/21/09 | 8.33 |
| 6/21/09 | 8.32 |
| 6/21/09 | 8.29 |
| 6/21/09 | 8.32 |
| 6/21/09 | 8.32 |
| 6/21/09 | 8.29 |
| 6/21/09 | 8.23 |
| 6/21/09 | 8.21 |
| 6/21/09 | 8.24 |
| 6/21/09 | 8.23 |
| 6/21/09 | 8.22 |
| 6/21/09 | 8.2 |
| 6/21/09 | 8.22 |
| 6/21/09 | 8.21 |
| 6/21/09 | 8.24 |
| 6/21/09 | 8.22 |
| 6/21/09 | 8.24 |
| 6/21/09 | 8.22 |
| 6/21/09 | 8.24 |
| 6/21/09 | 8.29 |
| 6/21/09 | 8.3 |
| 6/21/09 | 8.26 |
| 6/21/09 | 8.26 |
| 6/21/09 | 8.26 |
| 6/21/09 | 8.27 |
| 6/21/09 | 8.28 |
| 6/21/09 | 8.3 |
| 6/21/09 | 8.31 |
| 6/21/09 | 8.29 |
| 6/20/09 | 8.3 |
| 6/20/09 | 8.32 |
| 6/20/09 | 8.32 |
| 6/20/09 | 8.29 |
| 6/20/09 | 8.32 |
| 6/20/09 | 8.33 |
| 6/20/09 | 8.35 |
| 6/20/09 | 8.3 |
| 6/20/09 | 8.29 |
| 6/20/09 | 8.22 |
| 6/20/09 | 8.24 |
| 6/20/09 | 8.22 |
| 6/20/09 | 8.14 |
| 6/20/09 | 8.2 |
| 6/20/09 | 8.26 |
| 6/20/09 | 8.22 |
| 6/20/09 | 8.17 |
| 6/20/09 | 8.25 |
| 6/20/09 | 8.23 |
| 6/20/09 | 8.25 |
| 6/20/09 | 8.16 |
| 6/20/09 | 8.17 |
| 6/20/09 | 8.17 |
| 6/20/09 | 8.17 |
| 6/20/09 | 8.19 |
| 6/20/09 | 8.2 |
| 6/20/09 | 8.19 |
| 6/20/09 | 8.2 |
| 6/20/09 | 8.17 |
| 6/20/09 | 8.16 |
| 6/20/09 | 8.14 |
| 6/20/09 | 8.1 |
| 6/20/09 | 8.1 |
| 6/20/09 | 8.14 |
| 6/20/09 | 8.16 |
| 6/20/09 | 8.15 |
| 6/20/09 | 8.19 |
| 6/20/09 | 8.09 |
| 6/20/09 | 8.1 |
| 6/20/09 | 8.13 |
| 6/20/09 | 8.16 |
| 6/20/09 | 8.15 |
| 6/20/09 | 8.16 |
| 6/20/09 | 8.16 |
| 6/20/09 | 8.17 |
| 6/20/09 | 8.08 |
| 6/20/09 | 8.09 |
| 6/20/09 | 8.06 |
| 6/19/09 | 8.06 |
| 6/19/09 | 8.09 |
| 6/19/09 | 8.07 |
| 6/19/09 | 8.09 |
| 6/19/09 | 8.06 |
| 6/19/09 | 8.07 |
| 6/19/09 | 8.13 |
| 6/19/09 | 8.12 |
| 6/19/09 | 8.13 |
| 6/19/09 | 8.08 |
| 6/19/09 | 8.08 |
| 6/19/09 | 8.11 |
| 6/19/09 | 8.13 |
| 6/19/09 | 8.12 |
| 6/19/09 | 8.11 |
| 6/19/09 | 8.03 |
| 6/19/09 | 8.04 |
| 6/19/09 | 8.05 |
| 6/19/09 | 8.03 |
| 6/19/09 | 8.03 |
| 6/19/09 | 8.05 |
| 6/19/09 | 8 |
| 6/19/09 | 8.01 |
| 6/19/09 | 8.02 |
| 6/19/09 | 7.98 |
| 6/19/09 | 7.96 |
| 6/19/09 | 7.97 |
| 6/19/09 | 7.96 |
| 6/19/09 | 7.97 |
| 6/19/09 | 7.98 |
| 6/19/09 | 7.97 |
| 6/19/09 | 7.98 |
| 6/19/09 | 7.98 |
| 6/19/09 | 8 |
| 6/19/09 | 8 |
| 6/19/09 | 8.01 |
| 6/19/09 | 8.02 |
| 6/19/09 | 8.02 |
| 6/19/09 | 8.05 |
| 6/19/09 | 8.07 |
| 6/19/09 | 8.08 |
| 6/19/09 | 8.09 |
| 6/19/09 | 8.11 |
| 6/19/09 | 8.14 |
| 6/19/09 | 8.14 |
| 6/19/09 | 8.15 |
| 6/19/09 | 8.16 |
| 6/19/09 | 8.14 |
| 6/18/09 | 8.12 |
| 6/18/09 | 8.16 |
| 6/18/09 | 8.19 |
| 6/18/09 | 8.19 |
| 6/18/09 | 8.21 |
| 6/18/09 | 8.22 |
| 6/18/09 | 8.21 |
| 6/18/09 | 8.21 |
| 6/18/09 | 8.21 |
| 6/18/09 | 8.14 |
| 6/18/09 | 8.15 |
| 6/18/09 | 8.1 |
| 6/18/09 | 7.96 |
| 6/18/09 | 8.08 |
| 6/18/09 | 8.05 |
| 6/18/09 | 8.04 |
| 6/18/09 | 8.04 |
| 6/18/09 | 8.09 |
| 6/18/09 | 8.1 |
| 6/18/09 | 8.14 |
| 6/18/09 | 8.14 |
| 6/18/09 | 8.12 |
| 6/18/09 | 8.13 |
| 6/18/09 | 8.12 |
| 6/18/09 | 8.12 |
| 6/18/09 | 8.11 |
| 6/18/09 | 8.1 |
| 6/18/09 | 8.1 |
| 6/18/09 | 8.06 |
| 6/18/09 | 8.08 |
| 6/18/09 | 8.07 |
| 6/18/09 | 8.09 |
| 6/18/09 | 8.09 |
| 6/18/09 | 8.09 |
| 6/18/09 | 8.08 |
| 6/18/09 | 8.09 |
| 6/18/09 | 8.1 |
| 6/18/09 | 8.12 |
| 6/18/09 | 8.1 |
| 6/18/09 | 8.11 |
| 6/18/09 | 8.09 |
| 6/18/09 | 8.1 |
| 6/18/09 | 8.11 |
| 6/18/09 | 8.13 |
| 6/18/09 | 8.15 |
| 6/18/09 | 8.17 |
| 6/18/09 | 8.17 |
| 6/18/09 | 8.18 |
| 6/17/09 | 8.18 |
| 6/17/09 | 8.19 |
| 6/17/09 | 8.2 |
| 6/17/09 | 8.19 |
| 6/17/09 | 8.21 |
| 6/17/09 | 8.21 |
| 6/17/09 | 8.21 |
| 6/17/09 | 8.22 |
| 6/17/09 | 8.23 |
| 6/17/09 | 8.23 |
| 6/17/09 | 8.24 |
| 6/17/09 | 8.26 |
| 6/17/09 | 8.24 |
| 6/17/09 | 8.24 |
| 6/17/09 | 8.24 |
| 6/17/09 | 8.24 |
| 6/17/09 | 8.27 |
| 6/17/09 | 8.26 |
| 6/17/09 | 8.28 |
| 6/17/09 | 8.28 |
| 6/17/09 | 8.22 |
| 6/17/09 | 8.13 |
| 6/17/09 | 8.18 |
| 6/17/09 | 8.2 |
| 6/17/09 | 8.21 |
| 6/17/09 | 8.23 |
| 6/17/09 | 8.24 |
| 6/17/09 | 8.23 |
| 6/17/09 | 8.25 |
| 6/17/09 | 8.25 |
| 6/17/09 | 8.24 |
| 6/17/09 | 8.25 |
| 6/17/09 | 8.28 |
| 6/17/09 | 8.3 |
| 6/17/09 | 8.33 |
| 6/17/09 | 8.32 |
| 6/17/09 | 8.31 |
| 6/17/09 | 8.32 |
| 6/17/09 | 8.31 |
| 6/17/09 | 8.33 |
| 6/17/09 | 8.32 |
| 6/17/09 | 8.34 |
| 6/17/09 | 8.35 |
| 6/17/09 | 8.36 |
| 6/17/09 | 8.36 |
| 6/17/09 | 8.36 |
| 6/17/09 | 8.36 |
| 6/17/09 | 8.37 |
| 6/16/09 | 8.33 |
| 6/16/09 | 8.36 |
| 6/16/09 | 8.39 |
| 6/16/09 | 8.4 |
| 6/16/09 | 8.4 |
| 6/16/09 | 8.44 |
| 6/16/09 | 8.45 |
| 6/16/09 | 8.44 |
| 6/16/09 | 8.44 |
| 6/16/09 | 8.45 |
| 6/16/09 | 8.44 |
| 6/16/09 | 8.43 |
| 6/16/09 | 8.4 |
| 6/16/09 | 8.38 |
| 6/16/09 | 8.37 |
| 6/16/09 | 8.39 |
| 6/16/09 | 8.33 |
| 6/16/09 | 8.33 |
| 6/16/09 | 8.36 |
| 6/16/09 | 8.35 |
| 6/16/09 | 8.34 |
| 6/16/09 | 8.32 |
| 6/16/09 | 8.3 |
| 6/16/09 | 8.31 |
| 6/16/09 | 8.3 |
| 6/16/09 | 8.26 |
| 6/16/09 | 8.24 |
| 6/16/09 | 8.23 |
| 6/16/09 | 8.21 |
| 6/16/09 | 8.23 |
| 6/16/09 | 8.24 |
| 6/16/09 | 8.24 |
| 6/16/09 | 8.24 |
| 6/16/09 | 8.24 |
| 6/16/09 | 8.26 |
| 6/16/09 | 8.28 |
| 6/16/09 | 8.27 |
| 6/16/09 | 8.25 |
| 6/16/09 | 8.28 |
| 6/16/09 | 8.29 |
| 6/16/09 | 8.3 |
| 6/16/09 | 8.31 |
| 6/16/09 | 8.31 |
| 6/16/09 | 8.3 |
| 6/16/09 | 8.32 |
| 6/16/09 | 8.32 |
| 6/16/09 | 8.32 |
| 6/16/09 | 8.31 |
| 6/15/09 | 8.34 |
| 6/15/09 | 8.37 |
| 6/15/09 | 8.35 |
| 6/15/09 | 8.33 |
| 6/15/09 | 8.28 |
| 6/15/09 | 8.29 |
| 6/15/09 | 8.26 |
| 6/15/09 | 8.27 |
| 6/15/09 | 8.29 |
| 6/15/09 | 8.29 |
| 6/15/09 | 8.28 |
| 6/15/09 | 8.31 |
| 6/15/09 | 8.26 |
| 6/15/09 | 8.22 |
| 6/15/09 | 8.27 |
| 6/15/09 | 8.24 |
| 6/15/09 | 8.24 |
| 6/15/09 | 8.2 |
| 6/15/09 | 8.23 |
| 6/15/09 | 8.22 |
| 6/15/09 | 8.21 |
| 6/15/09 | 8.24 |
| 6/15/09 | 8.23 |
| 6/15/09 | 8.24 |
| 6/15/09 | 8.17 |
| 6/15/09 | 8.2 |
| 6/15/09 | 8.2 |
| 6/15/09 | 8.16 |
| 6/15/09 | 8.15 |
| 6/15/09 | 8.18 |
| 6/15/09 | 8.17 |
| 6/15/09 | 8.17 |
| 6/15/09 | 8.11 |
| 6/15/09 | 8.17 |
| 6/15/09 | 8.17 |
| 6/15/09 | 8.19 |
| 6/15/09 | 8.2 |
| 6/15/09 | 8.2 |
| 6/15/09 | 8.21 |
| 6/15/09 | 8.21 |
| 6/15/09 | 8.21 |
| 6/15/09 | 8.2 |
| 6/15/09 | 8.2 |
| 6/15/09 | 8.21 |
| 6/15/09 | 8.22 |
| 6/15/09 | 8.21 |
| 6/15/09 | 8.2 |
| 6/15/09 | 8.22 |
| 6/14/09 | 8.17 |
| 6/14/09 | 8.2 |
| 6/14/09 | 8.21 |
| 6/14/09 | 8.25 |
| 6/14/09 | 8.21 |
| 6/14/09 | 8.25 |
| 6/14/09 | 8.27 |
| 6/14/09 | 8.26 |
| 6/14/09 | 8.27 |
| 6/14/09 | 8.19 |
| 6/14/09 | 8.19 |
| 6/14/09 | 8.18 |
| 6/14/09 | 8.2 |
| 6/14/09 | 8.19 |
| 6/14/09 | 8.17 |
| 6/14/09 | 7.92 |
| 6/14/09 | 8.12 |
| 6/14/09 | 8.1 |
| 6/14/09 | 8.06 |
| 6/14/09 | 8.04 |
| 6/14/09 | 8.05 |
| 6/14/09 | 8.04 |
| 6/14/09 | 8.06 |
| 6/14/09 | 8.04 |
| 6/14/09 | 8 |
| 6/14/09 | 8 |
| 6/14/09 | 7.94 |
| 6/14/09 | 7.96 |
| 6/14/09 | 7.98 |
| 6/14/09 | 8 |
| 6/14/09 | 8 |
| 6/14/09 | 8.02 |
| 6/14/09 | 8.04 |
| 6/14/09 | 8.04 |
| 6/14/09 | 8.07 |
| 6/14/09 | 8.09 |
| 6/14/09 | 8.09 |
| 6/14/09 | 8.1 |
| 6/14/09 | 8.11 |
| 6/14/09 | 8.12 |
| 6/14/09 | 8.14 |
| 6/14/09 | 8.16 |
| 6/14/09 | 8.13 |
| 6/14/09 | 8.16 |
| 6/14/09 | 8.17 |
| 6/14/09 | 8.18 |
| 6/14/09 | 8.19 |
| 6/14/09 | 8.15 |
| 6/13/09 | 8.19 |
| 6/13/09 | 8.18 |
| 6/13/09 | 8.2 |
| 6/13/09 | 8.21 |
| 6/13/09 | 8.18 |
| 6/13/09 | 8.17 |
| 6/13/09 | 8.17 |
| 6/13/09 | 8.18 |
| 6/13/09 | 8.2 |
| 6/13/09 | 8.19 |
| 6/13/09 | 8.18 |
| 6/13/09 | 8.2 |
| 6/13/09 | 8.17 |
| 6/13/09 | 8.11 |
| 6/13/09 | 8.1 |
| 6/13/09 | 8.11 |
| 6/13/09 | 8.13 |
| 6/13/09 | 8.08 |
| 6/13/09 | 8.07 |
| 6/13/09 | 8.08 |
| 6/13/09 | 8.09 |
| 6/13/09 | 8.06 |
| 6/13/09 | 8.06 |
| 6/13/09 | 7.97 |
| 6/13/09 | 7.92 |
| 6/13/09 | 7.99 |
| 6/13/09 | 7.95 |
| 6/13/09 | 7.94 |
| 6/13/09 | 7.98 |
| 6/13/09 | 7.98 |
| 6/13/09 | 8.01 |
| 6/13/09 | 8.02 |
| 6/13/09 | 8.02 |
| 6/13/09 | 8.02 |
| 6/13/09 | 8.04 |
| 6/13/09 | 8.06 |
| 6/13/09 | 8.08 |
| 6/13/09 | 8.09 |
| 6/13/09 | 8.11 |
| 6/13/09 | 8.12 |
| 6/13/09 | 8.13 |
| 6/13/09 | 8.13 |
| 6/13/09 | 8.12 |
| 6/13/09 | 8.13 |
| 6/13/09 | 8.15 |
| 6/13/09 | 8.16 |
| 6/13/09 | 8.16 |
| 6/13/09 | 8.17 |
| 6/12/09 | 8.19 |
| 6/12/09 | 8.2 |
| 6/12/09 | 8.22 |
| 6/12/09 | 8.23 |
| 6/12/09 | 8.23 |
| 6/12/09 | 8.24 |
| 6/12/09 | 8.27 |
| 6/12/09 | 8.27 |
| 6/12/09 | 8.29 |
| 6/12/09 | 8.29 |
| 6/12/09 | 8.25 |
| 6/12/09 | 8.25 |
| 6/12/09 | 8.26 |
| 6/12/09 | 8.25 |
| 6/12/09 | 8.25 |
| 6/12/09 | 8.21 |
| 6/12/09 | 8.18 |
| 6/12/09 | 8.18 |
| 6/12/09 | 8.2 |
| 6/12/09 | 8.18 |
| 6/12/09 | 8.18 |
| 6/12/09 | 8.18 |
| 6/12/09 | 8.19 |
| 6/12/09 | 8.18 |
| 6/12/09 | 8.18 |
| 6/12/09 | 8.18 |
| 6/12/09 | 8.18 |
| 6/12/09 | 8.2 |
| 6/12/09 | 8.2 |
| 6/12/09 | 8.19 |
| 6/12/09 | 8.21 |
| 6/12/09 | 8.22 |
| 6/12/09 | 8.21 |
| 6/12/09 | 8.22 |
| 6/12/09 | 8.23 |
| 6/12/09 | 8.23 |
| 6/12/09 | 8.23 |
| 6/12/09 | 8.22 |
| 6/12/09 | 8.22 |
| 6/12/09 | 8.23 |
| 6/12/09 | 8.24 |
| 6/12/09 | 8.25 |
| 6/12/09 | 8.26 |
| 6/12/09 | 8.27 |
| 6/12/09 | 8.26 |
| 6/12/09 | 8.27 |
| 6/12/09 | 8.26 |
| 6/12/09 | 8.29 |
| 6/11/09 | 8.29 |
| 6/11/09 | 8.3 |
| 6/11/09 | 8.3 |
| 6/11/09 | 8.31 |
| 6/11/09 | 8.33 |
| 6/11/09 | 8.34 |
| 6/11/09 | 8.33 |
| 6/11/09 | 8.33 |
| 6/11/09 | 8.34 |
| 6/11/09 | 8.33 |
| 6/11/09 | 8.35 |
| 6/11/09 | 8.33 |
| 6/11/09 | 8.33 |
| 6/11/09 | 8.33 |
| 6/11/09 | 8.34 |
| 6/11/09 | 8.33 |
| 6/11/09 | 8.32 |
| 6/11/09 | 8.32 |
| 6/11/09 | 8.29 |
| 6/11/09 | 8.26 |
| 6/11/09 | 8.26 |
| 6/11/09 | 8.24 |
| 6/11/09 | 8.24 |
| 6/11/09 | 8.25 |
| 6/11/09 | 8.26 |
| 6/11/09 | 8.26 |
| 6/11/09 | 8.26 |
| 6/11/09 | 8.27 |
| 6/11/09 | 8.25 |
| 6/11/09 | 8.27 |
| 6/11/09 | 8.27 |
| 6/11/09 | 8.27 |
| 6/11/09 | 8.26 |
| 6/11/09 | 8.25 |
| 6/11/09 | 8.26 |
| 6/11/09 | 8.25 |
| 6/11/09 | 8.26 |
| 6/11/09 | 8.27 |
| 6/11/09 | 8.28 |
| 6/11/09 | 8.29 |
| 6/11/09 | 8.3 |
| 6/11/09 | 8.31 |
| 6/11/09 | 8.32 |
| 6/11/09 | 8.33 |
| 6/11/09 | 8.32 |
| 6/11/09 | 8.33 |
| 6/11/09 | 8.33 |
| 6/11/09 | 8.33 |
| 6/10/09 | 8.35 |
| 6/10/09 | 8.35 |
| 6/10/09 | 8.31 |
| 6/10/09 | 8.3 |
| 6/10/09 | 8.27 |
| 6/10/09 | 8.27 |
| 6/10/09 | 8.28 |
| 6/10/09 | 8.28 |
| 6/10/09 | 8.29 |
| 6/10/09 | 8.3 |
| 6/10/09 | 8.29 |
| 6/10/09 | 8.31 |
| 6/10/09 | 8.27 |
| 6/10/09 | 8.31 |
| 6/10/09 | 8.31 |
| 6/10/09 | 8.29 |
| 6/10/09 | 8.27 |
| 6/10/09 | 8.27 |
| 6/10/09 | 8.27 |
| 6/10/09 | 8.25 |
| 6/10/09 | 8.24 |
| 6/10/09 | 8.24 |
| 6/10/09 | 8.2 |
| 6/10/09 | 8.18 |
| 6/10/09 | 8.25 |
| 6/10/09 | 8.28 |
| 6/10/09 | 8.27 |
| 6/10/09 | 8.26 |
| 6/10/09 | 8.27 |
| 6/10/09 | 8.27 |
| 6/10/09 | 8.27 |
| 6/10/09 | 8.27 |
| 6/10/09 | 8.27 |
| 6/10/09 | 8.28 |
| 6/10/09 | 8.27 |
| 6/10/09 | 8.27 |
| 6/10/09 | 8.28 |
| 6/10/09 | 8.27 |
| 6/10/09 | 8.27 |
| 6/10/09 | 8.28 |
| 6/10/09 | 8.26 |
| 6/10/09 | 8.28 |
| 6/10/09 | 8.29 |
| 6/10/09 | 8.3 |
| 6/10/09 | 8.3 |
| 6/10/09 | 8.3 |
| 6/10/09 | 8.31 |
| 6/10/09 | 8.31 |
| 6/9/09 | 8.31 |
| 6/9/09 | 8.32 |
| 6/9/09 | 8.28 |
| 6/9/09 | 8.24 |
| 6/9/09 | 8.23 |
| 6/9/09 | 8.29 |
| 6/9/09 | 8.28 |
| 6/9/09 | 8.23 |
| 6/9/09 | 8.26 |
| 6/9/09 | 8.26 |
| 6/9/09 | 8.29 |
| 6/9/09 | 8.29 |
| 6/9/09 | 8.29 |
| 6/9/09 | 8.3 |
| 6/9/09 | 8.3 |
| 6/9/09 | 8.26 |
| 6/9/09 | 8.26 |
| 6/9/09 | 8.22 |
| 6/9/09 | 8.22 |
| 6/9/09 | 8.24 |
| 6/9/09 | 8.25 |
| 6/9/09 | 8.25 |
| 6/9/09 | 8.23 |
| 6/9/09 | 8.23 |
| 6/9/09 | 8.21 |
| 6/9/09 | 8.2 |
| 6/9/09 | 8.19 |
| 6/9/09 | 8.2 |
| 6/9/09 | 8.22 |
| 6/9/09 | 8.25 |
| 6/9/09 | 8.24 |
| 6/9/09 | 8.22 |
| 6/9/09 | 8.23 |
| 6/9/09 | 8.24 |
| 6/9/09 | 8.23 |
| 6/9/09 | 8.22 |
| 6/9/09 | 8.25 |
| 6/9/09 | 8.24 |
| 6/9/09 | 8.25 |
| 6/9/09 | 8.23 |
| 6/9/09 | 8.25 |
| 6/9/09 | 8.23 |
| 6/9/09 | 8.26 |
| 6/9/09 | 8.21 |
| 6/9/09 | 8.21 |
| 6/9/09 | 8.21 |
| 6/9/09 | 8.21 |
| 6/9/09 | 8.22 |
| 6/8/09 | 8.21 |
| 6/8/09 | 8.22 |
| 6/8/09 | 8.21 |
| 6/8/09 | 8.25 |
| 6/8/09 | 8.28 |
| 6/8/09 | 8.26 |
| 6/8/09 | 8.28 |
| 6/8/09 | 8.28 |
| 6/8/09 | 7.95 |
| 6/8/09 | 8.16 |
| 6/8/09 | 8.19 |
| 6/8/09 | 8.21 |
| 6/8/09 | 8.2 |
| 6/8/09 | 8.18 |
| 6/8/09 | 8.24 |
| 6/8/09 | 8.25 |
| 6/8/09 | 8.2 |
| 6/8/09 | 8.23 |
| 6/8/09 | 8.22 |
| 6/8/09 | 8.21 |
| 6/8/09 | 8.24 |
| 6/8/09 | 8.21 |
| 6/8/09 | 8.14 |
| 6/8/09 | 8.15 |
| 6/8/09 | 8.15 |
| 6/8/09 | 8.15 |
| 6/8/09 | 8.17 |
| 6/8/09 | 8.15 |
| 6/8/09 | 8.17 |
| 6/8/09 | 8.17 |
| 6/8/09 | 8.19 |
| 6/8/09 | 8.18 |
| 6/8/09 | 8.19 |
| 6/8/09 | 8.2 |
| 6/8/09 | 8.19 |
| 6/8/09 | 8.19 |
| 6/8/09 | 8.18 |
| 6/8/09 | 8.16 |
| 6/8/09 | 8.16 |
| 6/8/09 | 8.16 |
| 6/8/09 | 8.15 |
| 6/8/09 | 8.17 |
| 6/8/09 | 8.17 |
| 6/8/09 | 8.17 |
| 6/8/09 | 8.14 |
| 6/8/09 | 8.16 |
| 6/8/09 | 8.17 |
| 6/8/09 | 8.17 |
| 6/7/09 | 8.18 |
| 6/7/09 | 8.23 |
| 6/7/09 | 8.25 |
| 6/7/09 | 8.24 |
| 6/7/09 | 8.25 |
| 6/7/09 | 8.27 |
| 6/7/09 | 8.19 |
| 6/7/09 | 8.19 |
| 6/7/09 | 8.22 |
| 6/7/09 | 8.17 |
| 6/7/09 | 8.23 |
| 6/7/09 | 8.23 |
| 6/7/09 | 8.25 |
| 6/7/09 | 8.2 |
| 6/7/09 | 8.21 |
| 6/7/09 | 8.18 |
| 6/7/09 | 8.11 |
| 6/7/09 | 8.14 |
| 6/7/09 | 8.14 |
| 6/7/09 | 8.14 |
| 6/7/09 | 8.13 |
| 6/7/09 | 8.15 |
| 6/7/09 | 8.15 |
| 6/7/09 | 8.11 |
| 6/7/09 | 8.1 |
| 6/7/09 | 8.09 |
| 6/7/09 | 8.12 |
| 6/7/09 | 8.15 |
| 6/7/09 | 8.15 |
| 6/7/09 | 8.15 |
| 6/7/09 | 8.13 |
| 6/7/09 | 8.12 |
| 6/7/09 | 8.14 |
| 6/7/09 | 8.14 |
| 6/7/09 | 8.13 |
| 6/7/09 | 8.13 |
| 6/7/09 | 8.13 |
| 6/7/09 | 8.14 |
| 6/7/09 | 8.13 |
| 6/7/09 | 8.13 |
| 6/7/09 | 8.14 |
| 6/7/09 | 8.16 |
| 6/7/09 | 8.13 |
| 6/7/09 | 8.08 |
| 6/7/09 | 8.09 |
| 6/7/09 | 8.1 |
| 6/7/09 | 8.09 |
| 6/7/09 | 8.09 |
| 6/6/09 | 8.09 |
| 6/6/09 | 8.11 |
| 6/6/09 | 8.13 |
| 6/6/09 | 8.12 |
| 6/6/09 | 8.11 |
| 6/6/09 | 8.13 |
| 6/6/09 | 8.11 |
| 6/6/09 | 8.12 |
| 6/6/09 | 8.06 |
| 6/6/09 | 8.08 |
| 6/6/09 | 8.08 |
| 6/6/09 | 8.07 |
| 6/6/09 | 8.12 |
| 6/6/09 | 8.13 |
| 6/6/09 | 8.12 |
| 6/6/09 | 8.08 |
| 6/6/09 | 8.08 |
| 6/6/09 | 8.06 |
| 6/6/09 | 8.06 |
| 6/6/09 | 8.07 |
| 6/6/09 | 8.03 |
| 6/6/09 | 8.02 |
| 6/6/09 | 8.02 |
| 6/6/09 | 8.02 |
| 6/6/09 | 7.99 |
| 6/6/09 | 7.98 |
| 6/6/09 | 7.97 |
| 6/6/09 | 7.97 |
| 6/6/09 | 7.99 |
| 6/6/09 | 7.99 |
| 6/6/09 | 7.99 |
| 6/6/09 | 8 |
| 6/6/09 | 8.01 |
| 6/6/09 | 8.01 |
| 6/6/09 | 8.01 |
| 6/6/09 | 8.02 |
| 6/6/09 | 8.02 |
| 6/6/09 | 8.02 |
| 6/6/09 | 8.02 |
| 6/6/09 | 8.03 |
| 6/6/09 | 8.02 |
| 6/6/09 | 8.04 |
| 6/6/09 | 8.04 |
| 6/6/09 | 8.05 |
| 6/6/09 | 8.04 |
| 6/6/09 | 8.05 |
| 6/6/09 | 8.05 |
| 6/6/09 | 8.06 |
| 6/5/09 | 8.06 |
| 6/5/09 | 8.08 |
| 6/5/09 | 8.08 |
| 6/5/09 | 8.1 |
| 6/5/09 | 8.11 |
| 6/5/09 | 8.11 |
| 6/5/09 | 8.1 |
| 6/5/09 | 8.12 |
| 6/5/09 | 8.13 |
| 6/5/09 | 8.13 |
| 6/5/09 | 8.14 |
| 6/5/09 | 8.13 |
| 6/5/09 | 8.14 |
| 6/5/09 | 8.15 |
| 6/5/09 | 8.1 |
| 6/5/09 | 8.14 |
| 6/5/09 | 8.13 |
| 6/5/09 | 8.13 |
| 6/5/09 | 8.11 |
| 6/5/09 | 8.11 |
| 6/5/09 | 8.12 |
| 6/5/09 | 8.12 |
| 6/5/09 | 8.11 |
| 6/5/09 | 8.11 |
| 6/5/09 | 8.11 |
| 6/5/09 | 8.11 |
| 6/5/09 | 8.1 |
| 6/5/09 | 8.07 |
| 6/5/09 | 8.08 |
| 6/5/09 | 8.09 |
| 6/5/09 | 8.11 |
| 6/5/09 | 8.1 |
| 6/5/09 | 8.15 |
| 6/5/09 | 8.15 |
| 6/5/09 | 8.18 |
| 6/5/09 | 8.18 |
| 6/5/09 | 8.18 |
| 6/5/09 | 8.18 |
| 6/5/09 | 8.18 |
| 6/5/09 | 8.18 |
| 6/5/09 | 8.18 |
| 6/5/09 | 8.19 |
| 6/5/09 | 8.19 |
| 6/5/09 | 8.2 |
| 6/5/09 | 8.18 |
| 6/5/09 | 8.21 |
| 6/5/09 | 8.17 |
| 6/5/09 | 8.2 |
| 6/4/09 | 8.21 |
| 6/4/09 | 8.21 |
| 6/4/09 | 8.22 |
| 6/4/09 | 8.22 |
| 6/4/09 | 8.23 |
| 6/4/09 | 8.23 |
| 6/4/09 | 8.13 |
| 6/4/09 | 8.25 |
| 6/4/09 | 8.19 |
| 6/4/09 | 8.22 |
| 6/4/09 | 8.23 |
| 6/4/09 | 8.22 |
| 6/4/09 | 8.17 |
| 6/4/09 | 8.17 |
| 6/4/09 | 8.2 |
| 6/4/09 | 8.2 |
| 6/4/09 | 8.2 |
| 6/4/09 | 8.16 |
| 6/4/09 | 8.18 |
| 6/4/09 | 8.17 |
| 6/4/09 | 8.16 |
| 6/4/09 | 8.13 |
| 6/4/09 | 8.1 |
| 6/4/09 | 8.14 |
| 6/4/09 | 8.08 |
| 6/4/09 | 8.06 |
| 6/4/09 | 8.07 |
| 6/4/09 | 8.08 |
| 6/4/09 | 8.1 |
| 6/4/09 | 8.11 |
| 6/4/09 | 8.13 |
| 6/4/09 | 8.12 |
| 6/4/09 | 8.13 |
| 6/4/09 | 8.16 |
| 6/4/09 | 8.16 |
| 6/4/09 | 8.15 |
| 6/4/09 | 8.15 |
| 6/4/09 | 8.14 |
| 6/4/09 | 8.15 |
| 6/4/09 | 8.15 |
| 6/4/09 | 8.18 |
| 6/4/09 | 8.17 |
| 6/4/09 | 8.19 |
| 6/4/09 | 8.19 |
| 6/4/09 | 8.19 |
| 6/4/09 | 8.19 |
| 6/4/09 | 8.2 |
| 6/4/09 | 8.15 |
| 6/3/09 | 8.15 |
| 6/3/09 | 8.09 |
| 6/3/09 | 8.17 |
| 6/3/09 | 8.16 |
| 6/3/09 | 8.16 |
| 6/3/09 | 8.2 |
| 6/3/09 | 8.23 |
| 6/3/09 | 8.22 |
| 6/3/09 | 8.24 |
| 6/3/09 | 8.25 |
| 6/3/09 | 8.27 |
| 6/3/09 | 8.28 |
| 6/3/09 | 8.28 |
| 6/3/09 | 8.28 |
| 6/3/09 | 8.29 |
| 6/3/09 | 8.3 |
| 6/3/09 | 8.29 |
| 6/3/09 | 8.29 |
| 6/3/09 | 8.29 |
| 6/3/09 | 8.3 |
| 6/3/09 | 8.31 |
| 6/3/09 | 8.3 |
| 6/3/09 | 8.32 |
| 6/3/09 | 8.31 |
| 6/3/09 | 8.27 |
| 6/3/09 | 8.29 |
| 6/3/09 | 8.28 |
| 6/3/09 | 8.25 |
| 6/3/09 | 8.26 |
| 6/3/09 | 8.32 |
| 6/3/09 | 8.31 |
| 6/3/09 | 8.31 |
| 6/3/09 | 8.3 |
| 6/3/09 | 8.3 |
| 6/3/09 | 8.3 |
| 6/3/09 | 8.33 |
| 6/3/09 | 8.3 |
| 6/3/09 | 8.31 |
| 6/3/09 | 8.31 |
| 6/3/09 | 8.31 |
| 6/3/09 | 8.33 |
| 6/3/09 | 8.31 |
| 6/3/09 | 8.31 |
| 6/3/09 | 8.31 |
| 6/3/09 | 8.3 |
| 6/3/09 | 8.3 |
| 6/3/09 | 8.3 |
| 6/3/09 | 8.28 |
| 6/2/09 | 8.29 |
| 6/2/09 | 8.33 |
| 6/2/09 | 8.23 |
| 6/2/09 | 8.29 |
| 6/2/09 | 8.35 |
| 6/2/09 | 8.31 |
| 6/2/09 | 8.32 |
| 6/2/09 | 8.27 |
| 6/2/09 | 8.33 |
| 6/2/09 | 8.33 |
| 6/2/09 | 8.24 |
| 6/2/09 | 8.3 |
| 6/2/09 | 8.26 |
| 6/2/09 | 8.23 |
| 6/2/09 | 8.24 |
| 6/2/09 | 8.25 |
| 6/2/09 | 8.25 |
| 6/2/09 | 8.26 |
| 6/2/09 | 8.29 |
| 6/2/09 | 8.31 |
| 6/2/09 | 8.3 |
| 6/2/09 | 8.29 |
| 6/2/09 | 8.28 |
| 6/2/09 | 8.28 |
| 6/2/09 | 8.29 |
| 6/2/09 | 8.28 |
| 6/2/09 | 8.28 |
| 6/2/09 | 8.25 |
| 6/2/09 | 8.26 |
| 6/2/09 | 8.25 |
| 6/2/09 | 8.23 |
| 6/2/09 | 8.26 |
| 6/2/09 | 8.25 |
| 6/2/09 | 8.26 |
| 6/2/09 | 8.26 |
| 6/2/09 | 8.26 |
| 6/2/09 | 8.25 |
| 6/2/09 | 8.29 |
| 6/2/09 | 8.3 |
| 6/2/09 | 8.29 |
| 6/2/09 | 8.3 |
| 6/2/09 | 8.31 |
| 6/2/09 | 8.32 |
| 6/2/09 | 8.33 |
| 6/2/09 | 8.32 |
| 6/2/09 | 8.31 |
| 6/2/09 | 8.32 |
| 6/2/09 | 8.31 |
| 6/1/09 | 8.31 |
| 6/1/09 | 8.32 |
| 6/1/09 | 8.3 |
| 6/1/09 | 8.35 |
| 6/1/09 | 8.27 |
| 6/1/09 | 8.27 |
| 6/1/09 | 8.35 |
| 6/1/09 | 8.29 |
| 6/1/09 | 8.3 |
| 6/1/09 | 8.32 |
| 6/1/09 | 8.35 |
| 6/1/09 | 8.33 |
| 6/1/09 | 8.33 |
| 6/1/09 | 8.35 |
| 6/1/09 | 8.3 |
| 6/1/09 | 8.3 |
| 6/1/09 | 8.3 |
| 6/1/09 | 8.31 |
| 6/1/09 | 8.3 |
| 6/1/09 | 8.29 |
| 6/1/09 | 8.3 |
| 6/1/09 | 8.28 |
| 6/1/09 | 8.28 |
| 6/1/09 | 8.24 |
| 6/1/09 | 8.21 |
| 6/1/09 | 8.22 |
| 6/1/09 | 8.22 |
| 6/1/09 | 8.22 |
| 6/1/09 | 8.25 |
| 6/1/09 | 8.24 |
| 6/1/09 | 8.24 |
| 6/1/09 | 8.25 |
| 6/1/09 | 8.26 |
| 6/1/09 | 8.26 |
| 6/1/09 | 8.24 |
| 6/1/09 | 8.26 |
| 6/1/09 | 8.28 |
| 6/1/09 | 8.28 |
| 6/1/09 | 8.28 |
| 6/1/09 | 8.28 |
| 6/1/09 | 8.28 |
| 6/1/09 | 8.29 |
| 6/1/09 | 8.29 |
| 6/1/09 | 8.28 |
| 6/1/09 | 8.28 |
| 6/1/09 | 8.29 |
| 6/1/09 | 8.29 |
| 6/1/09 | 8.29 |
| 5/31/09 | 8.3 |
| 5/31/09 | 8.3 |
| 5/31/09 | 8.32 |
| 5/31/09 | 8.33 |
| 5/31/09 | 8.34 |
| 5/31/09 | 8.34 |
| 5/31/09 | 8.35 |
| 5/31/09 | 8.36 |
| 5/31/09 | 8.36 |
| 5/31/09 | 8.36 |
| 5/31/09 | 8.34 |
| 5/31/09 | 8.34 |
| 5/31/09 | 8.32 |
| 5/31/09 | 8.34 |
| 5/31/09 | 8.32 |
| 5/31/09 | 8.33 |
| 5/31/09 | 8.27 |
| 5/31/09 | 8.27 |
| 5/31/09 | 8.29 |
| 5/31/09 | 8.29 |
| 5/31/09 | 8.27 |
| 5/31/09 | 8.3 |
| 5/31/09 | 8.26 |
| 5/31/09 | 8.25 |
| 5/31/09 | 8.23 |
| 5/31/09 | 8.22 |
| 5/31/09 | 8.22 |
| 5/31/09 | 8.21 |
| 5/31/09 | 8.2 |
| 5/31/09 | 8.21 |
| 5/31/09 | 8.21 |
| 5/31/09 | 8.19 |
| 5/31/09 | 8.19 |
| 5/31/09 | 8.19 |
| 5/31/09 | 8.2 |
| 5/31/09 | 8.22 |
| 5/31/09 | 8.22 |
| 5/31/09 | 8.24 |
| 5/31/09 | 8.26 |
| 5/31/09 | 8.26 |
| 5/31/09 | 8.28 |
| 5/31/09 | 8.28 |
| 5/31/09 | 8.29 |
| 5/31/09 | 8.3 |
| 5/31/09 | 8.3 |
| 5/31/09 | 8.3 |
| 5/31/09 | 8.31 |
| 5/31/09 | 8.3 |
| 5/30/09 | 8.31 |
| 5/30/09 | 8.32 |
| 5/30/09 | 8.32 |
| 5/30/09 | 8.31 |
| 5/30/09 | 8.33 |
| 5/30/09 | 8.34 |
| 5/30/09 | 8.35 |
| 5/30/09 | 8.36 |
| 5/30/09 | 8.37 |
| 5/30/09 | 8.35 |
| 5/30/09 | 8.27 |
| 5/30/09 | 8.3 |
| 5/30/09 | 8.29 |
| 5/30/09 | 8.3 |
| 5/30/09 | 8.32 |
| 5/30/09 | 8.31 |
| 5/30/09 | 8.32 |
| 5/30/09 | 8.31 |
| 5/30/09 | 8.3 |
| 5/30/09 | 8.29 |
| 5/30/09 | 8.3 |
| 5/30/09 | 8.29 |
| 5/30/09 | 8.28 |
| 5/30/09 | 8.29 |
| 5/30/09 | 8.27 |
| 5/30/09 | 8.25 |
| 5/30/09 | 8.24 |
| 5/30/09 | 8.25 |
| 5/30/09 | 8.26 |
| 5/30/09 | 8.25 |
| 5/30/09 | 8.24 |
| 5/30/09 | 8.24 |
| 5/30/09 | 8.26 |
| 5/30/09 | 8.25 |
| 5/30/09 | 8.27 |
| 5/30/09 | 8.27 |
| 5/30/09 | 8.29 |
| 5/30/09 | 8.29 |
| 5/30/09 | 8.3 |
| 5/30/09 | 8.3 |
| 5/30/09 | 8.3 |
| 5/30/09 | 8.3 |
| 5/30/09 | 8.3 |
| 5/30/09 | 8.31 |
| 5/30/09 | 8.32 |
| 5/30/09 | 8.32 |
| 5/30/09 | 8.33 |
| 5/30/09 | 8.34 |
| 5/29/09 | 8.34 |
| 5/29/09 | 8.34 |
| 5/29/09 | 8.35 |
| 5/29/09 | 8.36 |
| 5/29/09 | 8.37 |
| 5/29/09 | 8.38 |
| 5/29/09 | 8.37 |
| 5/29/09 | 8.37 |
| 5/29/09 | 8.38 |
| 5/29/09 | 8.36 |
| 5/29/09 | 8.36 |
| 5/29/09 | 8.37 |
| 5/29/09 | 8.36 |
| 5/29/09 | 8.36 |
| 5/29/09 | 8.36 |
| 5/29/09 | 8.35 |
| 5/29/09 | 8.35 |
| 5/29/09 | 8.35 |
| 5/29/09 | 8.36 |
| 5/29/09 | 8.36 |
| 5/29/09 | 8.37 |
| 5/29/09 | 8.37 |
| 5/29/09 | 8.38 |
| 5/29/09 | 8.38 |
| 5/29/09 | 8.36 |
| 5/29/09 | 8.36 |
| 5/29/09 | 8.35 |
| 5/29/09 | 8.35 |
| 5/29/09 | 8.34 |
| 5/29/09 | 8.34 |
| 5/29/09 | 8.34 |
| 5/29/09 | 8.33 |
| 5/29/09 | 8.35 |
| 5/29/09 | 8.34 |
| 5/29/09 | 8.34 |
| 5/29/09 | 8.35 |
| 5/29/09 | 8.35 |
| 5/29/09 | 8.35 |
| 5/29/09 | 8.3 |
| 5/29/09 | 8.32 |
| 5/29/09 | 8.32 |
| 5/29/09 | 8.31 |
| 5/29/09 | 8.29 |
| 5/29/09 | 8.31 |
| 5/29/09 | 8.3 |
| 5/29/09 | 8.33 |
| 5/29/09 | 8.34 |
| 5/29/09 | 8.31 |
| 5/28/09 | 8.32 |
| 5/28/09 | 8.29 |
| 5/28/09 | 8.33 |
| 5/28/09 | 8.34 |
| 5/28/09 | 8.35 |
| 5/28/09 | 8.35 |
| 5/28/09 | 8.37 |
| 5/28/09 | 8.4 |
| 5/28/09 | 8.39 |
| 5/28/09 | 8.39 |
| 5/28/09 | 8.36 |
| 5/28/09 | 8.35 |
| 5/28/09 | 8.36 |
| 5/28/09 | 8.35 |
| 5/28/09 | 8.34 |
| 5/28/09 | 8.34 |
| 5/28/09 | 8.35 |
| 5/28/09 | 8.36 |
| 5/28/09 | 8.37 |
| 5/28/09 | 8.35 |
| 5/28/09 | 8.37 |
| 5/28/09 | 8.32 |
| 5/28/09 | 8.31 |
| 5/28/09 | 8.32 |
| 5/28/09 | 8.34 |
| 5/28/09 | 8.34 |
| 5/28/09 | 8.34 |
| 5/28/09 | 8.34 |
| 5/28/09 | 8.34 |
| 5/28/09 | 8.34 |
| 5/28/09 | 8.34 |
| 5/28/09 | 8.33 |
| 5/28/09 | 8.32 |
| 5/28/09 | 8.33 |
| 5/28/09 | 8.31 |
| 5/28/09 | 8.33 |
| 5/28/09 | 8.33 |
| 5/28/09 | 8.32 |
| 5/28/09 | 8.33 |
| 5/28/09 | 8.32 |
| 5/28/09 | 8.33 |
| 5/28/09 | 8.36 |
| 5/28/09 | 8.36 |
| 5/28/09 | 8.37 |
| 5/28/09 | 8.37 |
| 5/28/09 | 8.36 |
| 5/28/09 | 8.36 |
| 5/28/09 | 8.33 |
| 5/27/09 | 8.36 |
| 5/27/09 | 8.36 |
| 5/27/09 | 8.37 |
| 5/27/09 | 8.39 |
| 5/27/09 | 8.39 |
| 5/27/09 | 8.38 |
| 5/27/09 | 8.41 |
| 5/27/09 | 8.38 |
| 5/27/09 | 8.41 |
| 5/27/09 | 8.41 |
| 5/27/09 | 8.4 |
| 5/27/09 | 8.4 |
| 5/27/09 | 8.39 |
| 5/27/09 | 8.42 |
| 5/27/09 | 8.36 |
| 5/27/09 | 8.35 |
| 5/27/09 | 8.38 |
| 5/27/09 | 8.38 |
| 5/27/09 | 8.38 |
| 5/27/09 | 8.38 |
| 5/27/09 | 8.37 |
| 5/27/09 | 8.37 |
| 5/27/09 | 8.36 |
| 5/27/09 | 8.33 |
| 5/27/09 | 8.35 |
| 5/27/09 | 8.35 |
| 5/27/09 | 8.36 |
| 5/27/09 | 8.42 |
| 5/27/09 | 8.4 |
| 5/27/09 | 8.4 |
| 5/27/09 | 8.44 |
| 5/27/09 | 8.43 |
| 5/27/09 | 8.44 |
| 5/27/09 | 8.43 |
| 5/27/09 | 8.44 |
| 5/27/09 | 8.42 |
| 5/27/09 | 8.43 |
| 5/27/09 | 8.43 |
| 5/27/09 | 8.43 |
| 5/27/09 | 8.46 |
| 5/27/09 | 8.39 |
| 5/27/09 | 8.47 |
| 5/27/09 | 8.45 |
| 5/27/09 | 8.47 |
| 5/27/09 | 8.47 |
| 5/27/09 | 8.48 |
| 5/27/09 | 8.49 |
| 5/26/09 | 8.5 |
| 5/26/09 | 8.51 |
| 5/26/09 | 8.51 |
| 5/26/09 | 8.51 |
| 5/26/09 | 8.52 |
| 5/26/09 | 8.5 |
| 5/26/09 | 8.54 |
| 5/26/09 | 8.55 |
| 5/26/09 | 8.55 |
| 5/26/09 | 8.55 |
| 5/26/09 | 8.56 |
| 5/26/09 | 8.56 |
| 5/26/09 | 8.55 |
| 5/26/09 | 8.56 |
| 5/26/09 | 8.55 |
| 5/26/09 | 8.54 |
| 5/26/09 | 8.53 |
| 5/26/09 | 8.53 |
| 5/26/09 | 8.53 |
| 5/26/09 | 8.53 |
| 5/26/09 | 8.54 |
| 5/26/09 | 8.53 |
| 5/26/09 | 8.54 |
| 5/26/09 | 8.54 |
| 5/26/09 | 8.55 |
| 5/26/09 | 8.55 |
| 5/26/09 | 8.55 |
| 5/26/09 | 8.56 |
| 5/26/09 | 8.55 |
| 5/26/09 | 8.54 |
| 5/26/09 | 8.55 |
| 5/26/09 | 8.56 |
| 5/26/09 | 8.57 |
| 5/26/09 | 8.58 |
| 5/26/09 | 8.58 |
| 5/26/09 | 8.58 |
| 5/26/09 | 8.57 |
| 5/26/09 | 8.58 |
| 5/26/09 | 8.58 |
| 5/26/09 | 8.59 |
| 5/26/09 | 8.58 |
| 5/26/09 | 8.59 |
| 5/26/09 | 8.59 |
| 5/26/09 | 8.59 |
| 5/26/09 | 8.59 |
| 5/26/09 | 8.58 |
| 5/26/09 | 8.57 |
| 5/26/09 | 8.59 |
| 5/25/09 | 8.57 |
| 5/25/09 | 8.55 |
| 5/25/09 | 8.53 |
| 5/25/09 | 8.53 |
| 5/25/09 | 8.53 |
| 5/25/09 | 8.53 |
| 5/25/09 | 8.56 |
| 5/25/09 | 8.48 |
| 5/25/09 | 8.51 |
| 5/25/09 | 8.52 |
| 5/25/09 | 8.59 |
| 5/25/09 | 8.61 |
| 5/25/09 | 8.61 |
| 5/25/09 | 8.62 |
| 5/25/09 | 8.59 |
| 5/25/09 | 8.53 |
| 5/25/09 | 8.58 |
| 5/25/09 | 8.6 |
| 5/25/09 | 8.59 |
| 5/25/09 | 8.59 |
| 5/25/09 | 8.56 |
| 5/25/09 | 8.6 |
| 5/25/09 | 8.59 |
| 5/25/09 | 8.56 |
| 5/25/09 | 8.58 |
| 5/25/09 | 8.57 |
| 5/25/09 | 8.49 |
| 5/25/09 | 8.51 |
| 5/25/09 | 8.53 |
| 5/25/09 | 8.57 |
| 5/25/09 | 8.52 |
| 5/25/09 | 8.53 |
| 5/25/09 | 8.53 |
| 5/25/09 | 8.53 |
| 5/25/09 | 8.55 |
| 5/25/09 | 8.52 |
| 5/25/09 | 8.54 |
| 5/25/09 | 8.53 |
| 5/25/09 | 8.54 |
| 5/25/09 | 8.53 |
| 5/25/09 | 8.51 |
| 5/25/09 | 8.51 |
| 5/25/09 | 8.52 |
| 5/25/09 | 8.5 |
| 5/25/09 | 8.5 |
| 5/25/09 | 8.46 |
| 5/25/09 | 8.46 |
| 5/25/09 | 8.48 |
| 5/24/09 | 8.5 |
| 5/24/09 | 8.54 |
| 5/24/09 | 8.54 |
| 5/24/09 | 8.56 |
| 5/24/09 | 8.56 |
| 5/24/09 | 8.63 |
| 5/24/09 | 8.47 |
| 5/24/09 | 8.5 |
| 5/24/09 | 8.49 |
| 5/24/09 | 8.52 |
| 5/24/09 | 8.55 |
| 5/24/09 | 8.6 |
| 5/24/09 | 8.61 |
| 5/24/09 | 8.61 |
| 5/24/09 | 8.63 |
| 5/24/09 | 8.57 |
| 5/24/09 | 8.63 |
| 5/24/09 | 8.6 |
| 5/24/09 | 8.59 |
| 5/24/09 | 8.62 |
| 5/24/09 | 8.61 |
| 5/24/09 | 8.57 |
| 5/24/09 | 8.54 |
| 5/24/09 | 8.56 |
| 5/24/09 | 8.54 |
| 5/24/09 | 8.52 |
| 5/24/09 | 8.59 |
| 5/24/09 | 8.53 |
| 5/24/09 | 8.54 |
| 5/24/09 | 8.47 |
| 5/24/09 | 8.53 |
| 5/24/09 | 8.55 |
| 5/24/09 | 8.54 |
| 5/24/09 | 8.53 |
| 5/24/09 | 8.54 |
| 5/24/09 | 8.56 |
| 5/24/09 | 8.54 |
| 5/24/09 | 8.55 |
| 5/24/09 | 8.56 |
| 5/24/09 | 8.55 |
| 5/24/09 | 8.55 |
| 5/24/09 | 8.53 |
| 5/24/09 | 8.45 |
| 5/24/09 | 8.36 |
| 5/24/09 | 8.39 |
| 5/24/09 | 8.41 |
| 5/24/09 | 8.38 |
| 5/24/09 | 8.36 |
| 5/23/09 | 8.35 |
| 5/23/09 | 8.35 |
| 5/23/09 | 8.37 |
| 5/23/09 | 8.36 |
| 5/23/09 | 8.37 |
| 5/23/09 | 8.41 |
| 5/23/09 | 8.46 |
| 5/23/09 | 8.48 |
| 5/23/09 | 8.49 |
| 5/23/09 | 8.52 |
| 5/23/09 | 8.55 |
| 5/23/09 | 8.52 |
| 5/23/09 | 8.5 |
| 5/23/09 | 8.47 |
| 5/23/09 | 8.52 |
| 5/23/09 | 8.52 |
| 5/23/09 | 8.53 |
| 5/23/09 | 8.55 |
| 5/23/09 | 8.55 |
| 5/23/09 | 8.55 |
| 5/23/09 | 8.51 |
| 5/23/09 | 8.49 |
| 5/23/09 | 8.49 |
| 5/23/09 | 8.5 |
| 5/23/09 | 8.48 |
| 5/23/09 | 8.5 |
| 5/23/09 | 8.51 |
| 5/23/09 | 8.5 |
| 5/23/09 | 8.52 |
| 5/23/09 | 8.51 |
| 5/23/09 | 8.53 |
| 5/23/09 | 8.55 |
| 5/23/09 | 8.53 |
| 5/23/09 | 8.52 |
| 5/23/09 | 8.55 |
| 5/23/09 | 8.54 |
| 5/23/09 | 8.52 |
| 5/23/09 | 8.5 |
| 5/23/09 | 8.49 |
| 5/23/09 | 8.5 |
| 5/23/09 | 8.48 |
| 5/23/09 | 8.48 |
| 5/23/09 | 8.4 |
| 5/23/09 | 8.44 |
| 5/23/09 | 8.45 |
| 5/23/09 | 8.46 |
| 5/23/09 | 8.31 |
| 5/23/09 | 8.26 |
| 5/22/09 | 8.26 |
| 5/22/09 | 8.26 |
| 5/22/09 | 8.25 |
| 5/22/09 | 8.26 |
| 5/22/09 | 8.28 |
| 5/22/09 | 8.23 |
| 5/22/09 | 8.35 |
| 5/22/09 | 8.36 |
| 5/22/09 | 8.4 |
| 5/22/09 | 8.44 |
| 5/22/09 | 8.42 |
| 5/22/09 | 8.45 |
| 5/22/09 | 8.45 |
| 5/22/09 | 8.5 |
| 5/22/09 | 8.51 |
| 5/22/09 | 8.51 |
| 5/22/09 | 8.53 |
| 5/22/09 | 8.54 |
| 5/22/09 | 8.52 |
| 5/22/09 | 8.53 |
| 5/22/09 | 8.52 |
| 5/22/09 | 8.55 |
| 5/22/09 | 8.52 |
| 5/22/09 | 8.51 |
| 5/22/09 | 8.48 |
| 5/22/09 | 8.4 |
| 5/22/09 | 8.43 |
| 5/22/09 | 8.42 |
| 5/22/09 | 8.41 |
| 5/22/09 | 8.44 |
| 5/22/09 | 8.47 |
| 5/22/09 | 8.55 |
| 5/22/09 | 8.54 |
| 5/22/09 | 8.55 |
| 5/22/09 | 8.56 |
| 5/22/09 | 8.56 |
| 5/22/09 | 8.56 |
| 5/22/09 | 8.55 |
| 5/22/09 | 8.54 |
| 5/22/09 | 8.53 |
| 5/22/09 | 8.54 |
| 5/22/09 | 8.53 |
| 5/22/09 | 8.52 |
| 5/22/09 | 8.58 |
| 5/22/09 | 8.59 |
| 5/22/09 | 8.58 |
| 5/22/09 | 8.59 |
| 5/22/09 | 8.48 |
| 5/21/09 | 8.44 |
| 5/21/09 | 8.49 |
| 5/21/09 | 8.44 |
| 5/21/09 | 8.42 |
| 5/21/09 | 8.43 |
| 5/21/09 | 8.44 |
| 5/21/09 | 8.47 |
| 5/21/09 | 8.49 |
| 5/21/09 | 8.56 |
| 5/21/09 | 8.59 |
| 5/21/09 | 8.53 |
| 5/21/09 | 8.55 |
| 5/21/09 | 8.6 |
| 5/21/09 | 8.52 |
| 5/21/09 | 8.52 |
| 5/21/09 | 8.53 |
| 5/21/09 | 8.52 |
| 5/21/09 | 8.55 |
| 5/21/09 | 8.56 |
| 5/21/09 | 8.6 |
| 5/21/09 | 8.55 |
| 5/21/09 | 8.53 |
| 5/21/09 | 8.57 |
| 5/21/09 | 8.56 |
| 5/21/09 | 8.53 |
| 5/21/09 | 8.54 |
| 5/21/09 | 8.55 |
| 5/21/09 | 8.53 |
| 5/21/09 | 8.53 |
| 5/21/09 | 8.55 |
| 5/21/09 | 8.56 |
| 5/21/09 | 8.56 |
| 5/21/09 | 8.57 |
| 5/21/09 | 8.58 |
| 5/21/09 | 8.56 |
| 5/21/09 | 8.6 |
| 5/21/09 | 8.59 |
| 5/21/09 | 8.56 |
| 5/21/09 | 8.58 |
| 5/21/09 | 8.56 |
| 5/21/09 | 8.56 |
| 5/21/09 | 8.53 |
| 5/21/09 | 8.53 |
| 5/21/09 | 8.53 |
| 5/21/09 | 8.55 |
| 5/21/09 | 8.5 |
| 5/21/09 | 8.48 |
| 5/21/09 | 8.45 |
| 5/20/09 | 8.44 |
| 5/20/09 | 8.5 |
| 5/20/09 | 8.54 |
| 5/20/09 | 8.43 |
| 5/20/09 | 8.37 |
| 5/20/09 | 8.37 |
| 5/20/09 | 8.4 |
| 5/20/09 | 8.48 |
| 5/20/09 | 8.52 |
| 5/20/09 | 8.5 |
| 5/20/09 | 8.54 |
| 5/20/09 | 8.57 |
| 5/20/09 | 8.5 |
| 5/20/09 | 8.5 |
| 5/20/09 | 8.55 |
| 5/20/09 | 8.52 |
| 5/20/09 | 8.58 |
| 5/20/09 | 8.56 |
| 5/20/09 | 8.52 |
| 5/20/09 | 8.54 |
| 5/20/09 | 8.54 |
| 5/20/09 | 8.57 |
| 5/20/09 | 8.56 |
| 5/20/09 | 8.5 |
| 5/20/09 | 8.52 |
| 5/20/09 | 8.53 |
| 5/20/09 | 8.53 |
| 5/20/09 | 8.52 |
| 5/20/09 | 8.56 |
| 5/20/09 | 8.55 |
| 5/20/09 | 8.55 |
| 5/20/09 | 8.53 |
| 5/20/09 | 8.54 |
| 5/20/09 | 8.55 |
| 5/20/09 | 8.52 |
| 5/20/09 | 8.53 |
| 5/20/09 | 8.53 |
| 5/20/09 | 8.54 |
| 5/20/09 | 8.54 |
| 5/20/09 | 8.54 |
| 5/20/09 | 8.53 |
| 5/20/09 | 8.54 |
| 5/20/09 | 8.54 |
| 5/20/09 | 8.54 |
| 5/20/09 | 8.55 |
| 5/20/09 | 8.55 |
| 5/20/09 | 8.53 |
| 5/20/09 | 8.53 |
| 5/19/09 | 8.53 |
| 5/19/09 | 8.54 |
| 5/19/09 | 8.53 |
| 5/19/09 | 8.55 |
| 5/19/09 | 8.55 |
| 5/19/09 | 8.55 |
| 5/19/09 | 8.55 |
| 5/19/09 | 8.58 |
| 5/19/09 | 8.59 |
| 5/19/09 | 8.55 |
| 5/19/09 | 8.58 |
| 5/19/09 | 8.52 |
| 5/19/09 | 8.54 |
| 5/19/09 | 8.52 |
| 5/19/09 | 8.53 |
| 5/19/09 | 8.48 |
| 5/19/09 | 8.53 |
| 5/19/09 | 8.52 |
| 5/19/09 | 8.54 |
| 5/19/09 | 8.57 |
| 5/19/09 | 8.58 |
| 5/19/09 | 8.6 |
| 5/19/09 | 8.59 |
| 5/19/09 | 8.6 |
| 5/19/09 | 8.52 |
| 5/19/09 | 8.44 |
| 5/19/09 | 8.46 |
| 5/19/09 | 8.48 |
| 5/19/09 | 8.48 |
| 5/19/09 | 8.5 |
| 5/19/09 | 8.48 |
| 5/19/09 | 8.47 |
| 5/19/09 | 8.48 |
| 5/19/09 | 8.48 |
| 5/19/09 | 8.48 |
| 5/19/09 | 8.49 |
| 5/19/09 | 8.48 |
| 5/19/09 | 8.49 |
| 5/19/09 | 8.49 |
| 5/19/09 | 8.5 |
| 5/19/09 | 8.5 |
| 5/19/09 | 8.51 |
| 5/19/09 | 8.51 |
| 5/19/09 | 8.51 |
| 5/19/09 | 8.51 |
| 5/19/09 | 8.51 |
| 5/19/09 | 8.51 |
| 5/19/09 | 8.51 |
| 5/18/09 | 8.51 |
| 5/18/09 | 8.52 |
| 5/18/09 | 8.51 |
| 5/18/09 | 8.52 |
| 5/18/09 | 8.52 |
| 5/18/09 | 8.52 |
| 5/18/09 | 8.53 |
| 5/18/09 | 8.54 |
| 5/18/09 | 8.54 |
| 5/18/09 | 8.55 |
| 5/18/09 | 8.54 |
| 5/18/09 | 8.52 |
| 5/18/09 | 8.52 |
| 5/18/09 | 8.53 |
| 5/18/09 | 8.57 |
| 5/18/09 | 8.53 |
| 5/18/09 | 8.49 |
| 5/18/09 | 8.49 |
| 5/18/09 | 8.49 |
| 5/18/09 | 8.49 |
| 5/18/09 | 8.47 |
| 5/18/09 | 8.53 |
| 5/18/09 | 8.55 |
| 5/18/09 | 8.51 |
| 5/18/09 | 8.55 |
| 5/18/09 | 8.55 |
| 5/18/09 | 8.49 |
| 5/18/09 | 8.46 |
| 5/18/09 | 8.48 |
| 5/18/09 | 8.47 |
| 5/18/09 | 8.47 |
| 5/18/09 | 8.47 |
| 5/18/09 | 8.47 |
| 5/18/09 | 8.45 |
| 5/18/09 | 8.44 |
| 5/18/09 | 8.45 |
| 5/18/09 | 8.45 |
| 5/18/09 | 8.45 |
| 5/18/09 | 8.45 |
| 5/18/09 | 8.46 |
| 5/18/09 | 8.46 |
| 5/18/09 | 8.48 |
| 5/18/09 | 8.47 |
| 5/18/09 | 8.47 |
| 5/18/09 | 8.45 |
| 5/18/09 | 8.43 |
| 5/18/09 | 8.43 |
| 5/18/09 | 8.43 |
| 5/17/09 | 8.44 |
| 5/17/09 | 8.44 |
| 5/17/09 | 8.44 |
| 5/17/09 | 8.45 |
| 5/17/09 | 8.46 |
| 5/17/09 | 8.45 |
| 5/17/09 | 8.47 |
| 5/17/09 | 8.48 |
| 5/17/09 | 8.48 |
| 5/17/09 | 8.49 |
| 5/17/09 | 8.5 |
| 5/17/09 | 8.5 |
| 5/17/09 | 8.5 |
| 5/17/09 | 8.5 |
| 5/17/09 | 8.5 |
| 5/17/09 | 8.5 |
| 5/17/09 | 8.5 |
| 5/17/09 | 8.49 |
| 5/17/09 | 8.49 |
| 5/17/09 | 8.48 |
| 5/17/09 | 8.47 |
| 5/17/09 | 8.48 |
| 5/17/09 | 8.48 |
| 5/17/09 | 8.5 |
| 5/17/09 | 8.5 |
| 5/17/09 | 8.5 |
| 5/17/09 | 8.5 |
| 5/17/09 | 8.5 |
| 5/17/09 | 8.49 |
| 5/17/09 | 8.46 |
| 5/17/09 | 8.46 |
| 5/17/09 | 8.43 |
| 5/17/09 | 8.43 |
| 5/17/09 | 8.42 |
| 5/17/09 | 8.43 |
| 5/17/09 | 8.44 |
| 5/17/09 | 8.45 |
| 5/17/09 | 8.45 |
| 5/17/09 | 8.46 |
| 5/17/09 | 8.45 |
| 5/17/09 | 8.44 |
| 5/17/09 | 8.44 |
| 5/17/09 | 8.43 |
| 5/17/09 | 8.44 |
| 5/17/09 | 8.43 |
| 5/17/09 | 8.42 |
| 5/17/09 | 8.42 |
| 5/17/09 | 8.42 |
| 5/16/09 | 8.43 |
| 5/16/09 | 8.45 |
| 5/16/09 | 8.44 |
| 5/16/09 | 8.47 |
| 5/16/09 | 8.46 |
| 5/16/09 | 8.47 |
| 5/16/09 | 8.5 |
| 5/16/09 | 8.48 |
| 5/16/09 | 8.5 |
| 5/16/09 | 8.49 |
| 5/16/09 | 8.48 |
| 5/16/09 | 8.48 |
| 5/16/09 | 8.44 |
| 5/16/09 | 8.47 |
| 5/16/09 | 8.49 |
| 5/16/09 | 8.51 |
| 5/16/09 | 8.49 |
| 5/16/09 | 8.52 |
| 5/16/09 | 8.49 |
| 5/16/09 | 8.53 |
| 5/16/09 | 8.49 |
| 5/16/09 | 8.5 |
| 5/16/09 | 8.45 |
| 5/16/09 | 8.48 |
| 5/16/09 | 8.41 |
| 5/16/09 | 8.43 |
| 5/16/09 | 8.41 |
| 5/16/09 | 8.4 |
| 5/16/09 | 8.41 |
| 5/16/09 | 8.41 |
| 5/16/09 | 8.39 |
| 5/16/09 | 8.34 |
| 5/16/09 | 8.38 |
| 5/16/09 | 8.35 |
| 5/16/09 | 8.32 |
| 5/16/09 | 8.32 |
| 5/16/09 | 8.33 |
| 5/16/09 | 8.35 |
| 5/16/09 | 8.37 |
| 5/16/09 | 8.35 |
| 5/16/09 | 8.35 |
| 5/16/09 | 8.36 |
| 5/16/09 | 8.36 |
| 5/16/09 | 8.35 |
| 5/16/09 | 8.34 |
| 5/16/09 | 8.34 |
| 5/16/09 | 8.36 |
| 5/16/09 | 8.37 |
| 5/15/09 | 8.3 |
| 5/15/09 | 8.31 |
| 5/15/09 | 8.34 |
| 5/15/09 | 8.37 |
| 5/15/09 | 8.36 |
| 5/15/09 | 8.38 |
| 5/15/09 | 8.39 |
| 5/15/09 | 8.38 |
| 5/15/09 | 8.37 |
| 5/15/09 | 8.36 |
| 5/15/09 | 8.39 |
| 5/15/09 | 8.34 |
| 5/15/09 | 8.41 |
| 5/15/09 | 8.39 |
| 5/15/09 | 8.39 |
| 5/15/09 | 8.37 |
| 5/15/09 | 8.38 |
| 5/15/09 | 8.41 |
| 5/15/09 | 8.39 |
| 5/15/09 | 8.32 |
| 5/15/09 | 8.3 |
| 5/15/09 | 8.31 |
| 5/15/09 | 8.32 |
| 5/15/09 | 8.32 |
| 5/15/09 | 8.33 |
| 5/15/09 | 8.34 |
| 5/15/09 | 8.34 |
| 5/15/09 | 8.32 |
| 5/15/09 | 8.34 |
| 5/15/09 | 8.33 |
| 5/15/09 | 8.33 |
| 5/15/09 | 8.33 |
| 5/15/09 | 8.33 |
| 5/15/09 | 8.33 |
| 5/15/09 | 8.33 |
| 5/15/09 | 8.34 |
| 5/15/09 | 8.35 |
| 5/15/09 | 8.35 |
| 5/15/09 | 8.36 |
| 5/15/09 | 8.35 |
| 5/15/09 | 8.35 |
| 5/15/09 | 8.36 |
| 5/15/09 | 8.37 |
| 5/15/09 | 8.36 |
| 5/15/09 | 8.37 |
| 5/15/09 | 8.37 |
| 5/15/09 | 8.38 |
| 5/15/09 | 8.39 |
| 5/14/09 | 8.39 |
| 5/14/09 | 8.39 |
| 5/14/09 | 8.39 |
| 5/14/09 | 8.39 |
| 5/14/09 | 8.39 |
| 5/14/09 | 8.39 |
| 5/14/09 | 8.41 |
| 5/14/09 | 8.39 |
| 5/14/09 | 8.39 |
| 5/14/09 | 8.4 |
| 5/14/09 | 8.41 |
| 5/14/09 | 8.39 |
| 5/14/09 | 8.4 |
| 5/14/09 | 8.42 |
| 5/14/09 | 8.34 |
| 5/14/09 | 8.36 |
| 5/14/09 | 8.35 |
| 5/14/09 | 8.39 |
| 5/14/09 | 8.4 |
| 5/14/09 | 8.4 |
| 5/14/09 | 8.4 |
| 5/14/09 | 8.39 |
| 5/14/09 | 8.39 |
| 5/14/09 | 8.38 |
| 5/14/09 | 8.37 |
| 5/14/09 | 8.38 |
| 5/14/09 | 8.38 |
| 5/14/09 | 8.38 |
| 5/14/09 | 8.38 |
| 5/14/09 | 8.38 |
| 5/14/09 | 8.37 |
| 5/14/09 | 8.36 |
| 5/14/09 | 8.34 |
| 5/14/09 | 8.35 |
| 5/14/09 | 8.35 |
| 5/14/09 | 8.36 |
| 5/14/09 | 8.36 |
| 5/14/09 | 8.36 |
| 5/14/09 | 8.35 |
| 5/14/09 | 8.36 |
| 5/14/09 | 8.36 |
| 5/14/09 | 8.36 |
| 5/14/09 | 8.37 |
| 5/14/09 | 8.36 |
| 5/14/09 | 8.37 |
| 5/14/09 | 8.37 |
| 5/14/09 | 8.36 |
| 5/14/09 | 8.36 |
| 5/13/09 | 8.37 |
| 5/13/09 | 8.37 |
| 5/13/09 | 8.39 |
| 5/13/09 | 8.39 |
| 5/13/09 | 8.4 |
| 5/13/09 | 8.4 |
| 5/13/09 | 8.4 |
| 5/13/09 | 8.4 |
| 5/13/09 | 8.41 |
| 5/13/09 | 8.41 |
| 5/13/09 | 8.41 |
| 5/13/09 | 8.41 |
| 5/13/09 | 8.39 |
| 5/13/09 | 8.37 |
| 5/13/09 | 8.37 |
| 5/13/09 | 8.38 |
| 5/13/09 | 8.36 |
| 5/13/09 | 8.35 |
| 5/13/09 | 8.35 |
| 5/13/09 | 8.35 |
| 5/13/09 | 8.34 |
| 5/13/09 | 8.35 |
| 5/13/09 | 8.34 |
| 5/13/09 | 8.34 |
| 5/13/09 | 8.32 |
| 5/13/09 | 8.32 |
| 5/13/09 | 8.32 |
| 5/13/09 | 8.3 |
| 5/13/09 | 8.31 |
| 5/13/09 | 8.29 |
| 5/13/09 | 8.29 |
| 5/13/09 | 8.29 |
| 5/13/09 | 8.29 |
| 5/13/09 | 8.28 |
| 5/13/09 | 8.29 |
| 5/13/09 | 8.29 |
| 5/13/09 | 8.29 |
| 5/13/09 | 8.3 |
| 5/13/09 | 8.29 |
| 5/13/09 | 8.3 |
| 5/13/09 | 8.31 |
| 5/13/09 | 8.3 |
| 5/13/09 | 8.3 |
| 5/13/09 | 8.31 |
| 5/13/09 | 8.31 |
| 5/13/09 | 8.32 |
| 5/13/09 | 8.31 |
| 5/13/09 | 8.31 |
| 5/12/09 | 8.31 |
| 5/12/09 | 8.31 |
| 5/12/09 | 8.32 |
| 5/12/09 | 8.31 |
| 5/12/09 | 8.32 |
| 5/12/09 | 8.33 |
| 5/12/09 | 8.32 |
| 5/12/09 | 8.32 |
| 5/12/09 | 8.34 |
| 5/12/09 | 8.39 |
| 5/12/09 | 8.38 |
| 5/12/09 | 8.41 |
| 5/12/09 | 8.35 |
| 5/12/09 | 8.32 |
| 5/12/09 | 8.35 |
| 5/12/09 | 8.31 |
| 5/12/09 | 8.33 |
| 5/12/09 | 8.37 |
| 5/12/09 | 8.28 |
| 5/12/09 | 8.26 |
| 5/12/09 | 8.26 |
| 5/12/09 | 8.25 |
| 5/12/09 | 8.25 |
| 5/12/09 | 8.28 |
| 5/12/09 | 8.23 |
| 5/12/09 | 8.22 |
| 5/12/09 | 8.2 |
| 5/12/09 | 8.21 |
| 5/12/09 | 8.18 |
| 5/12/09 | 8.18 |
| 5/12/09 | 8.2 |
| 5/12/09 | 8.2 |
| 5/12/09 | 8.19 |
| 5/12/09 | 8.19 |
| 5/12/09 | 8.2 |
| 5/12/09 | 8.19 |
| 5/12/09 | 8.18 |
| 5/12/09 | 8.19 |
| 5/12/09 | 8.2 |
| 5/12/09 | 8.2 |
| 5/12/09 | 8.21 |
| 5/12/09 | 8.22 |
| 5/12/09 | 8.22 |
| 5/12/09 | 8.23 |
| 5/12/09 | 8.24 |
| 5/12/09 | 8.25 |
| 5/12/09 | 8.25 |
| 5/12/09 | 8.25 |
| 5/11/09 | 8.26 |
| 5/11/09 | 8.26 |
| 5/11/09 | 8.27 |
| 5/11/09 | 8.27 |
| 5/11/09 | 8.27 |
| 5/11/09 | 8.24 |
| 5/11/09 | 8.25 |
| 5/11/09 | 8.25 |
| 5/11/09 | 8.25 |
| 5/11/09 | 8.27 |
| 5/11/09 | 8.25 |
| 5/11/09 | 8.25 |
| 5/11/09 | 8.26 |
| 5/11/09 | 8.28 |
| 5/11/09 | 8.25 |
| 5/11/09 | 8.22 |
| 5/11/09 | 8.23 |
| 5/11/09 | 8.22 |
| 5/11/09 | 8.21 |
| 5/11/09 | 8.21 |
| 5/11/09 | 8.18 |
| 5/11/09 | 8.18 |
| 5/11/09 | 8.18 |
| 5/11/09 | 8.18 |
| 5/11/09 | 8.19 |
| 5/11/09 | 8.18 |
| 5/11/09 | 8.19 |
| 5/11/09 | 8.19 |
| 5/11/09 | 8.18 |
| 5/11/09 | 8.2 |
| 5/11/09 | 8.19 |
| 5/11/09 | 8.19 |
| 5/11/09 | 8.19 |
| 5/11/09 | 8.2 |
| 5/11/09 | 8.19 |
| 5/11/09 | 8.19 |
| 5/11/09 | 8.19 |
| 5/11/09 | 8.19 |
| 5/11/09 | 8.2 |
| 5/11/09 | 8.2 |
| 5/11/09 | 8.19 |
| 5/11/09 | 8.19 |
| 5/11/09 | 8.19 |
| 5/11/09 | 8.2 |
| 5/11/09 | 8.2 |
| 5/11/09 | 8.2 |
| 5/11/09 | 8.2 |
| 5/11/09 | 8.21 |
| 5/10/09 | 8.21 |
| 5/10/09 | 8.21 |
| 5/10/09 | 8.22 |
| 5/10/09 | 8.21 |
| 5/10/09 | 8.22 |
| 5/10/09 | 8.23 |
| 5/10/09 | 8.24 |
| 5/10/09 | 8.24 |
| 5/10/09 | 8.23 |
| 5/10/09 | 8.27 |
| 5/10/09 | 8.28 |
| 5/10/09 | 8.28 |
| 5/10/09 | 8.29 |
| 5/10/09 | 8.29 |
| 5/10/09 | 8.28 |
| 5/10/09 | 8.28 |
| 5/10/09 | 8.28 |
| 5/10/09 | 8.27 |
| 5/10/09 | 8.27 |
| 5/10/09 | 8.27 |
| 5/10/09 | 8.26 |
| 5/10/09 | 8.26 |
| 5/10/09 | 8.26 |
| 5/10/09 | 8.24 |
| 5/10/09 | 8.25 |
| 5/10/09 | 8.25 |
| 5/10/09 | 8.24 |
| 5/10/09 | 8.24 |
| 5/10/09 | 8.25 |
| 5/10/09 | 8.24 |
| 5/10/09 | 8.24 |
| 5/10/09 | 8.24 |
| 5/10/09 | 8.24 |
| 5/10/09 | 8.24 |
| 5/10/09 | 8.23 |
| 5/10/09 | 8.23 |
| 5/10/09 | 8.23 |
| 5/10/09 | 8.24 |
| 5/10/09 | 8.24 |
| 5/10/09 | 8.24 |
| 5/10/09 | 8.24 |
| 5/10/09 | 8.24 |
| 5/10/09 | 8.24 |
| 5/10/09 | 8.25 |
| 5/10/09 | 8.25 |
| 5/10/09 | 8.26 |
| 5/10/09 | 8.27 |
| 5/10/09 | 8.28 |
| 5/9/09 | 8.28 |
| 5/9/09 | 8.29 |
| 5/9/09 | 8.28 |
| 5/9/09 | 8.3 |
| 5/9/09 | 8.28 |
| 5/9/09 | 8.28 |
| 5/9/09 | 8.3 |
| 5/9/09 | 8.3 |
| 5/9/09 | 8.3 |
| 5/9/09 | 8.3 |
| 5/9/09 | 8.3 |
| 5/9/09 | 8.29 |
| 5/9/09 | 8.27 |
| 5/9/09 | 8.27 |
| 5/9/09 | 8.27 |
| 5/9/09 | 8.27 |
| 5/9/09 | 8.28 |
| 5/9/09 | 8.3 |
| 5/9/09 | 8.29 |
| 5/9/09 | 8.28 |
| 5/9/09 | 8.28 |
| 5/9/09 | 8.27 |
| 5/9/09 | 8.26 |
| 5/9/09 | 8.25 |
| 5/9/09 | 8.23 |
| 5/9/09 | 8.23 |
| 5/9/09 | 8.24 |
| 5/9/09 | 8.24 |
| 5/9/09 | 8.25 |
| 5/9/09 | 8.19 |
| 5/9/09 | 8.2 |
| 5/9/09 | 8.21 |
| 5/9/09 | 8.2 |
| 5/9/09 | 8.2 |
| 5/9/09 | 8.21 |
| 5/9/09 | 8.23 |
| 5/9/09 | 8.22 |
| 5/9/09 | 8.23 |
| 5/9/09 | 8.24 |
| 5/9/09 | 8.21 |
| 5/9/09 | 8.23 |
| 5/9/09 | 8.21 |
| 5/9/09 | 8.23 |
| 5/9/09 | 8.22 |
| 5/9/09 | 8.19 |
| 5/9/09 | 8.2 |
| 5/9/09 | 8.25 |
| 5/9/09 | 8.22 |
| 5/8/09 | 8.21 |
| 5/8/09 | 8.22 |
| 5/8/09 | 8.22 |
| 5/8/09 | 8.23 |
| 5/8/09 | 8.25 |
| 5/8/09 | 8.26 |
| 5/8/09 | 8.25 |
| 5/8/09 | 8.27 |
| 5/8/09 | 8.27 |
| 5/8/09 | 8.25 |
| 5/8/09 | 8.25 |
| 5/8/09 | 8.25 |
| 5/8/09 | 8.25 |
| 5/8/09 | 8.21 |
| 5/8/09 | 8.22 |
| 5/8/09 | 8.23 |
| 5/8/09 | 8.24 |
| 5/8/09 | 8.24 |
| 5/8/09 | 8.23 |
| 5/8/09 | 8.24 |
| 5/8/09 | 8.24 |
| 5/8/09 | 8.23 |
| 5/8/09 | 8.22 |
| 5/8/09 | 8.22 |
| 5/8/09 | 8.21 |
| 5/8/09 | 8.21 |
| 5/8/09 | 8.22 |
| 5/8/09 | 8.24 |
| 5/8/09 | 8.21 |
| 5/8/09 | 8.19 |
| 5/8/09 | 8.18 |
| 5/8/09 | 8.21 |
| 5/8/09 | 8.2 |
| 5/8/09 | 8.21 |
| 5/8/09 | 8.21 |
| 5/8/09 | 8.22 |
| 5/8/09 | 8.22 |
| 5/8/09 | 8.22 |
| 5/8/09 | 8.21 |
| 5/8/09 | 8.22 |
| 5/8/09 | 8.22 |
| 5/8/09 | 8.23 |
| 5/8/09 | 8.23 |
| 5/8/09 | 8.23 |
| 5/8/09 | 8.24 |
| 5/8/09 | 8.25 |
| 5/8/09 | 8.24 |
| 5/8/09 | 8.26 |
| 5/7/09 | 8.24 |
| 5/7/09 | 8.25 |
| 5/7/09 | 8.22 |
| 5/7/09 | 8.24 |
| 5/7/09 | 8.23 |
| 5/7/09 | 8.24 |
| 5/7/09 | 8.24 |
| 5/7/09 | 8.22 |
| 5/7/09 | 8.21 |
| 5/7/09 | 8.24 |
| 5/7/09 | 8.2 |
| 5/7/09 | 8.22 |
| 5/7/09 | 8.21 |
| 5/7/09 | 8.23 |
| 5/7/09 | 8.21 |
| 5/7/09 | 8.2 |
| 5/7/09 | 8.22 |
| 5/7/09 | 8.21 |
| 5/7/09 | 8.2 |
| 5/7/09 | 8.18 |
| 5/7/09 | 8.17 |
| 5/7/09 | 8.16 |
| 5/7/09 | 8.16 |
| 5/7/09 | 8.19 |
| 5/7/09 | 8.18 |
| 5/7/09 | 8.18 |
| 5/7/09 | 8.17 |
| 5/7/09 | 8.18 |
| 5/7/09 | 8.18 |
| 5/7/09 | 8.18 |
| 5/7/09 | 8.16 |
| 5/7/09 | 8.16 |
| 5/7/09 | 8.18 |
| 5/7/09 | 8.18 |
| 5/7/09 | 8.19 |
| 5/7/09 | 8.18 |
| 5/7/09 | 8.18 |
| 5/7/09 | 8.19 |
| 5/7/09 | 8.2 |
| 5/7/09 | 8.2 |
| 5/7/09 | 8.21 |
| 5/7/09 | 8.22 |
| 5/7/09 | 8.22 |
| 5/7/09 | 8.24 |
| 5/7/09 | 8.25 |
| 5/7/09 | 8.25 |
| 5/7/09 | 8.25 |
| 5/7/09 | 8.24 |
| 5/6/09 | 8.25 |
| 5/6/09 | 8.25 |
| 5/6/09 | 8.25 |
| 5/6/09 | 8.24 |
| 5/6/09 | 8.24 |
| 5/6/09 | 8.24 |
| 5/6/09 | 8.25 |
| 5/6/09 | 8.23 |
| 5/6/09 | 8.24 |
| 5/6/09 | 8.21 |
| 5/6/09 | 8.22 |
| 5/6/09 | 8.23 |
| 5/6/09 | 8.23 |
| 5/6/09 | 8.23 |
| 5/6/09 | 8.23 |
| 5/6/09 | 8.2 |
| 5/6/09 | 8.19 |
| 5/6/09 | 8.21 |
| 5/6/09 | 8.23 |
| 5/6/09 | 8.22 |
| 5/6/09 | 8.21 |
| 5/6/09 | 8.18 |
| 5/6/09 | 8.18 |
| 5/6/09 | 8.18 |
| 5/6/09 | 8.18 |
| 5/6/09 | 8.18 |
| 5/6/09 | 8.15 |
| 5/6/09 | 8.15 |
| 5/6/09 | 8.14 |
| 5/6/09 | 8.13 |
| 5/6/09 | 8.13 |
| 5/6/09 | 8.14 |
| 5/6/09 | 8.15 |
| 5/6/09 | 8.16 |
| 5/6/09 | 8.17 |
| 5/6/09 | 8.17 |
| 5/6/09 | 8.17 |
| 5/6/09 | 8.17 |
| 5/6/09 | 8.19 |
| 5/6/09 | 8.19 |
| 5/6/09 | 8.2 |
| 5/6/09 | 8.19 |
| 5/6/09 | 8.2 |
| 5/6/09 | 8.2 |
| 5/6/09 | 8.21 |
| 5/6/09 | 8.21 |
| 5/6/09 | 8.21 |
| 5/6/09 | 8.22 |
| 5/5/09 | 8.22 |
| 5/5/09 | 8.22 |
| 5/5/09 | 8.22 |
| 5/5/09 | 8.21 |
| 5/5/09 | 8.21 |
| 5/5/09 | 8.22 |
| 5/5/09 | 8.23 |
| 5/5/09 | 8.23 |
| 5/5/09 | 8.24 |
| 5/5/09 | 8.24 |
| 5/5/09 | 8.24 |
| 5/5/09 | 8.25 |
| 5/5/09 | 8.25 |
| 5/5/09 | 8.23 |
| 5/5/09 | 8.24 |
| 5/5/09 | 8.23 |
| 5/5/09 | 8.24 |
| 5/5/09 | 8.24 |
| 5/5/09 | 8.21 |
| 5/5/09 | 8.22 |
| 5/5/09 | 8.21 |
| 5/5/09 | 8.22 |
| 5/5/09 | 8.22 |
| 5/5/09 | 8.22 |
| 5/5/09 | 8.22 |
| 5/5/09 | 8.22 |
| 5/5/09 | 8.21 |
| 5/5/09 | 8.21 |
| 5/5/09 | 8.2 |
| 5/5/09 | 8.19 |
| 5/5/09 | 8.19 |
| 5/5/09 | 8.18 |
| 5/5/09 | 8.18 |
| 5/5/09 | 8.18 |
| 5/5/09 | 8.18 |
| 5/5/09 | 8.19 |
| 5/5/09 | 8.19 |
| 5/5/09 | 8.19 |
| 5/5/09 | 8.18 |
| 5/5/09 | 8.18 |
| 5/5/09 | 8.19 |
| 5/5/09 | 8.19 |
| 5/5/09 | 8.19 |
| 5/5/09 | 8.19 |
| 5/5/09 | 8.2 |
| 5/5/09 | 8.2 |
| 5/5/09 | 8.21 |
| 5/5/09 | 8.22 |
| 5/4/09 | 8.23 |
| 5/4/09 | 8.23 |
| 5/4/09 | 8.22 |
| 5/4/09 | 8.23 |
| 5/4/09 | 8.22 |
| 5/4/09 | 8.23 |
| 5/4/09 | 8.24 |
| 5/4/09 | 8.26 |
| 5/4/09 | 8.27 |
| 5/4/09 | 8.27 |
| 5/4/09 | 8.28 |
| 5/4/09 | 8.28 |
| 5/4/09 | 8.29 |
| 5/4/09 | 8.27 |
| 5/4/09 | 8.27 |
| 5/4/09 | 8.28 |
| 5/4/09 | 8.26 |
| 5/4/09 | 8.25 |
| 5/4/09 | 8.22 |
| 5/4/09 | 8.23 |
| 5/4/09 | 8.22 |
| 5/4/09 | 8.24 |
| 5/4/09 | 8.25 |
| 5/4/09 | 8.23 |
| 5/4/09 | 8.23 |
| 5/4/09 | 8.24 |
| 5/4/09 | 8.25 |
| 5/4/09 | 8.25 |
| 5/4/09 | 8.25 |
| 5/4/09 | 8.26 |
| 5/4/09 | 8.23 |
| 5/4/09 | 8.24 |
| 5/4/09 | 8.25 |
| 5/4/09 | 8.24 |
| 5/4/09 | 8.25 |
| 5/4/09 | 8.26 |
| 5/4/09 | 8.26 |
| 5/4/09 | 8.26 |
| 5/4/09 | 8.27 |
| 5/4/09 | 8.27 |
| 5/4/09 | 8.27 |
| 5/4/09 | 8.27 |
| 5/4/09 | 8.27 |
| 5/4/09 | 8.27 |
| 5/4/09 | 8.27 |
| 5/4/09 | 8.28 |
| 5/4/09 | 8.28 |
| 5/4/09 | 8.29 |
| 5/3/09 | 8.29 |
| 5/3/09 | 8.29 |
| 5/3/09 | 8.28 |
| 5/3/09 | 8.28 |
| 5/3/09 | 8.26 |
| 5/3/09 | 8.26 |
| 5/3/09 | 8.29 |
| 5/3/09 | 8.3 |
| 5/3/09 | 8.31 |
| 5/3/09 | 8.31 |
| 5/3/09 | 8.31 |
| 5/3/09 | 8.29 |
| 5/3/09 | 8.32 |
| 5/3/09 | 8.31 |
| 5/3/09 | 8.29 |
| 5/3/09 | 8.28 |
| 5/3/09 | 8.3 |
| 5/3/09 | 8.3 |
| 5/3/09 | 8.29 |
| 5/3/09 | 8.28 |
| 5/3/09 | 8.29 |
| 5/3/09 | 8.28 |
| 5/3/09 | 8.27 |
| 5/3/09 | 8.27 |
| 5/3/09 | 8.27 |
| 5/3/09 | 8.27 |
| 5/3/09 | 8.27 |
| 5/3/09 | 8.26 |
| 5/3/09 | 8.26 |
| 5/3/09 | 8.25 |
| 5/3/09 | 8.25 |
| 5/3/09 | 8.25 |
| 5/3/09 | 8.26 |
| 5/3/09 | 8.27 |
| 5/3/09 | 8.27 |
| 5/3/09 | 8.28 |
| 5/3/09 | 8.29 |
| 5/3/09 | 8.29 |
| 5/3/09 | 8.28 |
| 5/3/09 | 8.28 |
| 5/3/09 | 8.29 |
| 5/3/09 | 8.29 |
| 5/3/09 | 8.3 |
| 5/3/09 | 8.28 |
| 5/3/09 | 8.31 |
| 5/3/09 | 8.31 |
| 5/3/09 | 8.32 |
| 5/3/09 | 8.32 |
| 5/2/09 | 8.32 |
| 5/2/09 | 8.32 |
| 5/2/09 | 8.32 |
| 5/2/09 | 8.32 |
| 5/2/09 | 8.31 |
| 5/2/09 | 8.31 |
| 5/2/09 | 8.32 |
| 5/2/09 | 8.32 |
| 5/2/09 | 8.32 |
| 5/2/09 | 8.33 |
| 5/2/09 | 8.33 |
| 5/2/09 | 8.32 |
| 5/2/09 | 8.33 |
| 5/2/09 | 8.3 |
| 5/2/09 | 8.3 |
| 5/2/09 | 8.32 |
| 5/2/09 | 8.29 |
| 5/2/09 | 8.3 |
| 5/2/09 | 8.3 |
| 5/2/09 | 8.29 |
| 5/2/09 | 8.3 |
| 5/2/09 | 8.3 |
| 5/2/09 | 8.3 |
| 5/2/09 | 8.29 |
| 5/2/09 | 8.27 |
| 5/2/09 | 8.27 |
| 5/2/09 | 8.24 |
| 5/2/09 | 8.26 |
| 5/2/09 | 8.27 |
| 5/2/09 | 8.28 |
| 5/2/09 | 8.29 |
| 5/2/09 | 8.28 |
| 5/2/09 | 8.27 |
| 5/2/09 | 8.28 |
| 5/2/09 | 8.28 |
| 5/2/09 | 8.29 |
| 5/2/09 | 8.29 |
| 5/2/09 | 8.29 |
| 5/2/09 | 8.3 |
| 5/2/09 | 8.29 |
| 5/2/09 | 8.31 |
| 5/2/09 | 8.3 |
| 5/2/09 | 8.29 |
| 5/2/09 | 8.26 |
| 5/2/09 | 8.27 |
| 5/2/09 | 8.28 |
| 5/2/09 | 8.3 |
| 5/2/09 | 8.3 |
| 5/1/09 | 8.31 |
| 5/1/09 | 8.31 |
| 5/1/09 | 8.29 |
| 5/1/09 | 8.29 |
| 5/1/09 | 8.3 |
| 5/1/09 | 8.29 |
| 5/1/09 | 8.31 |
| 5/1/09 | 8.3 |
| 5/1/09 | 8.29 |
| 5/1/09 | 8.31 |
| 5/1/09 | 8.31 |
| 5/1/09 | 8.3 |
| 5/1/09 | 8.3 |
| 5/1/09 | 8.3 |
| 5/1/09 | 8.31 |
| 5/1/09 | 8.31 |
| 5/1/09 | 8.29 |
| 5/1/09 | 8.29 |
| 5/1/09 | 8.31 |
| 5/1/09 | 8.31 |
| 5/1/09 | 8.3 |
| 5/1/09 | 8.29 |
| 5/1/09 | 8.29 |
| 5/1/09 | 8.28 |
| 5/1/09 | 8.25 |
| 5/1/09 | 8.26 |
| 5/1/09 | 8.26 |
| 5/1/09 | 8.24 |
| 5/1/09 | 8.26 |
| 5/1/09 | 8.26 |
| 5/1/09 | 8.25 |
| 5/1/09 | 8.25 |
| 5/1/09 | 8.27 |
| 5/1/09 | 8.28 |
| 5/1/09 | 8.3 |
| 5/1/09 | 8.31 |
| 5/1/09 | 8.29 |
| 5/1/09 | 8.29 |
| 5/1/09 | 8.29 |
| 5/1/09 | 8.31 |
| 5/1/09 | 8.31 |
| 5/1/09 | 8.3 |
| 5/1/09 | 8.3 |
| 5/1/09 | 8.31 |
| 5/1/09 | 8.3 |
| 5/1/09 | 8.29 |
| 5/1/09 | 8.3 |
| 5/1/09 | 8.3 |
| 4/30/09 | 8.32 |
| 4/30/09 | 8.33 |
| 4/30/09 | 8.33 |
| 4/30/09 | 8.34 |
| 4/30/09 | 8.35 |
| 4/30/09 | 8.34 |
| 4/30/09 | 8.31 |
| 4/30/09 | 8.33 |
| 4/30/09 | 8.32 |
| 4/30/09 | 8.33 |
| 4/30/09 | 8.31 |
| 4/30/09 | 8.3 |
| 4/30/09 | 8.31 |
| 4/30/09 | 8.31 |
| 4/30/09 | 8.29 |
| 4/30/09 | 8.31 |
| 4/30/09 | 8.33 |
| 4/30/09 | 8.32 |
| 4/30/09 | 8.28 |
| 4/30/09 | 8.3 |
| 4/30/09 | 8.31 |
| 4/30/09 | 8.32 |
| 4/30/09 | 8.33 |
| 4/30/09 | 8.32 |
| 4/30/09 | 8.33 |
| 4/30/09 | 8.3 |
| 4/30/09 | 8.31 |
| 4/30/09 | 8.32 |
| 4/30/09 | 8.32 |
| 4/30/09 | 8.31 |
| 4/30/09 | 8.31 |
| 4/30/09 | 8.3 |
| 4/30/09 | 8.3 |
| 4/30/09 | 8.3 |
| 4/30/09 | 8.31 |
| 4/30/09 | 8.3 |
| 4/30/09 | 8.31 |
| 4/30/09 | 8.31 |
| 4/30/09 | 8.31 |
| 4/30/09 | 8.32 |
| 4/30/09 | 8.31 |
| 4/30/09 | 8.32 |
| 4/30/09 | 8.31 |
| 4/30/09 | 8.31 |
| 4/30/09 | 8.32 |
| 4/30/09 | 8.32 |
| 4/30/09 | 8.32 |
| 4/30/09 | 8.32 |
| 4/29/09 | 8.31 |
| 4/29/09 | 8.32 |
| 4/29/09 | 8.31 |
| 4/29/09 | 8.32 |
| 4/29/09 | 8.32 |
| 4/29/09 | 8.32 |
| 4/29/09 | 8.31 |
| 4/29/09 | 8.31 |
| 4/29/09 | 8.31 |
| 4/29/09 | 8.3 |
| 4/29/09 | 8.31 |
| 4/29/09 | 8.31 |
| 4/29/09 | 8.31 |
| 4/29/09 | 8.3 |
| 4/29/09 | 8.31 |
| 4/29/09 | 8.29 |
| 4/29/09 | 8.29 |
| 4/29/09 | 8.3 |
| 4/29/09 | 8.29 |
| 4/29/09 | 8.27 |
| 4/29/09 | 8.29 |
| 4/29/09 | 8.28 |
| 4/29/09 | 8.29 |
| 4/29/09 | 8.27 |
| 4/29/09 | 8.27 |
| 4/29/09 | 8.27 |
| 4/29/09 | 8.26 |
| 4/29/09 | 8.27 |
| 4/29/09 | 8.27 |
| 4/29/09 | 8.27 |
| 4/29/09 | 8.25 |
| 4/29/09 | 8.23 |
| 4/29/09 | 8.23 |
| 4/29/09 | 8.26 |
| 4/29/09 | 8.26 |
| 4/29/09 | 8.27 |
| 4/29/09 | 8.27 |
| 4/29/09 | 8.28 |
| 4/29/09 | 8.27 |
| 4/29/09 | 8.27 |
| 4/29/09 | 8.25 |
| 4/29/09 | 8.25 |
| 4/29/09 | 8.25 |
| 4/29/09 | 8.25 |
| 4/29/09 | 8.26 |
| 4/29/09 | 8.26 |
| 4/29/09 | 8.25 |
| 4/29/09 | 8.26 |
| 4/28/09 | 8.26 |
| 4/28/09 | 8.27 |
| 4/28/09 | 8.26 |
| 4/28/09 | 8.26 |
| 4/28/09 | 8.23 |
| 4/28/09 | 8.23 |
| 4/28/09 | 8.25 |
| 4/28/09 | 8.2 |
| 4/28/09 | 8.16 |
| 4/28/09 | 8.21 |
| 4/28/09 | 8.26 |
| 4/28/09 | 8.2 |
| 4/28/09 | 8.28 |
| 4/28/09 | 8.28 |
| 4/28/09 | 8.28 |
| 4/28/09 | 8.27 |
| 4/28/09 | 8.27 |
| 4/28/09 | 8.26 |
| 4/28/09 | 8.26 |
| 4/28/09 | 8.27 |
| 4/28/09 | 8.26 |
| 4/28/09 | 8.25 |
| 4/28/09 | 8.27 |
| 4/28/09 | 8.26 |
| 4/28/09 | 8.25 |
| 4/28/09 | 8.25 |
| 4/28/09 | 8.24 |
| 4/28/09 | 8.25 |
| 4/28/09 | 8.22 |
| 4/28/09 | 8.16 |
| 4/28/09 | 8.13 |
| 4/28/09 | 8.17 |
| 4/28/09 | 8.22 |
| 4/28/09 | 8.22 |
| 4/28/09 | 8.23 |
| 4/28/09 | 8.23 |
| 4/28/09 | 8.23 |
| 4/28/09 | 8.23 |
| 4/28/09 | 8.23 |
| 4/28/09 | 8.22 |
| 4/28/09 | 8.22 |
| 4/28/09 | 8.17 |
| 4/28/09 | 8.17 |
| 4/28/09 | 8.19 |
| 4/28/09 | 8.2 |
| 4/28/09 | 8.17 |
| 4/28/09 | 8.21 |
| 4/28/09 | 8.07 |
| 4/27/09 | 8.2 |
| 4/27/09 | 8.14 |
| 4/27/09 | 8.18 |
| 4/27/09 | 8.21 |
| 4/27/09 | 8.16 |
| 4/27/09 | 8.17 |
| 4/27/09 | 8.24 |
| 4/27/09 | 8.21 |
| 4/27/09 | 8.22 |
| 4/27/09 | 8.18 |
| 4/27/09 | 8.1 |
| 4/27/09 | 8.17 |
| 4/27/09 | 8.2 |
| 4/27/09 | 8.18 |
| 4/27/09 | 8.16 |
| 4/27/09 | 8.19 |
| 4/27/09 | 8.2 |
| 4/27/09 | 8.23 |